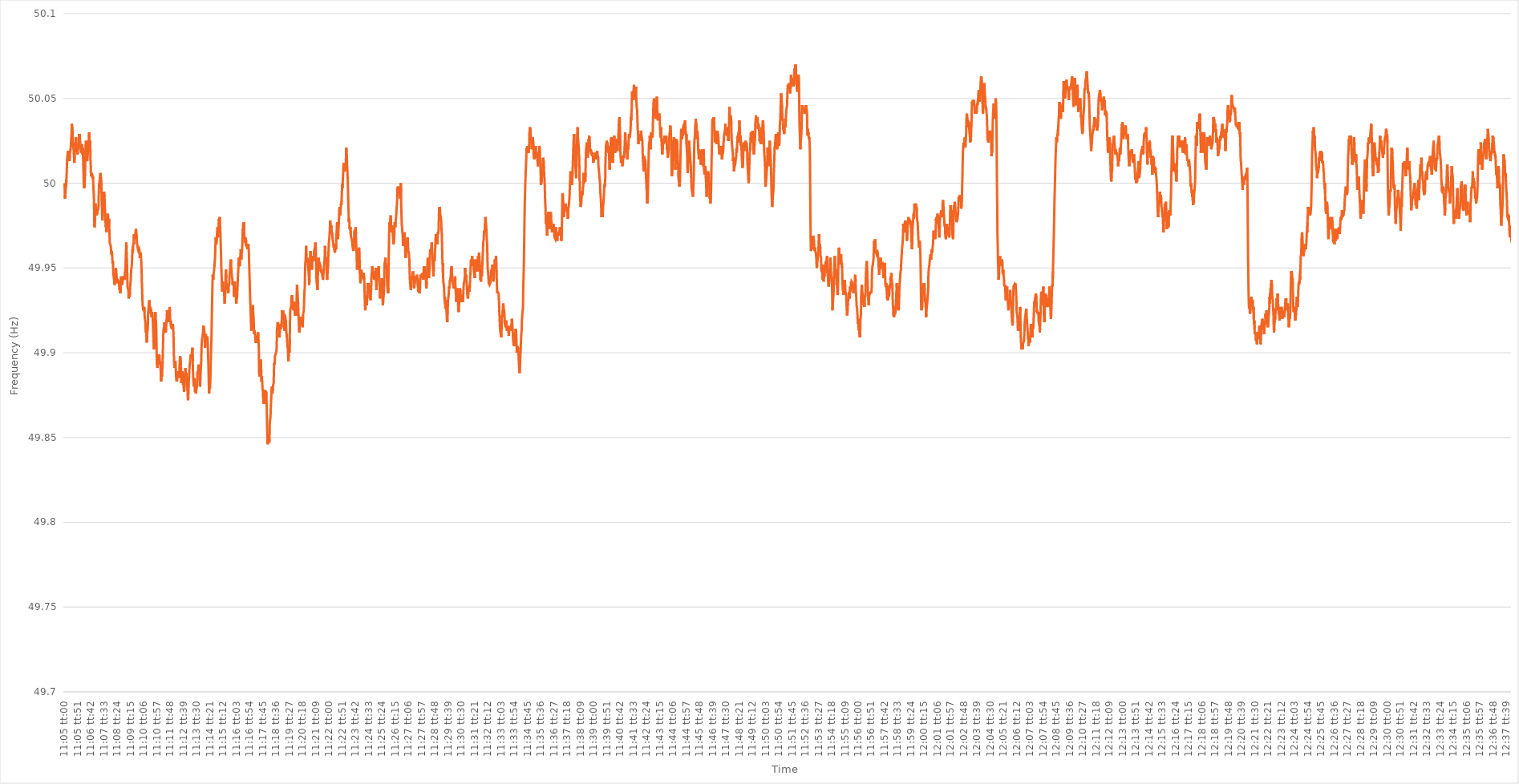
| Category | Series 0 |
|---|---|
| 0.4618055555555556 | 50 |
| 0.4618171296296296 | 49.998 |
| 0.4618287037037037 | 49.999 |
| 0.46184027777777775 | 49.991 |
| 0.4618518518518519 | 49.993 |
| 0.46186342592592594 | 49.995 |
| 0.46187500000000004 | 49.999 |
| 0.4618865740740741 | 49.998 |
| 0.4618981481481481 | 50.002 |
| 0.4619097222222222 | 50.005 |
| 0.46192129629629625 | 50.009 |
| 0.4619328703703704 | 50.014 |
| 0.46194444444444444 | 50.016 |
| 0.46195601851851853 | 50.017 |
| 0.46196759259259257 | 50.019 |
| 0.46197916666666666 | 50.016 |
| 0.4619907407407407 | 50.018 |
| 0.46200231481481485 | 50.016 |
| 0.4620138888888889 | 50.016 |
| 0.462025462962963 | 50.016 |
| 0.462037037037037 | 50.013 |
| 0.4620486111111111 | 50.016 |
| 0.46206018518518516 | 50.016 |
| 0.4620717592592593 | 50.016 |
| 0.46208333333333335 | 50.02 |
| 0.46209490740740744 | 50.021 |
| 0.4621064814814815 | 50.024 |
| 0.4621180555555556 | 50.027 |
| 0.4621296296296296 | 50.029 |
| 0.46214120370370365 | 50.035 |
| 0.4621527777777778 | 50.035 |
| 0.46216435185185184 | 50.032 |
| 0.46217592592592593 | 50.03 |
| 0.4621875 | 50.025 |
| 0.46219907407407407 | 50.025 |
| 0.4622106481481481 | 50.021 |
| 0.46222222222222226 | 50.02 |
| 0.4622337962962963 | 50.017 |
| 0.4622453703703704 | 50.017 |
| 0.46225694444444443 | 50.012 |
| 0.4622685185185185 | 50.017 |
| 0.46228009259259256 | 50.021 |
| 0.4622916666666667 | 50.024 |
| 0.46230324074074075 | 50.024 |
| 0.46231481481481485 | 50.023 |
| 0.4623263888888889 | 50.027 |
| 0.462337962962963 | 50.019 |
| 0.462349537037037 | 50.019 |
| 0.46236111111111106 | 50.021 |
| 0.4623726851851852 | 50.021 |
| 0.46238425925925924 | 50.021 |
| 0.46239583333333334 | 50.017 |
| 0.4624074074074074 | 50.021 |
| 0.4624189814814815 | 50.022 |
| 0.4624305555555555 | 50.02 |
| 0.46244212962962966 | 50.024 |
| 0.4624537037037037 | 50.025 |
| 0.4624652777777778 | 50.029 |
| 0.46247685185185183 | 50.025 |
| 0.46248842592592593 | 50.029 |
| 0.46249999999999997 | 50.027 |
| 0.4625115740740741 | 50.024 |
| 0.46252314814814816 | 50.023 |
| 0.46253472222222225 | 50.022 |
| 0.4625462962962963 | 50.019 |
| 0.4625578703703704 | 50.018 |
| 0.4625694444444444 | 50.021 |
| 0.46258101851851857 | 50.022 |
| 0.4625925925925926 | 50.023 |
| 0.46260416666666665 | 50.019 |
| 0.46261574074074074 | 50.017 |
| 0.4626273148148148 | 50.021 |
| 0.4626388888888889 | 50.017 |
| 0.4626504629629629 | 50.012 |
| 0.46266203703703707 | 50.006 |
| 0.4626736111111111 | 50 |
| 0.4626851851851852 | 49.997 |
| 0.46269675925925924 | 49.997 |
| 0.46270833333333333 | 49.998 |
| 0.46271990740740737 | 50.002 |
| 0.4627314814814815 | 50.006 |
| 0.46274305555555556 | 50.012 |
| 0.46275462962962965 | 50.021 |
| 0.4627662037037037 | 50.024 |
| 0.4627777777777778 | 50.025 |
| 0.4627893518518518 | 50.022 |
| 0.462800925925926 | 50.021 |
| 0.4628125 | 50.018 |
| 0.4628240740740741 | 50.013 |
| 0.46283564814814815 | 50.014 |
| 0.4628472222222222 | 50.014 |
| 0.4628587962962963 | 50.018 |
| 0.4628703703703703 | 50.018 |
| 0.46288194444444447 | 50.019 |
| 0.4628935185185185 | 50.024 |
| 0.4629050925925926 | 50.028 |
| 0.46291666666666664 | 50.03 |
| 0.46292824074074074 | 50.025 |
| 0.4629398148148148 | 50.024 |
| 0.4629513888888889 | 50.025 |
| 0.46296296296296297 | 50.023 |
| 0.46297453703703706 | 50.014 |
| 0.4629861111111111 | 50.01 |
| 0.4629976851851852 | 50.004 |
| 0.46300925925925923 | 50.004 |
| 0.4630208333333334 | 50.004 |
| 0.4630324074074074 | 50.006 |
| 0.4630439814814815 | 50.006 |
| 0.46305555555555555 | 50.006 |
| 0.46306712962962965 | 50.003 |
| 0.4630787037037037 | 50.004 |
| 0.4630902777777777 | 50.002 |
| 0.4631018518518519 | 49.999 |
| 0.4631134259259259 | 49.995 |
| 0.463125 | 49.993 |
| 0.46313657407407405 | 49.985 |
| 0.46314814814814814 | 49.976 |
| 0.4631597222222222 | 49.974 |
| 0.46317129629629633 | 49.983 |
| 0.46318287037037037 | 49.986 |
| 0.46319444444444446 | 49.988 |
| 0.4632060185185185 | 49.987 |
| 0.4632175925925926 | 49.985 |
| 0.46322916666666664 | 49.981 |
| 0.4632407407407408 | 49.982 |
| 0.4632523148148148 | 49.981 |
| 0.4632638888888889 | 49.983 |
| 0.46327546296296296 | 49.982 |
| 0.46328703703703705 | 49.985 |
| 0.4632986111111111 | 49.984 |
| 0.46331018518518513 | 49.985 |
| 0.4633217592592593 | 49.985 |
| 0.4633333333333333 | 49.986 |
| 0.4633449074074074 | 49.994 |
| 0.46335648148148145 | 49.999 |
| 0.46336805555555555 | 50 |
| 0.4633796296296296 | 49.999 |
| 0.46339120370370374 | 50.003 |
| 0.4634027777777778 | 50.004 |
| 0.46341435185185187 | 50.006 |
| 0.4634259259259259 | 50.005 |
| 0.4634375 | 50.004 |
| 0.46344907407407404 | 50.004 |
| 0.4634606481481482 | 50 |
| 0.46347222222222223 | 49.991 |
| 0.4634837962962963 | 49.987 |
| 0.46349537037037036 | 49.981 |
| 0.46350694444444446 | 49.978 |
| 0.4635185185185185 | 49.979 |
| 0.46353009259259265 | 49.983 |
| 0.4635416666666667 | 49.987 |
| 0.4635532407407407 | 49.992 |
| 0.4635648148148148 | 49.994 |
| 0.46357638888888886 | 49.995 |
| 0.46358796296296295 | 49.995 |
| 0.463599537037037 | 49.992 |
| 0.46361111111111114 | 49.987 |
| 0.4636226851851852 | 49.984 |
| 0.4636342592592593 | 49.981 |
| 0.4636458333333333 | 49.977 |
| 0.4636574074074074 | 49.974 |
| 0.46366898148148145 | 49.975 |
| 0.4636805555555556 | 49.974 |
| 0.46369212962962963 | 49.971 |
| 0.46370370370370373 | 49.975 |
| 0.46371527777777777 | 49.976 |
| 0.46372685185185186 | 49.978 |
| 0.4637384259259259 | 49.982 |
| 0.46375000000000005 | 49.982 |
| 0.4637615740740741 | 49.98 |
| 0.4637731481481482 | 49.976 |
| 0.4637847222222222 | 49.974 |
| 0.46379629629629626 | 49.979 |
| 0.46380787037037036 | 49.976 |
| 0.4638194444444444 | 49.972 |
| 0.46383101851851855 | 49.965 |
| 0.4638425925925926 | 49.965 |
| 0.4638541666666667 | 49.964 |
| 0.4638657407407407 | 49.964 |
| 0.4638773148148148 | 49.963 |
| 0.46388888888888885 | 49.961 |
| 0.463900462962963 | 49.959 |
| 0.46391203703703704 | 49.958 |
| 0.46392361111111113 | 49.96 |
| 0.4639351851851852 | 49.958 |
| 0.46394675925925927 | 49.956 |
| 0.4639583333333333 | 49.953 |
| 0.46396990740740746 | 49.954 |
| 0.4639814814814815 | 49.952 |
| 0.4639930555555556 | 49.947 |
| 0.46400462962962963 | 49.947 |
| 0.46401620370370367 | 49.944 |
| 0.46402777777777776 | 49.944 |
| 0.4640393518518518 | 49.942 |
| 0.46405092592592595 | 49.94 |
| 0.4640625 | 49.942 |
| 0.4640740740740741 | 49.943 |
| 0.4640856481481481 | 49.946 |
| 0.4640972222222222 | 49.947 |
| 0.46410879629629626 | 49.95 |
| 0.4641203703703704 | 49.95 |
| 0.46413194444444444 | 49.944 |
| 0.46414351851851854 | 49.944 |
| 0.4641550925925926 | 49.942 |
| 0.46416666666666667 | 49.942 |
| 0.4641782407407407 | 49.941 |
| 0.46418981481481486 | 49.943 |
| 0.4642013888888889 | 49.943 |
| 0.464212962962963 | 49.943 |
| 0.46422453703703703 | 49.943 |
| 0.4642361111111111 | 49.942 |
| 0.46424768518518517 | 49.941 |
| 0.4642592592592592 | 49.938 |
| 0.46427083333333335 | 49.937 |
| 0.4642824074074074 | 49.938 |
| 0.4642939814814815 | 49.939 |
| 0.4643055555555555 | 49.935 |
| 0.4643171296296296 | 49.939 |
| 0.46432870370370366 | 49.942 |
| 0.4643402777777778 | 49.945 |
| 0.46435185185185185 | 49.944 |
| 0.46436342592592594 | 49.941 |
| 0.464375 | 49.943 |
| 0.4643865740740741 | 49.94 |
| 0.4643981481481481 | 49.941 |
| 0.46440972222222227 | 49.942 |
| 0.4644212962962963 | 49.944 |
| 0.4644328703703704 | 49.945 |
| 0.46444444444444444 | 49.944 |
| 0.46445601851851853 | 49.944 |
| 0.46446759259259257 | 49.945 |
| 0.4644791666666667 | 49.944 |
| 0.46449074074074076 | 49.944 |
| 0.4645023148148148 | 49.943 |
| 0.4645138888888889 | 49.943 |
| 0.46452546296296293 | 49.948 |
| 0.464537037037037 | 49.951 |
| 0.46454861111111106 | 49.956 |
| 0.4645601851851852 | 49.961 |
| 0.46457175925925925 | 49.965 |
| 0.46458333333333335 | 49.961 |
| 0.4645949074074074 | 49.956 |
| 0.4646064814814815 | 49.951 |
| 0.4646180555555555 | 49.944 |
| 0.46462962962962967 | 49.939 |
| 0.4646412037037037 | 49.938 |
| 0.4646527777777778 | 49.938 |
| 0.46466435185185184 | 49.937 |
| 0.46467592592592594 | 49.932 |
| 0.4646875 | 49.932 |
| 0.4646990740740741 | 49.934 |
| 0.46471064814814816 | 49.934 |
| 0.4647222222222222 | 49.933 |
| 0.4647337962962963 | 49.936 |
| 0.46474537037037034 | 49.939 |
| 0.46475694444444443 | 49.941 |
| 0.46476851851851847 | 49.943 |
| 0.4647800925925926 | 49.946 |
| 0.46479166666666666 | 49.949 |
| 0.46480324074074075 | 49.95 |
| 0.4648148148148148 | 49.951 |
| 0.4648263888888889 | 49.954 |
| 0.4648379629629629 | 49.958 |
| 0.4648495370370371 | 49.961 |
| 0.4648611111111111 | 49.959 |
| 0.4648726851851852 | 49.963 |
| 0.46488425925925925 | 49.964 |
| 0.46489583333333334 | 49.965 |
| 0.4649074074074074 | 49.964 |
| 0.46491898148148153 | 49.97 |
| 0.46493055555555557 | 49.97 |
| 0.46494212962962966 | 49.967 |
| 0.4649537037037037 | 49.967 |
| 0.4649652777777778 | 49.968 |
| 0.46497685185185184 | 49.97 |
| 0.4649884259259259 | 49.97 |
| 0.465 | 49.973 |
| 0.46501157407407406 | 49.972 |
| 0.46502314814814816 | 49.972 |
| 0.4650347222222222 | 49.969 |
| 0.4650462962962963 | 49.965 |
| 0.46505787037037033 | 49.965 |
| 0.4650694444444445 | 49.963 |
| 0.4650810185185185 | 49.962 |
| 0.4650925925925926 | 49.961 |
| 0.46510416666666665 | 49.961 |
| 0.46511574074074075 | 49.96 |
| 0.4651273148148148 | 49.96 |
| 0.46513888888888894 | 49.96 |
| 0.465150462962963 | 49.961 |
| 0.46516203703703707 | 49.96 |
| 0.4651736111111111 | 49.956 |
| 0.4651851851851852 | 49.958 |
| 0.46519675925925924 | 49.959 |
| 0.4652083333333333 | 49.959 |
| 0.46521990740740743 | 49.958 |
| 0.46523148148148147 | 49.958 |
| 0.46524305555555556 | 49.953 |
| 0.4652546296296296 | 49.948 |
| 0.4652662037037037 | 49.941 |
| 0.46527777777777773 | 49.937 |
| 0.4652893518518519 | 49.932 |
| 0.4653009259259259 | 49.928 |
| 0.4653125 | 49.927 |
| 0.46532407407407406 | 49.925 |
| 0.46533564814814815 | 49.926 |
| 0.4653472222222222 | 49.925 |
| 0.46535879629629634 | 49.926 |
| 0.4653703703703704 | 49.927 |
| 0.4653819444444445 | 49.924 |
| 0.4653935185185185 | 49.921 |
| 0.4654050925925926 | 49.92 |
| 0.46541666666666665 | 49.919 |
| 0.4654282407407408 | 49.917 |
| 0.46543981481481483 | 49.912 |
| 0.4654513888888889 | 49.912 |
| 0.46546296296296297 | 49.913 |
| 0.465474537037037 | 49.909 |
| 0.4654861111111111 | 49.906 |
| 0.46549768518518514 | 49.909 |
| 0.4655092592592593 | 49.912 |
| 0.46552083333333333 | 49.912 |
| 0.4655324074074074 | 49.915 |
| 0.46554398148148146 | 49.923 |
| 0.46555555555555556 | 49.925 |
| 0.4655671296296296 | 49.926 |
| 0.46557870370370374 | 49.929 |
| 0.4655902777777778 | 49.929 |
| 0.4656018518518519 | 49.931 |
| 0.4656134259259259 | 49.928 |
| 0.465625 | 49.927 |
| 0.46563657407407405 | 49.926 |
| 0.4656481481481482 | 49.927 |
| 0.46565972222222224 | 49.923 |
| 0.46567129629629633 | 49.926 |
| 0.46568287037037037 | 49.924 |
| 0.4656944444444444 | 49.921 |
| 0.4657060185185185 | 49.922 |
| 0.46571759259259254 | 49.924 |
| 0.4657291666666667 | 49.923 |
| 0.46574074074074073 | 49.922 |
| 0.4657523148148148 | 49.92 |
| 0.46576388888888887 | 49.916 |
| 0.46577546296296296 | 49.912 |
| 0.465787037037037 | 49.908 |
| 0.46579861111111115 | 49.904 |
| 0.4658101851851852 | 49.902 |
| 0.4658217592592593 | 49.908 |
| 0.4658333333333333 | 49.909 |
| 0.4658449074074074 | 49.913 |
| 0.46585648148148145 | 49.918 |
| 0.4658680555555556 | 49.924 |
| 0.46587962962962964 | 49.921 |
| 0.46589120370370374 | 49.919 |
| 0.4659027777777778 | 49.917 |
| 0.4659143518518518 | 49.91 |
| 0.4659259259259259 | 49.9 |
| 0.46593749999999995 | 49.893 |
| 0.4659490740740741 | 49.892 |
| 0.46596064814814814 | 49.891 |
| 0.46597222222222223 | 49.892 |
| 0.46598379629629627 | 49.894 |
| 0.46599537037037037 | 49.898 |
| 0.4660069444444444 | 49.899 |
| 0.46601851851851855 | 49.899 |
| 0.4660300925925926 | 49.898 |
| 0.4660416666666667 | 49.899 |
| 0.4660532407407407 | 49.897 |
| 0.4660648148148148 | 49.893 |
| 0.46607638888888886 | 49.895 |
| 0.466087962962963 | 49.895 |
| 0.46609953703703705 | 49.893 |
| 0.46611111111111114 | 49.887 |
| 0.4661226851851852 | 49.883 |
| 0.4661342592592593 | 49.885 |
| 0.4661458333333333 | 49.888 |
| 0.46615740740740735 | 49.886 |
| 0.4661689814814815 | 49.887 |
| 0.46618055555555554 | 49.891 |
| 0.46619212962962964 | 49.895 |
| 0.4662037037037037 | 49.901 |
| 0.46621527777777777 | 49.907 |
| 0.4662268518518518 | 49.912 |
| 0.46623842592592596 | 49.914 |
| 0.46625 | 49.914 |
| 0.4662615740740741 | 49.916 |
| 0.46627314814814813 | 49.918 |
| 0.4662847222222222 | 49.916 |
| 0.46629629629629626 | 49.916 |
| 0.4663078703703704 | 49.914 |
| 0.46631944444444445 | 49.915 |
| 0.46633101851851855 | 49.912 |
| 0.4663425925925926 | 49.914 |
| 0.4663541666666667 | 49.916 |
| 0.4663657407407407 | 49.919 |
| 0.46637731481481487 | 49.92 |
| 0.4663888888888889 | 49.925 |
| 0.46640046296296295 | 49.925 |
| 0.46641203703703704 | 49.925 |
| 0.4664236111111111 | 49.921 |
| 0.4664351851851852 | 49.919 |
| 0.4664467592592592 | 49.919 |
| 0.46645833333333336 | 49.918 |
| 0.4664699074074074 | 49.918 |
| 0.4664814814814815 | 49.92 |
| 0.46649305555555554 | 49.926 |
| 0.46650462962962963 | 49.927 |
| 0.46651620370370367 | 49.924 |
| 0.4665277777777778 | 49.92 |
| 0.46653935185185186 | 49.918 |
| 0.46655092592592595 | 49.919 |
| 0.4665625 | 49.919 |
| 0.4665740740740741 | 49.915 |
| 0.4665856481481481 | 49.915 |
| 0.4665972222222223 | 49.915 |
| 0.4666087962962963 | 49.914 |
| 0.46662037037037035 | 49.916 |
| 0.46663194444444445 | 49.916 |
| 0.4666435185185185 | 49.917 |
| 0.4666550925925926 | 49.916 |
| 0.4666666666666666 | 49.914 |
| 0.46667824074074077 | 49.91 |
| 0.4666898148148148 | 49.902 |
| 0.4667013888888889 | 49.896 |
| 0.46671296296296294 | 49.893 |
| 0.46672453703703703 | 49.891 |
| 0.4667361111111111 | 49.891 |
| 0.4667476851851852 | 49.893 |
| 0.46675925925925926 | 49.895 |
| 0.46677083333333336 | 49.894 |
| 0.4667824074074074 | 49.889 |
| 0.4667939814814815 | 49.886 |
| 0.46680555555555553 | 49.884 |
| 0.4668171296296297 | 49.883 |
| 0.4668287037037037 | 49.883 |
| 0.4668402777777778 | 49.884 |
| 0.46685185185185185 | 49.886 |
| 0.4668634259259259 | 49.887 |
| 0.466875 | 49.889 |
| 0.466886574074074 | 49.888 |
| 0.4668981481481482 | 49.887 |
| 0.4669097222222222 | 49.887 |
| 0.4669212962962963 | 49.885 |
| 0.46693287037037035 | 49.886 |
| 0.46694444444444444 | 49.891 |
| 0.4669560185185185 | 49.895 |
| 0.46696759259259263 | 49.897 |
| 0.46697916666666667 | 49.898 |
| 0.46699074074074076 | 49.898 |
| 0.4670023148148148 | 49.893 |
| 0.4670138888888889 | 49.89 |
| 0.46702546296296293 | 49.882 |
| 0.4670370370370371 | 49.883 |
| 0.4670486111111111 | 49.886 |
| 0.4670601851851852 | 49.888 |
| 0.46707175925925926 | 49.889 |
| 0.46708333333333335 | 49.885 |
| 0.4670949074074074 | 49.883 |
| 0.46710648148148143 | 49.881 |
| 0.4671180555555556 | 49.883 |
| 0.4671296296296296 | 49.881 |
| 0.4671412037037037 | 49.878 |
| 0.46715277777777775 | 49.877 |
| 0.46716435185185184 | 49.881 |
| 0.4671759259259259 | 49.885 |
| 0.46718750000000003 | 49.887 |
| 0.46719907407407407 | 49.889 |
| 0.46721064814814817 | 49.891 |
| 0.4672222222222222 | 49.888 |
| 0.4672337962962963 | 49.887 |
| 0.46724537037037034 | 49.886 |
| 0.4672569444444445 | 49.888 |
| 0.4672685185185185 | 49.883 |
| 0.4672800925925926 | 49.88 |
| 0.46729166666666666 | 49.879 |
| 0.46730324074074076 | 49.878 |
| 0.4673148148148148 | 49.874 |
| 0.46732638888888883 | 49.872 |
| 0.467337962962963 | 49.874 |
| 0.467349537037037 | 49.879 |
| 0.4673611111111111 | 49.884 |
| 0.46737268518518515 | 49.886 |
| 0.46738425925925925 | 49.89 |
| 0.4673958333333333 | 49.892 |
| 0.46740740740740744 | 49.892 |
| 0.4674189814814815 | 49.895 |
| 0.46743055555555557 | 49.897 |
| 0.4674421296296296 | 49.898 |
| 0.4674537037037037 | 49.899 |
| 0.46746527777777774 | 49.897 |
| 0.4674768518518519 | 49.897 |
| 0.46748842592592593 | 49.899 |
| 0.4675 | 49.899 |
| 0.46751157407407407 | 49.899 |
| 0.46752314814814816 | 49.903 |
| 0.4675347222222222 | 49.895 |
| 0.46754629629629635 | 49.889 |
| 0.4675578703703704 | 49.885 |
| 0.4675694444444445 | 49.883 |
| 0.4675810185185185 | 49.881 |
| 0.46759259259259256 | 49.88 |
| 0.46760416666666665 | 49.883 |
| 0.4676157407407407 | 49.885 |
| 0.46762731481481484 | 49.882 |
| 0.4676388888888889 | 49.877 |
| 0.467650462962963 | 49.878 |
| 0.467662037037037 | 49.877 |
| 0.4676736111111111 | 49.876 |
| 0.46768518518518515 | 49.877 |
| 0.4676967592592593 | 49.877 |
| 0.46770833333333334 | 49.879 |
| 0.46771990740740743 | 49.88 |
| 0.46773148148148147 | 49.882 |
| 0.46774305555555556 | 49.887 |
| 0.4677546296296296 | 49.889 |
| 0.46776620370370375 | 49.888 |
| 0.4677777777777778 | 49.889 |
| 0.4677893518518519 | 49.892 |
| 0.4678009259259259 | 49.893 |
| 0.46781249999999996 | 49.892 |
| 0.46782407407407406 | 49.889 |
| 0.4678356481481481 | 49.888 |
| 0.46784722222222225 | 49.884 |
| 0.4678587962962963 | 49.88 |
| 0.4678703703703704 | 49.881 |
| 0.4678819444444444 | 49.886 |
| 0.4678935185185185 | 49.89 |
| 0.46790509259259255 | 49.892 |
| 0.4679166666666667 | 49.896 |
| 0.46792824074074074 | 49.903 |
| 0.46793981481481484 | 49.906 |
| 0.4679513888888889 | 49.908 |
| 0.46796296296296297 | 49.909 |
| 0.467974537037037 | 49.91 |
| 0.46798611111111116 | 49.911 |
| 0.4679976851851852 | 49.913 |
| 0.4680092592592593 | 49.916 |
| 0.46802083333333333 | 49.916 |
| 0.4680324074074074 | 49.915 |
| 0.46804398148148146 | 49.914 |
| 0.4680555555555555 | 49.913 |
| 0.46806712962962965 | 49.909 |
| 0.4680787037037037 | 49.905 |
| 0.4680902777777778 | 49.903 |
| 0.4681018518518518 | 49.909 |
| 0.4681134259259259 | 49.91 |
| 0.46812499999999996 | 49.911 |
| 0.4681365740740741 | 49.907 |
| 0.46814814814814815 | 49.909 |
| 0.46815972222222224 | 49.909 |
| 0.4681712962962963 | 49.909 |
| 0.4681828703703704 | 49.909 |
| 0.4681944444444444 | 49.909 |
| 0.46820601851851856 | 49.905 |
| 0.4682175925925926 | 49.9 |
| 0.4682291666666667 | 49.895 |
| 0.46824074074074074 | 49.89 |
| 0.46825231481481483 | 49.882 |
| 0.46826388888888887 | 49.876 |
| 0.468275462962963 | 49.879 |
| 0.46828703703703706 | 49.88 |
| 0.4682986111111111 | 49.879 |
| 0.4683101851851852 | 49.88 |
| 0.46832175925925923 | 49.884 |
| 0.4683333333333333 | 49.891 |
| 0.46834490740740736 | 49.897 |
| 0.4683564814814815 | 49.903 |
| 0.46836805555555555 | 49.907 |
| 0.46837962962962965 | 49.915 |
| 0.4683912037037037 | 49.924 |
| 0.4684027777777778 | 49.932 |
| 0.4684143518518518 | 49.939 |
| 0.46842592592592597 | 49.946 |
| 0.4684375 | 49.945 |
| 0.4684490740740741 | 49.943 |
| 0.46846064814814814 | 49.946 |
| 0.46847222222222223 | 49.947 |
| 0.4684837962962963 | 49.948 |
| 0.4684953703703704 | 49.95 |
| 0.46850694444444446 | 49.951 |
| 0.4685185185185185 | 49.954 |
| 0.4685300925925926 | 49.956 |
| 0.46854166666666663 | 49.96 |
| 0.46855324074074073 | 49.965 |
| 0.46856481481481477 | 49.968 |
| 0.4685763888888889 | 49.966 |
| 0.46858796296296296 | 49.964 |
| 0.46859953703703705 | 49.964 |
| 0.4686111111111111 | 49.968 |
| 0.4686226851851852 | 49.971 |
| 0.4686342592592592 | 49.973 |
| 0.4686458333333334 | 49.974 |
| 0.4686574074074074 | 49.969 |
| 0.4686689814814815 | 49.968 |
| 0.46868055555555554 | 49.97 |
| 0.46869212962962964 | 49.975 |
| 0.4687037037037037 | 49.979 |
| 0.46871527777777783 | 49.978 |
| 0.46872685185185187 | 49.979 |
| 0.46873842592592596 | 49.98 |
| 0.46875 | 49.976 |
| 0.46876157407407404 | 49.974 |
| 0.46877314814814813 | 49.97 |
| 0.46878472222222217 | 49.964 |
| 0.4687962962962963 | 49.959 |
| 0.46880787037037036 | 49.952 |
| 0.46881944444444446 | 49.947 |
| 0.4688310185185185 | 49.942 |
| 0.4688425925925926 | 49.937 |
| 0.4688541666666666 | 49.936 |
| 0.4688657407407408 | 49.938 |
| 0.4688773148148148 | 49.942 |
| 0.4688888888888889 | 49.94 |
| 0.46890046296296295 | 49.937 |
| 0.46891203703703704 | 49.937 |
| 0.4689236111111111 | 49.938 |
| 0.46893518518518523 | 49.936 |
| 0.46894675925925927 | 49.932 |
| 0.46895833333333337 | 49.929 |
| 0.4689699074074074 | 49.931 |
| 0.4689814814814815 | 49.933 |
| 0.46899305555555554 | 49.937 |
| 0.4690046296296296 | 49.946 |
| 0.4690162037037037 | 49.949 |
| 0.46902777777777777 | 49.944 |
| 0.46903935185185186 | 49.941 |
| 0.4690509259259259 | 49.941 |
| 0.4690625 | 49.939 |
| 0.46907407407407403 | 49.937 |
| 0.4690856481481482 | 49.94 |
| 0.4690972222222222 | 49.94 |
| 0.4691087962962963 | 49.938 |
| 0.46912037037037035 | 49.935 |
| 0.46913194444444445 | 49.937 |
| 0.4691435185185185 | 49.94 |
| 0.46915509259259264 | 49.94 |
| 0.4691666666666667 | 49.941 |
| 0.46917824074074077 | 49.946 |
| 0.4691898148148148 | 49.947 |
| 0.4692013888888889 | 49.947 |
| 0.46921296296296294 | 49.952 |
| 0.469224537037037 | 49.954 |
| 0.46923611111111113 | 49.955 |
| 0.46924768518518517 | 49.953 |
| 0.46925925925925926 | 49.949 |
| 0.4692708333333333 | 49.947 |
| 0.4692824074074074 | 49.945 |
| 0.46929398148148144 | 49.945 |
| 0.4693055555555556 | 49.943 |
| 0.4693171296296296 | 49.94 |
| 0.4693287037037037 | 49.942 |
| 0.46934027777777776 | 49.942 |
| 0.46935185185185185 | 49.941 |
| 0.4693634259259259 | 49.939 |
| 0.46937500000000004 | 49.933 |
| 0.4693865740740741 | 49.935 |
| 0.4693981481481482 | 49.935 |
| 0.4694097222222222 | 49.942 |
| 0.4694212962962963 | 49.941 |
| 0.46943287037037035 | 49.937 |
| 0.4694444444444445 | 49.938 |
| 0.46945601851851854 | 49.936 |
| 0.46946759259259263 | 49.931 |
| 0.46947916666666667 | 49.929 |
| 0.4694907407407407 | 49.93 |
| 0.4695023148148148 | 49.932 |
| 0.46951388888888884 | 49.933 |
| 0.469525462962963 | 49.937 |
| 0.46953703703703703 | 49.94 |
| 0.4695486111111111 | 49.944 |
| 0.46956018518518516 | 49.947 |
| 0.46957175925925926 | 49.95 |
| 0.4695833333333333 | 49.956 |
| 0.46959490740740745 | 49.955 |
| 0.4696064814814815 | 49.952 |
| 0.4696180555555556 | 49.952 |
| 0.4696296296296296 | 49.951 |
| 0.4696412037037037 | 49.953 |
| 0.46965277777777775 | 49.956 |
| 0.4696643518518519 | 49.958 |
| 0.46967592592592594 | 49.961 |
| 0.46968750000000004 | 49.96 |
| 0.4696990740740741 | 49.955 |
| 0.4697106481481481 | 49.956 |
| 0.4697222222222222 | 49.959 |
| 0.46973379629629625 | 49.96 |
| 0.4697453703703704 | 49.963 |
| 0.46975694444444444 | 49.967 |
| 0.46976851851851853 | 49.973 |
| 0.46978009259259257 | 49.972 |
| 0.46979166666666666 | 49.976 |
| 0.4698032407407407 | 49.975 |
| 0.46981481481481485 | 49.977 |
| 0.4698263888888889 | 49.972 |
| 0.469837962962963 | 49.969 |
| 0.469849537037037 | 49.968 |
| 0.4698611111111111 | 49.967 |
| 0.46987268518518516 | 49.965 |
| 0.4698842592592593 | 49.968 |
| 0.46989583333333335 | 49.965 |
| 0.46990740740740744 | 49.967 |
| 0.4699189814814815 | 49.963 |
| 0.4699305555555555 | 49.964 |
| 0.4699421296296296 | 49.964 |
| 0.46995370370370365 | 49.964 |
| 0.4699652777777778 | 49.962 |
| 0.46997685185185184 | 49.961 |
| 0.46998842592592593 | 49.964 |
| 0.47 | 49.963 |
| 0.47001157407407407 | 49.964 |
| 0.4700231481481481 | 49.963 |
| 0.47003472222222226 | 49.961 |
| 0.4700462962962963 | 49.956 |
| 0.4700578703703704 | 49.95 |
| 0.47006944444444443 | 49.945 |
| 0.4700810185185185 | 49.94 |
| 0.47009259259259256 | 49.934 |
| 0.4701041666666667 | 49.93 |
| 0.47011574074074075 | 49.925 |
| 0.47012731481481485 | 49.921 |
| 0.4701388888888889 | 49.916 |
| 0.470150462962963 | 49.913 |
| 0.470162037037037 | 49.915 |
| 0.47017361111111117 | 49.919 |
| 0.4701851851851852 | 49.923 |
| 0.47019675925925924 | 49.927 |
| 0.47020833333333334 | 49.927 |
| 0.4702199074074074 | 49.928 |
| 0.4702314814814815 | 49.924 |
| 0.4702430555555555 | 49.922 |
| 0.47025462962962966 | 49.919 |
| 0.4702662037037037 | 49.914 |
| 0.4702777777777778 | 49.911 |
| 0.47028935185185183 | 49.913 |
| 0.47030092592592593 | 49.912 |
| 0.47031249999999997 | 49.911 |
| 0.4703240740740741 | 49.91 |
| 0.47033564814814816 | 49.906 |
| 0.47034722222222225 | 49.91 |
| 0.4703587962962963 | 49.906 |
| 0.4703703703703704 | 49.908 |
| 0.4703819444444444 | 49.906 |
| 0.47039351851851857 | 49.909 |
| 0.4704050925925926 | 49.91 |
| 0.47041666666666665 | 49.91 |
| 0.47042824074074074 | 49.909 |
| 0.4704398148148148 | 49.909 |
| 0.4704513888888889 | 49.912 |
| 0.4704629629629629 | 49.909 |
| 0.47047453703703707 | 49.906 |
| 0.4704861111111111 | 49.902 |
| 0.4704976851851852 | 49.889 |
| 0.47050925925925924 | 49.886 |
| 0.47052083333333333 | 49.887 |
| 0.47053240740740737 | 49.89 |
| 0.4705439814814815 | 49.89 |
| 0.47055555555555556 | 49.894 |
| 0.47056712962962965 | 49.896 |
| 0.4705787037037037 | 49.896 |
| 0.4705902777777778 | 49.889 |
| 0.4706018518518518 | 49.883 |
| 0.470613425925926 | 49.886 |
| 0.470625 | 49.885 |
| 0.47063657407407405 | 49.883 |
| 0.47064814814814815 | 49.879 |
| 0.4706597222222222 | 49.878 |
| 0.4706712962962963 | 49.877 |
| 0.4706828703703703 | 49.871 |
| 0.47069444444444447 | 49.87 |
| 0.4707060185185185 | 49.872 |
| 0.4707175925925926 | 49.871 |
| 0.47072916666666664 | 49.87 |
| 0.47074074074074074 | 49.87 |
| 0.4707523148148148 | 49.874 |
| 0.4707638888888889 | 49.878 |
| 0.47077546296296297 | 49.877 |
| 0.47078703703703706 | 49.876 |
| 0.4707986111111111 | 49.875 |
| 0.4708101851851852 | 49.877 |
| 0.47082175925925923 | 49.873 |
| 0.4708333333333334 | 49.87 |
| 0.4708449074074074 | 49.863 |
| 0.4708564814814815 | 49.855 |
| 0.47086805555555555 | 49.849 |
| 0.47087962962962965 | 49.846 |
| 0.4708912037037037 | 49.848 |
| 0.4709027777777777 | 49.852 |
| 0.4709143518518519 | 49.851 |
| 0.4709259259259259 | 49.852 |
| 0.4709375 | 49.849 |
| 0.47094907407407405 | 49.847 |
| 0.47096064814814814 | 49.849 |
| 0.4709722222222222 | 49.858 |
| 0.47098379629629633 | 49.86 |
| 0.47099537037037037 | 49.861 |
| 0.47100694444444446 | 49.863 |
| 0.4710185185185185 | 49.868 |
| 0.4710300925925926 | 49.871 |
| 0.47104166666666664 | 49.874 |
| 0.4710532407407408 | 49.878 |
| 0.4710648148148148 | 49.88 |
| 0.4710763888888889 | 49.879 |
| 0.47108796296296296 | 49.876 |
| 0.47109953703703705 | 49.876 |
| 0.4711111111111111 | 49.879 |
| 0.47112268518518513 | 49.881 |
| 0.4711342592592593 | 49.881 |
| 0.4711458333333333 | 49.882 |
| 0.4711574074074074 | 49.889 |
| 0.47116898148148145 | 49.894 |
| 0.47118055555555555 | 49.893 |
| 0.4711921296296296 | 49.894 |
| 0.47120370370370374 | 49.898 |
| 0.4712152777777778 | 49.898 |
| 0.47122685185185187 | 49.898 |
| 0.4712384259259259 | 49.898 |
| 0.47125 | 49.9 |
| 0.47126157407407404 | 49.9 |
| 0.4712731481481482 | 49.901 |
| 0.47128472222222223 | 49.906 |
| 0.4712962962962963 | 49.914 |
| 0.47130787037037036 | 49.915 |
| 0.47131944444444446 | 49.918 |
| 0.4713310185185185 | 49.918 |
| 0.47134259259259265 | 49.918 |
| 0.4713541666666667 | 49.917 |
| 0.4713657407407407 | 49.917 |
| 0.4713773148148148 | 49.916 |
| 0.47138888888888886 | 49.915 |
| 0.47140046296296295 | 49.909 |
| 0.471412037037037 | 49.909 |
| 0.47142361111111114 | 49.915 |
| 0.4714351851851852 | 49.914 |
| 0.4714467592592593 | 49.916 |
| 0.4714583333333333 | 49.914 |
| 0.4714699074074074 | 49.915 |
| 0.47148148148148145 | 49.917 |
| 0.4714930555555556 | 49.915 |
| 0.47150462962962963 | 49.918 |
| 0.47151620370370373 | 49.921 |
| 0.47152777777777777 | 49.925 |
| 0.47153935185185186 | 49.92 |
| 0.4715509259259259 | 49.921 |
| 0.47156250000000005 | 49.925 |
| 0.4715740740740741 | 49.923 |
| 0.4715856481481482 | 49.921 |
| 0.4715972222222222 | 49.922 |
| 0.47160879629629626 | 49.923 |
| 0.47162037037037036 | 49.916 |
| 0.4716319444444444 | 49.913 |
| 0.47164351851851855 | 49.916 |
| 0.4716550925925926 | 49.922 |
| 0.4716666666666667 | 49.92 |
| 0.4716782407407407 | 49.92 |
| 0.4716898148148148 | 49.919 |
| 0.47170138888888885 | 49.919 |
| 0.471712962962963 | 49.912 |
| 0.47172453703703704 | 49.911 |
| 0.47173611111111113 | 49.909 |
| 0.4717476851851852 | 49.907 |
| 0.47175925925925927 | 49.904 |
| 0.4717708333333333 | 49.903 |
| 0.47178240740740746 | 49.902 |
| 0.4717939814814815 | 49.897 |
| 0.4718055555555556 | 49.895 |
| 0.47181712962962963 | 49.899 |
| 0.47182870370370367 | 49.902 |
| 0.47184027777777776 | 49.901 |
| 0.4718518518518518 | 49.9 |
| 0.47186342592592595 | 49.908 |
| 0.471875 | 49.918 |
| 0.4718865740740741 | 49.925 |
| 0.4718981481481481 | 49.926 |
| 0.4719097222222222 | 49.926 |
| 0.47192129629629626 | 49.927 |
| 0.4719328703703704 | 49.928 |
| 0.47194444444444444 | 49.933 |
| 0.47195601851851854 | 49.932 |
| 0.4719675925925926 | 49.934 |
| 0.47197916666666667 | 49.932 |
| 0.4719907407407407 | 49.93 |
| 0.47200231481481486 | 49.928 |
| 0.4720138888888889 | 49.927 |
| 0.472025462962963 | 49.925 |
| 0.47203703703703703 | 49.928 |
| 0.4720486111111111 | 49.928 |
| 0.47206018518518517 | 49.928 |
| 0.4720717592592593 | 49.93 |
| 0.47208333333333335 | 49.927 |
| 0.4720949074074074 | 49.922 |
| 0.4721064814814815 | 49.923 |
| 0.4721180555555555 | 49.924 |
| 0.4721296296296296 | 49.922 |
| 0.47214120370370366 | 49.924 |
| 0.4721527777777778 | 49.922 |
| 0.47216435185185185 | 49.926 |
| 0.47217592592592594 | 49.935 |
| 0.4721875 | 49.94 |
| 0.4721990740740741 | 49.938 |
| 0.4722106481481481 | 49.936 |
| 0.47222222222222227 | 49.933 |
| 0.4722337962962963 | 49.93 |
| 0.4722453703703704 | 49.925 |
| 0.47225694444444444 | 49.921 |
| 0.47226851851851853 | 49.921 |
| 0.47228009259259257 | 49.913 |
| 0.4722916666666667 | 49.912 |
| 0.47230324074074076 | 49.914 |
| 0.4723148148148148 | 49.916 |
| 0.4723263888888889 | 49.917 |
| 0.47233796296296293 | 49.921 |
| 0.472349537037037 | 49.917 |
| 0.47236111111111106 | 49.916 |
| 0.4723726851851852 | 49.918 |
| 0.47238425925925925 | 49.918 |
| 0.47239583333333335 | 49.919 |
| 0.4724074074074074 | 49.917 |
| 0.4724189814814815 | 49.917 |
| 0.4724305555555555 | 49.916 |
| 0.47244212962962967 | 49.915 |
| 0.4724537037037037 | 49.922 |
| 0.4724652777777778 | 49.923 |
| 0.47247685185185184 | 49.923 |
| 0.47248842592592594 | 49.925 |
| 0.4725 | 49.928 |
| 0.4725115740740741 | 49.933 |
| 0.47252314814814816 | 49.937 |
| 0.4725347222222222 | 49.938 |
| 0.4725462962962963 | 49.947 |
| 0.47255787037037034 | 49.953 |
| 0.47256944444444443 | 49.954 |
| 0.47258101851851847 | 49.958 |
| 0.4725925925925926 | 49.963 |
| 0.47260416666666666 | 49.957 |
| 0.47261574074074075 | 49.957 |
| 0.4726273148148148 | 49.953 |
| 0.4726388888888889 | 49.955 |
| 0.4726504629629629 | 49.956 |
| 0.4726620370370371 | 49.955 |
| 0.4726736111111111 | 49.953 |
| 0.4726851851851852 | 49.951 |
| 0.47269675925925925 | 49.949 |
| 0.47270833333333334 | 49.947 |
| 0.4727199074074074 | 49.945 |
| 0.47273148148148153 | 49.94 |
| 0.47274305555555557 | 49.944 |
| 0.47275462962962966 | 49.944 |
| 0.4727662037037037 | 49.954 |
| 0.4727777777777778 | 49.956 |
| 0.47278935185185184 | 49.96 |
| 0.4728009259259259 | 49.955 |
| 0.4728125 | 49.956 |
| 0.47282407407407406 | 49.957 |
| 0.47283564814814816 | 49.955 |
| 0.4728472222222222 | 49.949 |
| 0.4728587962962963 | 49.952 |
| 0.47287037037037033 | 49.952 |
| 0.4728819444444445 | 49.952 |
| 0.4728935185185185 | 49.956 |
| 0.4729050925925926 | 49.957 |
| 0.47291666666666665 | 49.956 |
| 0.47292824074074075 | 49.954 |
| 0.4729398148148148 | 49.955 |
| 0.47295138888888894 | 49.96 |
| 0.472962962962963 | 49.96 |
| 0.47297453703703707 | 49.96 |
| 0.4729861111111111 | 49.962 |
| 0.4729976851851852 | 49.962 |
| 0.47300925925925924 | 49.965 |
| 0.4730208333333333 | 49.963 |
| 0.47303240740740743 | 49.958 |
| 0.47304398148148147 | 49.952 |
| 0.47305555555555556 | 49.944 |
| 0.4730671296296296 | 49.941 |
| 0.4730787037037037 | 49.94 |
| 0.47309027777777773 | 49.939 |
| 0.4731018518518519 | 49.937 |
| 0.4731134259259259 | 49.943 |
| 0.473125 | 49.948 |
| 0.47313657407407406 | 49.953 |
| 0.47314814814814815 | 49.956 |
| 0.4731597222222222 | 49.951 |
| 0.47317129629629634 | 49.951 |
| 0.4731828703703704 | 49.951 |
| 0.4731944444444445 | 49.951 |
| 0.4732060185185185 | 49.952 |
| 0.4732175925925926 | 49.951 |
| 0.47322916666666665 | 49.952 |
| 0.4732407407407407 | 49.952 |
| 0.47325231481481483 | 49.948 |
| 0.4732638888888889 | 49.949 |
| 0.47327546296296297 | 49.948 |
| 0.473287037037037 | 49.947 |
| 0.4732986111111111 | 49.949 |
| 0.47331018518518514 | 49.946 |
| 0.4733217592592593 | 49.946 |
| 0.47333333333333333 | 49.946 |
| 0.4733449074074074 | 49.943 |
| 0.47335648148148146 | 49.944 |
| 0.47336805555555556 | 49.946 |
| 0.4733796296296296 | 49.946 |
| 0.47339120370370374 | 49.95 |
| 0.4734027777777778 | 49.953 |
| 0.4734143518518519 | 49.954 |
| 0.4734259259259259 | 49.957 |
| 0.4734375 | 49.963 |
| 0.47344907407407405 | 49.961 |
| 0.4734606481481482 | 49.956 |
| 0.47347222222222224 | 49.953 |
| 0.47348379629629633 | 49.956 |
| 0.47349537037037037 | 49.954 |
| 0.4735069444444444 | 49.952 |
| 0.4735185185185185 | 49.945 |
| 0.47353009259259254 | 49.943 |
| 0.4735416666666667 | 49.944 |
| 0.47355324074074073 | 49.948 |
| 0.4735648148148148 | 49.949 |
| 0.47357638888888887 | 49.953 |
| 0.47358796296296296 | 49.958 |
| 0.473599537037037 | 49.961 |
| 0.47361111111111115 | 49.965 |
| 0.4736226851851852 | 49.965 |
| 0.4736342592592593 | 49.968 |
| 0.4736458333333333 | 49.971 |
| 0.4736574074074074 | 49.971 |
| 0.47366898148148145 | 49.978 |
| 0.4736805555555556 | 49.975 |
| 0.47369212962962964 | 49.971 |
| 0.47370370370370374 | 49.972 |
| 0.4737152777777778 | 49.975 |
| 0.4737268518518518 | 49.973 |
| 0.4737384259259259 | 49.97 |
| 0.47374999999999995 | 49.971 |
| 0.4737615740740741 | 49.971 |
| 0.47377314814814814 | 49.968 |
| 0.47378472222222223 | 49.966 |
| 0.47379629629629627 | 49.965 |
| 0.47380787037037037 | 49.965 |
| 0.4738194444444444 | 49.965 |
| 0.47383101851851855 | 49.962 |
| 0.4738425925925926 | 49.964 |
| 0.4738541666666667 | 49.964 |
| 0.4738657407407407 | 49.96 |
| 0.4738773148148148 | 49.959 |
| 0.47388888888888886 | 49.959 |
| 0.473900462962963 | 49.962 |
| 0.47391203703703705 | 49.964 |
| 0.47392361111111114 | 49.961 |
| 0.4739351851851852 | 49.963 |
| 0.4739467592592593 | 49.97 |
| 0.4739583333333333 | 49.971 |
| 0.47396990740740735 | 49.976 |
| 0.4739814814814815 | 49.977 |
| 0.47399305555555554 | 49.973 |
| 0.47400462962962964 | 49.968 |
| 0.4740162037037037 | 49.967 |
| 0.47402777777777777 | 49.97 |
| 0.4740393518518518 | 49.973 |
| 0.47405092592592596 | 49.976 |
| 0.4740625 | 49.98 |
| 0.4740740740740741 | 49.985 |
| 0.47408564814814813 | 49.986 |
| 0.4740972222222222 | 49.984 |
| 0.47410879629629626 | 49.981 |
| 0.4741203703703704 | 49.982 |
| 0.47413194444444445 | 49.985 |
| 0.47414351851851855 | 49.985 |
| 0.4741550925925926 | 49.988 |
| 0.4741666666666667 | 49.987 |
| 0.4741782407407407 | 49.99 |
| 0.47418981481481487 | 49.994 |
| 0.4742013888888889 | 49.999 |
| 0.47421296296296295 | 49.997 |
| 0.47422453703703704 | 50 |
| 0.4742361111111111 | 50.003 |
| 0.4742476851851852 | 50.006 |
| 0.4742592592592592 | 50.011 |
| 0.47427083333333336 | 50.011 |
| 0.4742824074074074 | 50.012 |
| 0.4742939814814815 | 50.011 |
| 0.47430555555555554 | 50.012 |
| 0.47431712962962963 | 50.011 |
| 0.47432870370370367 | 50.007 |
| 0.4743402777777778 | 50.009 |
| 0.47435185185185186 | 50.008 |
| 0.47436342592592595 | 50.011 |
| 0.474375 | 50.016 |
| 0.4743865740740741 | 50.021 |
| 0.4743981481481481 | 50.018 |
| 0.4744097222222223 | 50.017 |
| 0.4744212962962963 | 50.011 |
| 0.47443287037037035 | 50.008 |
| 0.47444444444444445 | 50.004 |
| 0.4744560185185185 | 50 |
| 0.4744675925925926 | 49.993 |
| 0.4744791666666666 | 49.987 |
| 0.47449074074074077 | 49.982 |
| 0.4745023148148148 | 49.977 |
| 0.4745138888888889 | 49.979 |
| 0.47452546296296294 | 49.977 |
| 0.47453703703703703 | 49.973 |
| 0.4745486111111111 | 49.974 |
| 0.4745601851851852 | 49.973 |
| 0.47457175925925926 | 49.974 |
| 0.47458333333333336 | 49.97 |
| 0.4745949074074074 | 49.97 |
| 0.4746064814814815 | 49.968 |
| 0.47461805555555553 | 49.968 |
| 0.4746296296296297 | 49.968 |
| 0.4746412037037037 | 49.966 |
| 0.4746527777777778 | 49.965 |
| 0.47466435185185185 | 49.963 |
| 0.47467592592592595 | 49.963 |
| 0.4746875 | 49.961 |
| 0.474699074074074 | 49.961 |
| 0.4747106481481482 | 49.96 |
| 0.4747222222222222 | 49.96 |
| 0.4747337962962963 | 49.966 |
| 0.47474537037037035 | 49.971 |
| 0.47475694444444444 | 49.972 |
| 0.4747685185185185 | 49.971 |
| 0.47478009259259263 | 49.971 |
| 0.47479166666666667 | 49.973 |
| 0.47480324074074076 | 49.974 |
| 0.4748148148148148 | 49.97 |
| 0.4748263888888889 | 49.965 |
| 0.47483796296296293 | 49.961 |
| 0.4748495370370371 | 49.958 |
| 0.4748611111111111 | 49.95 |
| 0.4748726851851852 | 49.949 |
| 0.47488425925925926 | 49.952 |
| 0.47489583333333335 | 49.953 |
| 0.4749074074074074 | 49.956 |
| 0.47491898148148143 | 49.957 |
| 0.4749305555555556 | 49.961 |
| 0.4749421296296296 | 49.96 |
| 0.4749537037037037 | 49.962 |
| 0.47496527777777775 | 49.961 |
| 0.47497685185185184 | 49.958 |
| 0.4749884259259259 | 49.947 |
| 0.47500000000000003 | 49.946 |
| 0.47501157407407407 | 49.941 |
| 0.47502314814814817 | 49.942 |
| 0.4750347222222222 | 49.942 |
| 0.4750462962962963 | 49.944 |
| 0.47505787037037034 | 49.949 |
| 0.4750694444444445 | 49.949 |
| 0.4750810185185185 | 49.946 |
| 0.4750925925925926 | 49.946 |
| 0.47510416666666666 | 49.946 |
| 0.47511574074074076 | 49.945 |
| 0.4751273148148148 | 49.945 |
| 0.47513888888888883 | 49.945 |
| 0.475150462962963 | 49.945 |
| 0.475162037037037 | 49.947 |
| 0.4751736111111111 | 49.947 |
| 0.47518518518518515 | 49.943 |
| 0.47519675925925925 | 49.939 |
| 0.4752083333333333 | 49.934 |
| 0.47521990740740744 | 49.928 |
| 0.4752314814814815 | 49.925 |
| 0.47524305555555557 | 49.926 |
| 0.4752546296296296 | 49.93 |
| 0.4752662037037037 | 49.934 |
| 0.47527777777777774 | 49.934 |
| 0.4752893518518519 | 49.934 |
| 0.47530092592592593 | 49.928 |
| 0.4753125 | 49.93 |
| 0.47532407407407407 | 49.933 |
| 0.47533564814814816 | 49.941 |
| 0.4753472222222222 | 49.94 |
| 0.47535879629629635 | 49.941 |
| 0.4753703703703704 | 49.94 |
| 0.4753819444444445 | 49.941 |
| 0.4753935185185185 | 49.94 |
| 0.47540509259259256 | 49.938 |
| 0.47541666666666665 | 49.935 |
| 0.4754282407407407 | 49.933 |
| 0.47543981481481484 | 49.933 |
| 0.4754513888888889 | 49.932 |
| 0.475462962962963 | 49.931 |
| 0.475474537037037 | 49.933 |
| 0.4754861111111111 | 49.935 |
| 0.47549768518518515 | 49.939 |
| 0.4755092592592593 | 49.945 |
| 0.47552083333333334 | 49.947 |
| 0.47553240740740743 | 49.948 |
| 0.47554398148148147 | 49.951 |
| 0.47555555555555556 | 49.95 |
| 0.4755671296296296 | 49.946 |
| 0.47557870370370375 | 49.947 |
| 0.4755902777777778 | 49.946 |
| 0.4756018518518519 | 49.947 |
| 0.4756134259259259 | 49.944 |
| 0.47562499999999996 | 49.943 |
| 0.47563657407407406 | 49.944 |
| 0.4756481481481481 | 49.945 |
| 0.47565972222222225 | 49.948 |
| 0.4756712962962963 | 49.945 |
| 0.4756828703703704 | 49.946 |
| 0.4756944444444444 | 49.95 |
| 0.4757060185185185 | 49.947 |
| 0.47571759259259255 | 49.94 |
| 0.4757291666666667 | 49.937 |
| 0.47574074074074074 | 49.94 |
| 0.47575231481481484 | 49.943 |
| 0.4757638888888889 | 49.945 |
| 0.47577546296296297 | 49.947 |
| 0.475787037037037 | 49.949 |
| 0.47579861111111116 | 49.949 |
| 0.4758101851851852 | 49.946 |
| 0.4758217592592593 | 49.95 |
| 0.47583333333333333 | 49.951 |
| 0.47584490740740737 | 49.947 |
| 0.47585648148148146 | 49.943 |
| 0.4758680555555555 | 49.941 |
| 0.47587962962962965 | 49.938 |
| 0.4758912037037037 | 49.932 |
| 0.4759027777777778 | 49.934 |
| 0.4759143518518518 | 49.939 |
| 0.4759259259259259 | 49.941 |
| 0.47593749999999996 | 49.939 |
| 0.4759490740740741 | 49.938 |
| 0.47596064814814815 | 49.942 |
| 0.47597222222222224 | 49.944 |
| 0.4759837962962963 | 49.941 |
| 0.4759953703703704 | 49.934 |
| 0.4760069444444444 | 49.931 |
| 0.47601851851851856 | 49.928 |
| 0.4760300925925926 | 49.93 |
| 0.4760416666666667 | 49.932 |
| 0.47605324074074074 | 49.934 |
| 0.47606481481481483 | 49.936 |
| 0.47607638888888887 | 49.941 |
| 0.476087962962963 | 49.949 |
| 0.47609953703703706 | 49.953 |
| 0.4761111111111111 | 49.953 |
| 0.4761226851851852 | 49.954 |
| 0.47613425925925923 | 49.956 |
| 0.4761458333333333 | 49.954 |
| 0.47615740740740736 | 49.952 |
| 0.4761689814814815 | 49.952 |
| 0.47618055555555555 | 49.952 |
| 0.47619212962962965 | 49.949 |
| 0.4762037037037037 | 49.943 |
| 0.4762152777777778 | 49.94 |
| 0.4762268518518518 | 49.937 |
| 0.47623842592592597 | 49.937 |
| 0.47625 | 49.935 |
| 0.4762615740740741 | 49.938 |
| 0.47627314814814814 | 49.95 |
| 0.47628472222222223 | 49.96 |
| 0.4762962962962963 | 49.969 |
| 0.4763078703703704 | 49.976 |
| 0.47631944444444446 | 49.977 |
| 0.4763310185185185 | 49.977 |
| 0.4763425925925926 | 49.974 |
| 0.47635416666666663 | 49.978 |
| 0.47636574074074073 | 49.981 |
| 0.47637731481481477 | 49.977 |
| 0.4763888888888889 | 49.973 |
| 0.47640046296296296 | 49.971 |
| 0.47641203703703705 | 49.973 |
| 0.4764236111111111 | 49.973 |
| 0.4764351851851852 | 49.972 |
| 0.4764467592592592 | 49.972 |
| 0.4764583333333334 | 49.975 |
| 0.4764699074074074 | 49.969 |
| 0.4764814814814815 | 49.966 |
| 0.47649305555555554 | 49.964 |
| 0.47650462962962964 | 49.964 |
| 0.4765162037037037 | 49.964 |
| 0.47652777777777783 | 49.969 |
| 0.47653935185185187 | 49.976 |
| 0.47655092592592596 | 49.977 |
| 0.4765625 | 49.975 |
| 0.47657407407407404 | 49.974 |
| 0.47658564814814813 | 49.977 |
| 0.47659722222222217 | 49.977 |
| 0.4766087962962963 | 49.98 |
| 0.47662037037037036 | 49.982 |
| 0.47663194444444446 | 49.986 |
| 0.4766435185185185 | 49.987 |
| 0.4766550925925926 | 49.99 |
| 0.4766666666666666 | 49.997 |
| 0.4766782407407408 | 49.995 |
| 0.4766898148148148 | 49.998 |
| 0.4767013888888889 | 49.998 |
| 0.47671296296296295 | 49.994 |
| 0.47672453703703704 | 49.995 |
| 0.4767361111111111 | 49.995 |
| 0.47674768518518523 | 49.993 |
| 0.47675925925925927 | 49.995 |
| 0.47677083333333337 | 49.995 |
| 0.4767824074074074 | 49.997 |
| 0.4767939814814815 | 49.991 |
| 0.47680555555555554 | 49.997 |
| 0.4768171296296296 | 50 |
| 0.4768287037037037 | 49.995 |
| 0.47684027777777777 | 49.985 |
| 0.47685185185185186 | 49.98 |
| 0.4768634259259259 | 49.975 |
| 0.476875 | 49.974 |
| 0.47688657407407403 | 49.972 |
| 0.4768981481481482 | 49.97 |
| 0.4769097222222222 | 49.967 |
| 0.4769212962962963 | 49.963 |
| 0.47693287037037035 | 49.964 |
| 0.47694444444444445 | 49.965 |
| 0.4769560185185185 | 49.965 |
| 0.47696759259259264 | 49.968 |
| 0.4769791666666667 | 49.971 |
| 0.47699074074074077 | 49.969 |
| 0.4770023148148148 | 49.966 |
| 0.4770138888888889 | 49.961 |
| 0.47702546296296294 | 49.957 |
| 0.477037037037037 | 49.956 |
| 0.47704861111111113 | 49.958 |
| 0.47706018518518517 | 49.958 |
| 0.47707175925925926 | 49.963 |
| 0.4770833333333333 | 49.965 |
| 0.4770949074074074 | 49.965 |
| 0.47710648148148144 | 49.966 |
| 0.4771180555555556 | 49.968 |
| 0.4771296296296296 | 49.966 |
| 0.4771412037037037 | 49.963 |
| 0.47715277777777776 | 49.96 |
| 0.47716435185185185 | 49.96 |
| 0.4771759259259259 | 49.959 |
| 0.47718750000000004 | 49.957 |
| 0.4771990740740741 | 49.955 |
| 0.4772106481481482 | 49.949 |
| 0.4772222222222222 | 49.944 |
| 0.4772337962962963 | 49.941 |
| 0.47724537037037035 | 49.94 |
| 0.4772569444444445 | 49.938 |
| 0.47726851851851854 | 49.937 |
| 0.47728009259259263 | 49.937 |
| 0.47729166666666667 | 49.94 |
| 0.4773032407407407 | 49.945 |
| 0.4773148148148148 | 49.945 |
| 0.47732638888888884 | 49.943 |
| 0.477337962962963 | 49.945 |
| 0.47734953703703703 | 49.947 |
| 0.4773611111111111 | 49.948 |
| 0.47737268518518516 | 49.946 |
| 0.47738425925925926 | 49.946 |
| 0.4773958333333333 | 49.944 |
| 0.47740740740740745 | 49.939 |
| 0.4774189814814815 | 49.938 |
| 0.4774305555555556 | 49.943 |
| 0.4774421296296296 | 49.941 |
| 0.4774537037037037 | 49.943 |
| 0.47746527777777775 | 49.945 |
| 0.4774768518518519 | 49.944 |
| 0.47748842592592594 | 49.945 |
| 0.47750000000000004 | 49.944 |
| 0.4775115740740741 | 49.945 |
| 0.4775231481481481 | 49.944 |
| 0.4775347222222222 | 49.946 |
| 0.47754629629629625 | 49.943 |
| 0.4775578703703704 | 49.943 |
| 0.47756944444444444 | 49.944 |
| 0.47758101851851853 | 49.94 |
| 0.47759259259259257 | 49.936 |
| 0.47760416666666666 | 49.937 |
| 0.4776157407407407 | 49.941 |
| 0.47762731481481485 | 49.939 |
| 0.4776388888888889 | 49.936 |
| 0.477650462962963 | 49.935 |
| 0.477662037037037 | 49.936 |
| 0.4776736111111111 | 49.938 |
| 0.47768518518518516 | 49.942 |
| 0.4776967592592593 | 49.946 |
| 0.47770833333333335 | 49.945 |
| 0.47771990740740744 | 49.946 |
| 0.4777314814814815 | 49.944 |
| 0.4777430555555555 | 49.944 |
| 0.4777546296296296 | 49.946 |
| 0.47776620370370365 | 49.946 |
| 0.4777777777777778 | 49.945 |
| 0.47778935185185184 | 49.947 |
| 0.47780092592592593 | 49.944 |
| 0.4778125 | 49.944 |
| 0.47782407407407407 | 49.943 |
| 0.4778356481481481 | 49.947 |
| 0.47784722222222226 | 49.951 |
| 0.4778587962962963 | 49.95 |
| 0.4778703703703704 | 49.951 |
| 0.47788194444444443 | 49.951 |
| 0.4778935185185185 | 49.949 |
| 0.47790509259259256 | 49.947 |
| 0.4779166666666667 | 49.945 |
| 0.47792824074074075 | 49.945 |
| 0.47793981481481485 | 49.943 |
| 0.4779513888888889 | 49.939 |
| 0.477962962962963 | 49.938 |
| 0.477974537037037 | 49.942 |
| 0.47798611111111117 | 49.947 |
| 0.4779976851851852 | 49.949 |
| 0.47800925925925924 | 49.953 |
| 0.47802083333333334 | 49.956 |
| 0.4780324074074074 | 49.955 |
| 0.4780439814814815 | 49.95 |
| 0.4780555555555555 | 49.945 |
| 0.47806712962962966 | 49.944 |
| 0.4780787037037037 | 49.945 |
| 0.4780902777777778 | 49.947 |
| 0.47810185185185183 | 49.951 |
| 0.47811342592592593 | 49.957 |
| 0.47812499999999997 | 49.96 |
| 0.4781365740740741 | 49.961 |
| 0.47814814814814816 | 49.96 |
| 0.47815972222222225 | 49.958 |
| 0.4781712962962963 | 49.96 |
| 0.4781828703703704 | 49.96 |
| 0.4781944444444444 | 49.965 |
| 0.47820601851851857 | 49.964 |
| 0.4782175925925926 | 49.96 |
| 0.47822916666666665 | 49.954 |
| 0.47824074074074074 | 49.952 |
| 0.4782523148148148 | 49.95 |
| 0.4782638888888889 | 49.947 |
| 0.4782754629629629 | 49.945 |
| 0.47828703703703707 | 49.951 |
| 0.4782986111111111 | 49.954 |
| 0.4783101851851852 | 49.956 |
| 0.47832175925925924 | 49.954 |
| 0.47833333333333333 | 49.958 |
| 0.47834490740740737 | 49.958 |
| 0.4783564814814815 | 49.962 |
| 0.47836805555555556 | 49.967 |
| 0.47837962962962965 | 49.97 |
| 0.4783912037037037 | 49.968 |
| 0.4784027777777778 | 49.967 |
| 0.4784143518518518 | 49.965 |
| 0.478425925925926 | 49.966 |
| 0.4784375 | 49.966 |
| 0.47844907407407405 | 49.964 |
| 0.47846064814814815 | 49.968 |
| 0.4784722222222222 | 49.971 |
| 0.4784837962962963 | 49.97 |
| 0.4784953703703703 | 49.971 |
| 0.47850694444444447 | 49.973 |
| 0.4785185185185185 | 49.981 |
| 0.4785300925925926 | 49.985 |
| 0.47854166666666664 | 49.986 |
| 0.47855324074074074 | 49.986 |
| 0.4785648148148148 | 49.985 |
| 0.4785763888888889 | 49.982 |
| 0.47858796296296297 | 49.982 |
| 0.47859953703703706 | 49.982 |
| 0.4786111111111111 | 49.979 |
| 0.4786226851851852 | 49.977 |
| 0.47863425925925923 | 49.972 |
| 0.4786458333333334 | 49.971 |
| 0.4786574074074074 | 49.965 |
| 0.4786689814814815 | 49.958 |
| 0.47868055555555555 | 49.952 |
| 0.47869212962962965 | 49.953 |
| 0.4787037037037037 | 49.946 |
| 0.4787152777777777 | 49.942 |
| 0.4787268518518519 | 49.941 |
| 0.4787384259259259 | 49.941 |
| 0.47875 | 49.938 |
| 0.47876157407407405 | 49.933 |
| 0.47877314814814814 | 49.931 |
| 0.4787847222222222 | 49.933 |
| 0.47879629629629633 | 49.929 |
| 0.47880787037037037 | 49.926 |
| 0.47881944444444446 | 49.929 |
| 0.4788310185185185 | 49.931 |
| 0.4788425925925926 | 49.929 |
| 0.47885416666666664 | 49.925 |
| 0.4788657407407408 | 49.923 |
| 0.4788773148148148 | 49.919 |
| 0.4788888888888889 | 49.918 |
| 0.47890046296296296 | 49.919 |
| 0.47891203703703705 | 49.925 |
| 0.4789236111111111 | 49.931 |
| 0.47893518518518513 | 49.931 |
| 0.4789467592592593 | 49.933 |
| 0.4789583333333333 | 49.935 |
| 0.4789699074074074 | 49.939 |
| 0.47898148148148145 | 49.938 |
| 0.47899305555555555 | 49.939 |
| 0.4790046296296296 | 49.942 |
| 0.47901620370370374 | 49.943 |
| 0.4790277777777778 | 49.942 |
| 0.47903935185185187 | 49.944 |
| 0.4790509259259259 | 49.946 |
| 0.4790625 | 49.95 |
| 0.47907407407407404 | 49.95 |
| 0.4790856481481482 | 49.951 |
| 0.47909722222222223 | 49.948 |
| 0.4791087962962963 | 49.948 |
| 0.47912037037037036 | 49.944 |
| 0.47913194444444446 | 49.941 |
| 0.4791435185185185 | 49.941 |
| 0.47915509259259265 | 49.94 |
| 0.4791666666666667 | 49.939 |
| 0.4791782407407407 | 49.938 |
| 0.4791898148148148 | 49.939 |
| 0.47920138888888886 | 49.94 |
| 0.47921296296296295 | 49.941 |
| 0.479224537037037 | 49.944 |
| 0.47923611111111114 | 49.945 |
| 0.4792476851851852 | 49.944 |
| 0.4792592592592593 | 49.938 |
| 0.4792708333333333 | 49.935 |
| 0.4792824074074074 | 49.934 |
| 0.47929398148148145 | 49.93 |
| 0.4793055555555556 | 49.932 |
| 0.47931712962962963 | 49.934 |
| 0.47932870370370373 | 49.936 |
| 0.47934027777777777 | 49.938 |
| 0.47935185185185186 | 49.936 |
| 0.4793634259259259 | 49.933 |
| 0.47937500000000005 | 49.929 |
| 0.4793865740740741 | 49.926 |
| 0.4793981481481482 | 49.924 |
| 0.4794097222222222 | 49.926 |
| 0.47942129629629626 | 49.929 |
| 0.47943287037037036 | 49.93 |
| 0.4794444444444444 | 49.932 |
| 0.47945601851851855 | 49.938 |
| 0.4794675925925926 | 49.938 |
| 0.4794791666666667 | 49.936 |
| 0.4794907407407407 | 49.934 |
| 0.4795023148148148 | 49.93 |
| 0.47951388888888885 | 49.93 |
| 0.479525462962963 | 49.931 |
| 0.47953703703703704 | 49.932 |
| 0.47954861111111113 | 49.934 |
| 0.4795601851851852 | 49.934 |
| 0.47957175925925927 | 49.932 |
| 0.4795833333333333 | 49.93 |
| 0.47959490740740746 | 49.931 |
| 0.4796064814814815 | 49.935 |
| 0.4796180555555556 | 49.938 |
| 0.47962962962962963 | 49.941 |
| 0.47964120370370367 | 49.941 |
| 0.47965277777777776 | 49.942 |
| 0.4796643518518518 | 49.944 |
| 0.47967592592592595 | 49.945 |
| 0.4796875 | 49.95 |
| 0.4796990740740741 | 49.948 |
| 0.4797106481481481 | 49.943 |
| 0.4797222222222222 | 49.942 |
| 0.47973379629629626 | 49.946 |
| 0.4797453703703704 | 49.943 |
| 0.47975694444444444 | 49.941 |
| 0.47976851851851854 | 49.939 |
| 0.4797800925925926 | 49.935 |
| 0.47979166666666667 | 49.934 |
| 0.4798032407407407 | 49.932 |
| 0.47981481481481486 | 49.932 |
| 0.4798263888888889 | 49.933 |
| 0.479837962962963 | 49.938 |
| 0.47984953703703703 | 49.939 |
| 0.4798611111111111 | 49.938 |
| 0.47987268518518517 | 49.938 |
| 0.4798842592592593 | 49.936 |
| 0.47989583333333335 | 49.94 |
| 0.4799074074074074 | 49.941 |
| 0.4799189814814815 | 49.946 |
| 0.4799305555555555 | 49.948 |
| 0.4799421296296296 | 49.954 |
| 0.47995370370370366 | 49.954 |
| 0.4799652777777778 | 49.955 |
| 0.47997685185185185 | 49.953 |
| 0.47998842592592594 | 49.952 |
| 0.48 | 49.957 |
| 0.4800115740740741 | 49.953 |
| 0.4800231481481481 | 49.951 |
| 0.48003472222222227 | 49.954 |
| 0.4800462962962963 | 49.955 |
| 0.4800578703703704 | 49.954 |
| 0.48006944444444444 | 49.952 |
| 0.48008101851851853 | 49.948 |
| 0.48009259259259257 | 49.948 |
| 0.4801041666666667 | 49.945 |
| 0.48011574074074076 | 49.944 |
| 0.4801273148148148 | 49.95 |
| 0.4801388888888889 | 49.951 |
| 0.48015046296296293 | 49.954 |
| 0.480162037037037 | 49.955 |
| 0.48017361111111106 | 49.954 |
| 0.4801851851851852 | 49.951 |
| 0.48019675925925925 | 49.949 |
| 0.48020833333333335 | 49.948 |
| 0.4802199074074074 | 49.951 |
| 0.4802314814814815 | 49.948 |
| 0.4802430555555555 | 49.948 |
| 0.48025462962962967 | 49.951 |
| 0.4802662037037037 | 49.957 |
| 0.4802777777777778 | 49.955 |
| 0.48028935185185184 | 49.956 |
| 0.48030092592592594 | 49.955 |
| 0.4803125 | 49.959 |
| 0.4803240740740741 | 49.956 |
| 0.48033564814814816 | 49.956 |
| 0.4803472222222222 | 49.952 |
| 0.4803587962962963 | 49.947 |
| 0.48037037037037034 | 49.943 |
| 0.48038194444444443 | 49.944 |
| 0.48039351851851847 | 49.942 |
| 0.4804050925925926 | 49.947 |
| 0.48041666666666666 | 49.949 |
| 0.48042824074074075 | 49.945 |
| 0.4804398148148148 | 49.948 |
| 0.4804513888888889 | 49.95 |
| 0.4804629629629629 | 49.954 |
| 0.4804745370370371 | 49.958 |
| 0.4804861111111111 | 49.961 |
| 0.4804976851851852 | 49.965 |
| 0.48050925925925925 | 49.966 |
| 0.48052083333333334 | 49.967 |
| 0.4805324074074074 | 49.972 |
| 0.48054398148148153 | 49.971 |
| 0.48055555555555557 | 49.972 |
| 0.48056712962962966 | 49.971 |
| 0.4805787037037037 | 49.976 |
| 0.48059027777777774 | 49.98 |
| 0.48060185185185184 | 49.979 |
| 0.4806134259259259 | 49.977 |
| 0.480625 | 49.975 |
| 0.48063657407407406 | 49.973 |
| 0.48064814814814816 | 49.969 |
| 0.4806597222222222 | 49.966 |
| 0.4806712962962963 | 49.964 |
| 0.48068287037037033 | 49.956 |
| 0.4806944444444445 | 49.95 |
| 0.4807060185185185 | 49.95 |
| 0.4807175925925926 | 49.947 |
| 0.48072916666666665 | 49.944 |
| 0.48074074074074075 | 49.941 |
| 0.4807523148148148 | 49.941 |
| 0.48076388888888894 | 49.941 |
| 0.480775462962963 | 49.94 |
| 0.48078703703703707 | 49.94 |
| 0.4807986111111111 | 49.94 |
| 0.4808101851851852 | 49.941 |
| 0.48082175925925924 | 49.942 |
| 0.4808333333333333 | 49.943 |
| 0.48084490740740743 | 49.947 |
| 0.48085648148148147 | 49.949 |
| 0.48086805555555556 | 49.946 |
| 0.4808796296296296 | 49.946 |
| 0.4808912037037037 | 49.949 |
| 0.48090277777777773 | 49.952 |
| 0.4809143518518519 | 49.951 |
| 0.4809259259259259 | 49.946 |
| 0.4809375 | 49.946 |
| 0.48094907407407406 | 49.942 |
| 0.48096064814814815 | 49.943 |
| 0.4809722222222222 | 49.946 |
| 0.48098379629629634 | 49.948 |
| 0.4809953703703704 | 49.95 |
| 0.4810069444444445 | 49.954 |
| 0.4810185185185185 | 49.955 |
| 0.4810300925925926 | 49.954 |
| 0.48104166666666665 | 49.954 |
| 0.4810532407407408 | 49.955 |
| 0.48106481481481483 | 49.957 |
| 0.4810763888888889 | 49.956 |
| 0.48108796296296297 | 49.95 |
| 0.481099537037037 | 49.943 |
| 0.4811111111111111 | 49.938 |
| 0.48112268518518514 | 49.935 |
| 0.4811342592592593 | 49.936 |
| 0.48114583333333333 | 49.936 |
| 0.4811574074074074 | 49.936 |
| 0.48116898148148146 | 49.936 |
| 0.48118055555555556 | 49.935 |
| 0.4811921296296296 | 49.932 |
| 0.48120370370370374 | 49.929 |
| 0.4812152777777778 | 49.924 |
| 0.4812268518518519 | 49.921 |
| 0.4812384259259259 | 49.916 |
| 0.48125 | 49.916 |
| 0.48126157407407405 | 49.912 |
| 0.4812731481481482 | 49.912 |
| 0.48128472222222224 | 49.912 |
| 0.48129629629629633 | 49.909 |
| 0.48130787037037037 | 49.911 |
| 0.4813194444444444 | 49.916 |
| 0.4813310185185185 | 49.922 |
| 0.48134259259259254 | 49.921 |
| 0.4813541666666667 | 49.922 |
| 0.48136574074074073 | 49.925 |
| 0.4813773148148148 | 49.924 |
| 0.48138888888888887 | 49.929 |
| 0.48140046296296296 | 49.927 |
| 0.481412037037037 | 49.927 |
| 0.48142361111111115 | 49.925 |
| 0.4814351851851852 | 49.924 |
| 0.4814467592592593 | 49.921 |
| 0.4814583333333333 | 49.917 |
| 0.4814699074074074 | 49.917 |
| 0.48148148148148145 | 49.917 |
| 0.4814930555555556 | 49.915 |
| 0.48150462962962964 | 49.915 |
| 0.48151620370370374 | 49.919 |
| 0.4815277777777778 | 49.917 |
| 0.4815393518518518 | 49.915 |
| 0.4815509259259259 | 49.913 |
| 0.48156249999999995 | 49.913 |
| 0.4815740740740741 | 49.915 |
| 0.48158564814814814 | 49.916 |
| 0.48159722222222223 | 49.916 |
| 0.48160879629629627 | 49.916 |
| 0.48162037037037037 | 49.913 |
| 0.4816319444444444 | 49.91 |
| 0.48164351851851855 | 49.911 |
| 0.4816550925925926 | 49.914 |
| 0.4816666666666667 | 49.914 |
| 0.4816782407407407 | 49.914 |
| 0.4816898148148148 | 49.914 |
| 0.48170138888888886 | 49.915 |
| 0.481712962962963 | 49.914 |
| 0.48172453703703705 | 49.913 |
| 0.48173611111111114 | 49.915 |
| 0.4817476851851852 | 49.915 |
| 0.4817592592592593 | 49.917 |
| 0.4817708333333333 | 49.92 |
| 0.48178240740740735 | 49.919 |
| 0.4817939814814815 | 49.917 |
| 0.48180555555555554 | 49.914 |
| 0.48181712962962964 | 49.911 |
| 0.4818287037037037 | 49.908 |
| 0.48184027777777777 | 49.906 |
| 0.4818518518518518 | 49.904 |
| 0.48186342592592596 | 49.904 |
| 0.481875 | 49.904 |
| 0.4818865740740741 | 49.905 |
| 0.48189814814814813 | 49.904 |
| 0.4819097222222222 | 49.907 |
| 0.48192129629629626 | 49.908 |
| 0.4819328703703704 | 49.913 |
| 0.48194444444444445 | 49.914 |
| 0.48195601851851855 | 49.912 |
| 0.4819675925925926 | 49.911 |
| 0.4819791666666667 | 49.907 |
| 0.4819907407407407 | 49.9 |
| 0.48200231481481487 | 49.9 |
| 0.4820138888888889 | 49.902 |
| 0.48202546296296295 | 49.904 |
| 0.48203703703703704 | 49.902 |
| 0.4820486111111111 | 49.903 |
| 0.4820601851851852 | 49.9 |
| 0.4820717592592592 | 49.899 |
| 0.48208333333333336 | 49.895 |
| 0.4820949074074074 | 49.892 |
| 0.4821064814814815 | 49.889 |
| 0.48211805555555554 | 49.888 |
| 0.48212962962962963 | 49.889 |
| 0.48214120370370367 | 49.894 |
| 0.4821527777777778 | 49.898 |
| 0.48216435185185186 | 49.901 |
| 0.48217592592592595 | 49.906 |
| 0.4821875 | 49.909 |
| 0.4821990740740741 | 49.912 |
| 0.4822106481481481 | 49.913 |
| 0.4822222222222223 | 49.919 |
| 0.4822337962962963 | 49.921 |
| 0.48224537037037035 | 49.924 |
| 0.48225694444444445 | 49.924 |
| 0.4822685185185185 | 49.926 |
| 0.4822800925925926 | 49.937 |
| 0.4822916666666666 | 49.943 |
| 0.48230324074074077 | 49.949 |
| 0.4823148148148148 | 49.956 |
| 0.4823263888888889 | 49.969 |
| 0.48233796296296294 | 49.979 |
| 0.48234953703703703 | 49.989 |
| 0.4823611111111111 | 49.994 |
| 0.4823726851851852 | 50 |
| 0.48238425925925926 | 50.004 |
| 0.48239583333333336 | 50.008 |
| 0.4824074074074074 | 50.011 |
| 0.4824189814814815 | 50.016 |
| 0.48243055555555553 | 50.021 |
| 0.4824421296296297 | 50.019 |
| 0.4824537037037037 | 50.018 |
| 0.4824652777777778 | 50.022 |
| 0.48247685185185185 | 50.022 |
| 0.4824884259259259 | 50.018 |
| 0.4825 | 50.018 |
| 0.482511574074074 | 50.021 |
| 0.4825231481481482 | 50.018 |
| 0.4825347222222222 | 50.021 |
| 0.4825462962962963 | 50.022 |
| 0.48255787037037035 | 50.03 |
| 0.48256944444444444 | 50.031 |
| 0.4825810185185185 | 50.033 |
| 0.48259259259259263 | 50.033 |
| 0.48260416666666667 | 50.03 |
| 0.48261574074074076 | 50.028 |
| 0.4826273148148148 | 50.028 |
| 0.4826388888888889 | 50.025 |
| 0.48265046296296293 | 50.023 |
| 0.4826620370370371 | 50.02 |
| 0.4826736111111111 | 50.022 |
| 0.4826851851851852 | 50.026 |
| 0.48269675925925926 | 50.026 |
| 0.48270833333333335 | 50.027 |
| 0.4827199074074074 | 50.027 |
| 0.48273148148148143 | 50.022 |
| 0.4827430555555556 | 50.017 |
| 0.4827546296296296 | 50.015 |
| 0.4827662037037037 | 50.015 |
| 0.48277777777777775 | 50.014 |
| 0.48278935185185184 | 50.015 |
| 0.4828009259259259 | 50.015 |
| 0.48281250000000003 | 50.019 |
| 0.48282407407407407 | 50.019 |
| 0.48283564814814817 | 50.022 |
| 0.4828472222222222 | 50.016 |
| 0.4828587962962963 | 50.017 |
| 0.48287037037037034 | 50.016 |
| 0.4828819444444445 | 50.018 |
| 0.4828935185185185 | 50.016 |
| 0.4829050925925926 | 50.015 |
| 0.48291666666666666 | 50.016 |
| 0.48292824074074076 | 50.01 |
| 0.4829398148148148 | 50.01 |
| 0.48295138888888894 | 50.012 |
| 0.482962962962963 | 50.013 |
| 0.482974537037037 | 50.016 |
| 0.4829861111111111 | 50.016 |
| 0.48299768518518515 | 50.022 |
| 0.48300925925925925 | 50.022 |
| 0.4830208333333333 | 50.02 |
| 0.48303240740740744 | 50.013 |
| 0.4830439814814815 | 50.011 |
| 0.48305555555555557 | 50.007 |
| 0.4830671296296296 | 49.999 |
| 0.4830787037037037 | 49.999 |
| 0.48309027777777774 | 49.999 |
| 0.4831018518518519 | 50.001 |
| 0.48311342592592593 | 50.001 |
| 0.483125 | 50.006 |
| 0.48313657407407407 | 50.008 |
| 0.48314814814814816 | 50.01 |
| 0.4831597222222222 | 50.015 |
| 0.48317129629629635 | 50.014 |
| 0.4831828703703704 | 50.014 |
| 0.4831944444444444 | 50.013 |
| 0.4832060185185185 | 50.008 |
| 0.48321759259259256 | 50.004 |
| 0.48322916666666665 | 50.003 |
| 0.4832407407407407 | 49.998 |
| 0.48325231481481484 | 49.992 |
| 0.4832638888888889 | 49.988 |
| 0.483275462962963 | 49.985 |
| 0.483287037037037 | 49.978 |
| 0.4832986111111111 | 49.976 |
| 0.48331018518518515 | 49.978 |
| 0.4833217592592593 | 49.975 |
| 0.48333333333333334 | 49.973 |
| 0.48334490740740743 | 49.969 |
| 0.48335648148148147 | 49.974 |
| 0.48336805555555556 | 49.978 |
| 0.4833796296296296 | 49.979 |
| 0.48339120370370375 | 49.98 |
| 0.4834027777777778 | 49.983 |
| 0.4834143518518519 | 49.981 |
| 0.4834259259259259 | 49.977 |
| 0.48343749999999996 | 49.975 |
| 0.48344907407407406 | 49.977 |
| 0.4834606481481481 | 49.973 |
| 0.48347222222222225 | 49.975 |
| 0.4834837962962963 | 49.976 |
| 0.4834953703703704 | 49.981 |
| 0.4835069444444444 | 49.983 |
| 0.4835185185185185 | 49.98 |
| 0.48353009259259255 | 49.978 |
| 0.4835416666666667 | 49.977 |
| 0.48355324074074074 | 49.974 |
| 0.48356481481481484 | 49.971 |
| 0.4835763888888889 | 49.973 |
| 0.48358796296296297 | 49.975 |
| 0.483599537037037 | 49.975 |
| 0.48361111111111116 | 49.974 |
| 0.4836226851851852 | 49.976 |
| 0.4836342592592593 | 49.976 |
| 0.48364583333333333 | 49.973 |
| 0.4836574074074074 | 49.971 |
| 0.48366898148148146 | 49.971 |
| 0.4836805555555555 | 49.968 |
| 0.48369212962962965 | 49.968 |
| 0.4837037037037037 | 49.968 |
| 0.4837152777777778 | 49.967 |
| 0.4837268518518518 | 49.968 |
| 0.4837384259259259 | 49.974 |
| 0.48374999999999996 | 49.974 |
| 0.4837615740740741 | 49.974 |
| 0.48377314814814815 | 49.968 |
| 0.48378472222222224 | 49.967 |
| 0.4837962962962963 | 49.966 |
| 0.4838078703703704 | 49.968 |
| 0.4838194444444444 | 49.97 |
| 0.48383101851851856 | 49.971 |
| 0.4838425925925926 | 49.971 |
| 0.4838541666666667 | 49.971 |
| 0.48386574074074074 | 49.971 |
| 0.48387731481481483 | 49.969 |
| 0.48388888888888887 | 49.971 |
| 0.483900462962963 | 49.972 |
| 0.48391203703703706 | 49.974 |
| 0.4839236111111111 | 49.973 |
| 0.4839351851851852 | 49.973 |
| 0.48394675925925923 | 49.973 |
| 0.4839583333333333 | 49.974 |
| 0.48396990740740736 | 49.968 |
| 0.4839814814814815 | 49.966 |
| 0.48399305555555555 | 49.966 |
| 0.48400462962962965 | 49.974 |
| 0.4840162037037037 | 49.984 |
| 0.4840277777777778 | 49.994 |
| 0.4840393518518518 | 49.994 |
| 0.48405092592592597 | 49.993 |
| 0.4840625 | 49.989 |
| 0.4840740740740741 | 49.982 |
| 0.48408564814814814 | 49.98 |
| 0.48409722222222223 | 49.98 |
| 0.4841087962962963 | 49.982 |
| 0.4841203703703704 | 49.983 |
| 0.48413194444444446 | 49.984 |
| 0.4841435185185185 | 49.985 |
| 0.4841550925925926 | 49.986 |
| 0.48416666666666663 | 49.988 |
| 0.48417824074074073 | 49.987 |
| 0.48418981481481477 | 49.984 |
| 0.4842013888888889 | 49.985 |
| 0.48421296296296296 | 49.985 |
| 0.48422453703703705 | 49.986 |
| 0.4842361111111111 | 49.984 |
| 0.4842476851851852 | 49.984 |
| 0.4842592592592592 | 49.982 |
| 0.4842708333333334 | 49.979 |
| 0.4842824074074074 | 49.982 |
| 0.4842939814814815 | 49.985 |
| 0.48430555555555554 | 49.986 |
| 0.48431712962962964 | 49.987 |
| 0.4843287037037037 | 49.989 |
| 0.48434027777777783 | 49.991 |
| 0.48435185185185187 | 49.995 |
| 0.48436342592592596 | 49.999 |
| 0.484375 | 50.002 |
| 0.48438657407407404 | 50.007 |
| 0.48439814814814813 | 50.007 |
| 0.48440972222222217 | 50.005 |
| 0.4844212962962963 | 50.002 |
| 0.48443287037037036 | 50.004 |
| 0.48444444444444446 | 50.005 |
| 0.4844560185185185 | 49.999 |
| 0.4844675925925926 | 50.003 |
| 0.4844791666666666 | 50.004 |
| 0.4844907407407408 | 50.011 |
| 0.4845023148148148 | 50.015 |
| 0.4845138888888889 | 50.02 |
| 0.48452546296296295 | 50.024 |
| 0.48453703703703704 | 50.024 |
| 0.4845486111111111 | 50.029 |
| 0.48456018518518523 | 50.026 |
| 0.48457175925925927 | 50.022 |
| 0.48458333333333337 | 50.02 |
| 0.4845949074074074 | 50.013 |
| 0.4846064814814815 | 50.009 |
| 0.48461805555555554 | 50.008 |
| 0.4846296296296296 | 50.006 |
| 0.4846412037037037 | 50.003 |
| 0.48465277777777777 | 50.012 |
| 0.48466435185185186 | 50.015 |
| 0.4846759259259259 | 50.023 |
| 0.4846875 | 50.028 |
| 0.48469907407407403 | 50.032 |
| 0.4847106481481482 | 50.033 |
| 0.4847222222222222 | 50.026 |
| 0.4847337962962963 | 50.025 |
| 0.48474537037037035 | 50.023 |
| 0.48475694444444445 | 50.021 |
| 0.4847685185185185 | 50.016 |
| 0.48478009259259264 | 50.015 |
| 0.4847916666666667 | 50.002 |
| 0.48480324074074077 | 50.001 |
| 0.4848148148148148 | 49.993 |
| 0.4848263888888889 | 49.99 |
| 0.48483796296296294 | 49.986 |
| 0.484849537037037 | 49.986 |
| 0.48486111111111113 | 49.987 |
| 0.48487268518518517 | 49.989 |
| 0.48488425925925926 | 49.992 |
| 0.4848958333333333 | 49.995 |
| 0.4849074074074074 | 49.993 |
| 0.48491898148148144 | 49.993 |
| 0.4849305555555556 | 49.994 |
| 0.4849421296296296 | 49.997 |
| 0.4849537037037037 | 49.998 |
| 0.48496527777777776 | 50.002 |
| 0.48497685185185185 | 50.006 |
| 0.4849884259259259 | 50.003 |
| 0.48500000000000004 | 50 |
| 0.4850115740740741 | 50 |
| 0.4850231481481482 | 50.004 |
| 0.4850347222222222 | 50.003 |
| 0.4850462962962963 | 50.001 |
| 0.48505787037037035 | 50.006 |
| 0.4850694444444445 | 50.014 |
| 0.48508101851851854 | 50.019 |
| 0.4850925925925926 | 50.021 |
| 0.48510416666666667 | 50.022 |
| 0.4851157407407407 | 50.024 |
| 0.4851273148148148 | 50.021 |
| 0.48513888888888884 | 50.019 |
| 0.485150462962963 | 50.015 |
| 0.48516203703703703 | 50.016 |
| 0.4851736111111111 | 50.017 |
| 0.48518518518518516 | 50.021 |
| 0.48519675925925926 | 50.026 |
| 0.4852083333333333 | 50.025 |
| 0.48521990740740745 | 50.028 |
| 0.4852314814814815 | 50.028 |
| 0.4852430555555556 | 50.026 |
| 0.4852546296296296 | 50.022 |
| 0.4852662037037037 | 50.019 |
| 0.48527777777777775 | 50.019 |
| 0.4852893518518519 | 50.02 |
| 0.48530092592592594 | 50.02 |
| 0.48531250000000004 | 50.02 |
| 0.4853240740740741 | 50.017 |
| 0.4853356481481481 | 50.018 |
| 0.4853472222222222 | 50.018 |
| 0.48535879629629625 | 50.016 |
| 0.4853703703703704 | 50.018 |
| 0.48538194444444444 | 50.017 |
| 0.48539351851851853 | 50.015 |
| 0.48540509259259257 | 50.012 |
| 0.48541666666666666 | 50.012 |
| 0.4854282407407407 | 50.014 |
| 0.48543981481481485 | 50.014 |
| 0.4854513888888889 | 50.014 |
| 0.485462962962963 | 50.016 |
| 0.485474537037037 | 50.016 |
| 0.4854861111111111 | 50.014 |
| 0.48549768518518516 | 50.015 |
| 0.4855092592592593 | 50.018 |
| 0.48552083333333335 | 50.017 |
| 0.48553240740740744 | 50.014 |
| 0.4855439814814815 | 50.017 |
| 0.4855555555555556 | 50.017 |
| 0.4855671296296296 | 50.018 |
| 0.48557870370370365 | 50.019 |
| 0.4855902777777778 | 50.017 |
| 0.48560185185185184 | 50.015 |
| 0.48561342592592593 | 50.016 |
| 0.485625 | 50.014 |
| 0.48563657407407407 | 50.01 |
| 0.4856481481481481 | 50.01 |
| 0.48565972222222226 | 50.01 |
| 0.4856712962962963 | 50.005 |
| 0.4856828703703704 | 50.003 |
| 0.48569444444444443 | 50.002 |
| 0.4857060185185185 | 50 |
| 0.48571759259259256 | 49.995 |
| 0.4857291666666667 | 49.993 |
| 0.48574074074074075 | 49.991 |
| 0.48575231481481485 | 49.988 |
| 0.4857638888888889 | 49.984 |
| 0.485775462962963 | 49.98 |
| 0.485787037037037 | 49.983 |
| 0.48579861111111106 | 49.98 |
| 0.4858101851851852 | 49.982 |
| 0.48582175925925924 | 49.98 |
| 0.48583333333333334 | 49.985 |
| 0.4858449074074074 | 49.985 |
| 0.4858564814814815 | 49.988 |
| 0.4858680555555555 | 49.988 |
| 0.48587962962962966 | 49.993 |
| 0.4858912037037037 | 49.996 |
| 0.4859027777777778 | 49.999 |
| 0.48591435185185183 | 49.998 |
| 0.48592592592592593 | 50 |
| 0.48593749999999997 | 50.002 |
| 0.4859490740740741 | 50.013 |
| 0.48596064814814816 | 50.017 |
| 0.48597222222222225 | 50.022 |
| 0.4859837962962963 | 50.022 |
| 0.4859953703703704 | 50.024 |
| 0.4860069444444444 | 50.025 |
| 0.48601851851851857 | 50.023 |
| 0.4860300925925926 | 50.024 |
| 0.48604166666666665 | 50.024 |
| 0.48605324074074074 | 50.02 |
| 0.4860648148148148 | 50.019 |
| 0.4860763888888889 | 50.018 |
| 0.4860879629629629 | 50.022 |
| 0.48609953703703707 | 50.021 |
| 0.4861111111111111 | 50.017 |
| 0.4861226851851852 | 50.01 |
| 0.48613425925925924 | 50.008 |
| 0.48614583333333333 | 50.008 |
| 0.48615740740740737 | 50.013 |
| 0.4861689814814815 | 50.016 |
| 0.48618055555555556 | 50.021 |
| 0.48619212962962965 | 50.026 |
| 0.4862037037037037 | 50.025 |
| 0.4862152777777778 | 50.027 |
| 0.4862268518518518 | 50.022 |
| 0.486238425925926 | 50.02 |
| 0.48625 | 50.015 |
| 0.4862615740740741 | 50.014 |
| 0.48627314814814815 | 50.012 |
| 0.4862847222222222 | 50.014 |
| 0.4862962962962963 | 50.018 |
| 0.4863078703703703 | 50.022 |
| 0.48631944444444447 | 50.026 |
| 0.4863310185185185 | 50.026 |
| 0.4863425925925926 | 50.028 |
| 0.48635416666666664 | 50.018 |
| 0.48636574074074074 | 50.022 |
| 0.4863773148148148 | 50.018 |
| 0.4863888888888889 | 50.021 |
| 0.48640046296296297 | 50.021 |
| 0.48641203703703706 | 50.024 |
| 0.4864236111111111 | 50.025 |
| 0.4864351851851852 | 50.024 |
| 0.48644675925925923 | 50.026 |
| 0.4864583333333334 | 50.023 |
| 0.4864699074074074 | 50.021 |
| 0.4864814814814815 | 50.019 |
| 0.48649305555555555 | 50.02 |
| 0.48650462962962965 | 50.023 |
| 0.4865162037037037 | 50.024 |
| 0.4865277777777777 | 50.029 |
| 0.4865393518518519 | 50.032 |
| 0.4865509259259259 | 50.037 |
| 0.4865625 | 50.037 |
| 0.48657407407407405 | 50.039 |
| 0.48658564814814814 | 50.036 |
| 0.4865972222222222 | 50.03 |
| 0.48660879629629633 | 50.026 |
| 0.48662037037037037 | 50.016 |
| 0.48663194444444446 | 50.015 |
| 0.4866435185185185 | 50.012 |
| 0.4866550925925926 | 50.012 |
| 0.48666666666666664 | 50.013 |
| 0.4866782407407408 | 50.016 |
| 0.4866898148148148 | 50.014 |
| 0.4867013888888889 | 50.01 |
| 0.48671296296296296 | 50.011 |
| 0.48672453703703705 | 50.012 |
| 0.4867361111111111 | 50.014 |
| 0.48674768518518513 | 50.015 |
| 0.4867592592592593 | 50.016 |
| 0.4867708333333333 | 50.015 |
| 0.4867824074074074 | 50.017 |
| 0.48679398148148145 | 50.018 |
| 0.48680555555555555 | 50.022 |
| 0.4868171296296296 | 50.026 |
| 0.48682870370370374 | 50.03 |
| 0.4868402777777778 | 50.028 |
| 0.48685185185185187 | 50.025 |
| 0.4868634259259259 | 50.023 |
| 0.486875 | 50.021 |
| 0.48688657407407404 | 50.022 |
| 0.4868981481481482 | 50.019 |
| 0.48690972222222223 | 50.018 |
| 0.4869212962962963 | 50.014 |
| 0.48693287037037036 | 50.015 |
| 0.48694444444444446 | 50.019 |
| 0.4869560185185185 | 50.022 |
| 0.48696759259259265 | 50.02 |
| 0.4869791666666667 | 50.023 |
| 0.4869907407407407 | 50.028 |
| 0.4870023148148148 | 50.029 |
| 0.48701388888888886 | 50.027 |
| 0.48702546296296295 | 50.029 |
| 0.487037037037037 | 50.027 |
| 0.48704861111111114 | 50.029 |
| 0.4870601851851852 | 50.03 |
| 0.4870717592592593 | 50.032 |
| 0.4870833333333333 | 50.039 |
| 0.4870949074074074 | 50.037 |
| 0.48710648148148145 | 50.041 |
| 0.4871180555555556 | 50.043 |
| 0.48712962962962963 | 50.051 |
| 0.48714120370370373 | 50.054 |
| 0.48715277777777777 | 50.05 |
| 0.48716435185185186 | 50.049 |
| 0.4871759259259259 | 50.049 |
| 0.48718750000000005 | 50.052 |
| 0.4871990740740741 | 50.049 |
| 0.4872106481481482 | 50.056 |
| 0.4872222222222222 | 50.058 |
| 0.48723379629629626 | 50.058 |
| 0.48724537037037036 | 50.05 |
| 0.4872569444444444 | 50.054 |
| 0.48726851851851855 | 50.053 |
| 0.4872800925925926 | 50.055 |
| 0.4872916666666667 | 50.054 |
| 0.4873032407407407 | 50.057 |
| 0.4873148148148148 | 50.053 |
| 0.48732638888888885 | 50.05 |
| 0.487337962962963 | 50.046 |
| 0.48734953703703704 | 50.044 |
| 0.48736111111111113 | 50.043 |
| 0.4873726851851852 | 50.039 |
| 0.48738425925925927 | 50.032 |
| 0.4873958333333333 | 50.031 |
| 0.48740740740740746 | 50.028 |
| 0.4874189814814815 | 50.023 |
| 0.4874305555555556 | 50.027 |
| 0.48744212962962963 | 50.028 |
| 0.48745370370370367 | 50.027 |
| 0.48746527777777776 | 50.028 |
| 0.4874768518518518 | 50.028 |
| 0.48748842592592595 | 50.029 |
| 0.4875 | 50.026 |
| 0.4875115740740741 | 50.025 |
| 0.4875231481481481 | 50.029 |
| 0.4875347222222222 | 50.031 |
| 0.48754629629629626 | 50.029 |
| 0.4875578703703704 | 50.028 |
| 0.48756944444444444 | 50.027 |
| 0.48758101851851854 | 50.027 |
| 0.4875925925925926 | 50.025 |
| 0.48760416666666667 | 50.021 |
| 0.4876157407407407 | 50.015 |
| 0.48762731481481486 | 50.013 |
| 0.4876388888888889 | 50.01 |
| 0.487650462962963 | 50.007 |
| 0.48766203703703703 | 50.01 |
| 0.4876736111111111 | 50.016 |
| 0.48768518518518517 | 50.015 |
| 0.4876967592592592 | 50.015 |
| 0.48770833333333335 | 50.014 |
| 0.4877199074074074 | 50.014 |
| 0.4877314814814815 | 50.013 |
| 0.4877430555555555 | 50.009 |
| 0.4877546296296296 | 50.005 |
| 0.48776620370370366 | 50.005 |
| 0.4877777777777778 | 49.998 |
| 0.48778935185185185 | 49.996 |
| 0.48780092592592594 | 49.989 |
| 0.4878125 | 49.988 |
| 0.4878240740740741 | 49.988 |
| 0.4878356481481481 | 49.991 |
| 0.48784722222222227 | 49.998 |
| 0.4878587962962963 | 50.005 |
| 0.4878703703703704 | 50.012 |
| 0.48788194444444444 | 50.019 |
| 0.48789351851851853 | 50.023 |
| 0.48790509259259257 | 50.024 |
| 0.4879166666666667 | 50.025 |
| 0.48792824074074076 | 50.028 |
| 0.4879398148148148 | 50.025 |
| 0.4879513888888889 | 50.021 |
| 0.48796296296296293 | 50.02 |
| 0.487974537037037 | 50.024 |
| 0.48798611111111106 | 50.03 |
| 0.4879976851851852 | 50.029 |
| 0.48800925925925925 | 50.028 |
| 0.48802083333333335 | 50.029 |
| 0.4880324074074074 | 50.028 |
| 0.4880439814814815 | 50.027 |
| 0.4880555555555555 | 50.028 |
| 0.48806712962962967 | 50.036 |
| 0.4880787037037037 | 50.041 |
| 0.4880902777777778 | 50.047 |
| 0.48810185185185184 | 50.047 |
| 0.48811342592592594 | 50.05 |
| 0.488125 | 50.048 |
| 0.4881365740740741 | 50.048 |
| 0.48814814814814816 | 50.042 |
| 0.48815972222222226 | 50.043 |
| 0.4881712962962963 | 50.04 |
| 0.48818287037037034 | 50.038 |
| 0.48819444444444443 | 50.042 |
| 0.48820601851851847 | 50.043 |
| 0.4882175925925926 | 50.041 |
| 0.48822916666666666 | 50.046 |
| 0.48824074074074075 | 50.051 |
| 0.4882523148148148 | 50.044 |
| 0.4882638888888889 | 50.044 |
| 0.4882754629629629 | 50.041 |
| 0.4882870370370371 | 50.037 |
| 0.4882986111111111 | 50.041 |
| 0.4883101851851852 | 50.039 |
| 0.48832175925925925 | 50.039 |
| 0.48833333333333334 | 50.038 |
| 0.4883449074074074 | 50.041 |
| 0.48835648148148153 | 50.041 |
| 0.48836805555555557 | 50.039 |
| 0.48837962962962966 | 50.034 |
| 0.4883912037037037 | 50.031 |
| 0.48840277777777774 | 50.027 |
| 0.48841435185185184 | 50.027 |
| 0.4884259259259259 | 50.033 |
| 0.4884375 | 50.028 |
| 0.48844907407407406 | 50.025 |
| 0.48846064814814816 | 50.025 |
| 0.4884722222222222 | 50.019 |
| 0.4884837962962963 | 50.017 |
| 0.48849537037037033 | 50.018 |
| 0.4885069444444445 | 50.02 |
| 0.4885185185185185 | 50.024 |
| 0.4885300925925926 | 50.026 |
| 0.48854166666666665 | 50.023 |
| 0.48855324074074075 | 50.024 |
| 0.4885648148148148 | 50.026 |
| 0.48857638888888894 | 50.028 |
| 0.488587962962963 | 50.028 |
| 0.48859953703703707 | 50.024 |
| 0.4886111111111111 | 50.027 |
| 0.4886226851851852 | 50.028 |
| 0.48863425925925924 | 50.028 |
| 0.4886458333333333 | 50.026 |
| 0.48865740740740743 | 50.028 |
| 0.48866898148148147 | 50.027 |
| 0.48868055555555556 | 50.024 |
| 0.4886921296296296 | 50.02 |
| 0.4887037037037037 | 50.02 |
| 0.48871527777777773 | 50.019 |
| 0.4887268518518519 | 50.015 |
| 0.4887384259259259 | 50.015 |
| 0.48875 | 50.019 |
| 0.48876157407407406 | 50.018 |
| 0.48877314814814815 | 50.023 |
| 0.4887847222222222 | 50.026 |
| 0.48879629629629634 | 50.027 |
| 0.4888078703703704 | 50.027 |
| 0.4888194444444445 | 50.03 |
| 0.4888310185185185 | 50.031 |
| 0.4888425925925926 | 50.034 |
| 0.48885416666666665 | 50.032 |
| 0.4888657407407408 | 50.031 |
| 0.48887731481481483 | 50.026 |
| 0.4888888888888889 | 50.017 |
| 0.48890046296296297 | 50.007 |
| 0.488912037037037 | 50.004 |
| 0.4889236111111111 | 50.004 |
| 0.48893518518518514 | 50.01 |
| 0.4889467592592593 | 50.015 |
| 0.48895833333333333 | 50.022 |
| 0.4889699074074074 | 50.025 |
| 0.48898148148148146 | 50.025 |
| 0.48899305555555556 | 50.023 |
| 0.4890046296296296 | 50.027 |
| 0.48901620370370374 | 50.027 |
| 0.4890277777777778 | 50.026 |
| 0.4890393518518519 | 50.019 |
| 0.4890509259259259 | 50.013 |
| 0.4890625 | 50.008 |
| 0.48907407407407405 | 50.01 |
| 0.4890856481481482 | 50.013 |
| 0.48909722222222224 | 50.017 |
| 0.48910879629629633 | 50.026 |
| 0.48912037037037037 | 50.019 |
| 0.4891319444444444 | 50.023 |
| 0.4891435185185185 | 50.025 |
| 0.48915509259259254 | 50.021 |
| 0.4891666666666667 | 50.017 |
| 0.48917824074074073 | 50.013 |
| 0.4891898148148148 | 50.011 |
| 0.48920138888888887 | 50.004 |
| 0.48921296296296296 | 50.004 |
| 0.489224537037037 | 50.001 |
| 0.48923611111111115 | 50.001 |
| 0.4892476851851852 | 49.998 |
| 0.4892592592592593 | 49.998 |
| 0.4892708333333333 | 50.001 |
| 0.4892824074074074 | 50.007 |
| 0.48929398148148145 | 50.015 |
| 0.4893055555555556 | 50.023 |
| 0.48931712962962964 | 50.028 |
| 0.48932870370370374 | 50.032 |
| 0.4893402777777778 | 50.027 |
| 0.4893518518518518 | 50.027 |
| 0.4893634259259259 | 50.026 |
| 0.48937499999999995 | 50.027 |
| 0.4893865740740741 | 50.03 |
| 0.48939814814814814 | 50.028 |
| 0.48940972222222223 | 50.032 |
| 0.48942129629629627 | 50.032 |
| 0.48943287037037037 | 50.034 |
| 0.4894444444444444 | 50.029 |
| 0.48945601851851855 | 50.035 |
| 0.4894675925925926 | 50.034 |
| 0.4894791666666667 | 50.032 |
| 0.4894907407407407 | 50.032 |
| 0.4895023148148148 | 50.037 |
| 0.48951388888888886 | 50.034 |
| 0.489525462962963 | 50.031 |
| 0.48953703703703705 | 50.03 |
| 0.48954861111111114 | 50.027 |
| 0.4895601851851852 | 50.029 |
| 0.4895717592592593 | 50.022 |
| 0.4895833333333333 | 50.019 |
| 0.48959490740740735 | 50.017 |
| 0.4896064814814815 | 50.008 |
| 0.48961805555555554 | 50.006 |
| 0.48962962962962964 | 50.009 |
| 0.4896412037037037 | 50.011 |
| 0.48965277777777777 | 50.012 |
| 0.4896643518518518 | 50.021 |
| 0.48967592592592596 | 50.025 |
| 0.4896875 | 50.024 |
| 0.4896990740740741 | 50.022 |
| 0.48971064814814813 | 50.019 |
| 0.4897222222222222 | 50.017 |
| 0.48973379629629626 | 50.014 |
| 0.4897453703703704 | 50.012 |
| 0.48975694444444445 | 50.011 |
| 0.48976851851851855 | 50.005 |
| 0.4897800925925926 | 50.002 |
| 0.4897916666666667 | 49.997 |
| 0.4898032407407407 | 49.996 |
| 0.48981481481481487 | 49.996 |
| 0.4898263888888889 | 49.994 |
| 0.48983796296296295 | 49.994 |
| 0.48984953703703704 | 49.992 |
| 0.4898611111111111 | 49.995 |
| 0.4898726851851852 | 49.998 |
| 0.4898842592592592 | 50.002 |
| 0.48989583333333336 | 50.01 |
| 0.4899074074074074 | 50.021 |
| 0.4899189814814815 | 50.025 |
| 0.48993055555555554 | 50.027 |
| 0.48994212962962963 | 50.028 |
| 0.48995370370370367 | 50.033 |
| 0.4899652777777778 | 50.035 |
| 0.48997685185185186 | 50.038 |
| 0.48998842592592595 | 50.034 |
| 0.49 | 50.035 |
| 0.4900115740740741 | 50.029 |
| 0.4900231481481481 | 50.026 |
| 0.4900347222222223 | 50.026 |
| 0.4900462962962963 | 50.031 |
| 0.49005787037037035 | 50.029 |
| 0.49006944444444445 | 50.028 |
| 0.4900810185185185 | 50.023 |
| 0.4900925925925926 | 50.018 |
| 0.4901041666666666 | 50.017 |
| 0.49011574074074077 | 50.014 |
| 0.4901273148148148 | 50.02 |
| 0.4901388888888889 | 50.015 |
| 0.49015046296296294 | 50.019 |
| 0.49016203703703703 | 50.014 |
| 0.4901736111111111 | 50.018 |
| 0.4901851851851852 | 50.015 |
| 0.49019675925925926 | 50.011 |
| 0.49020833333333336 | 50.014 |
| 0.4902199074074074 | 50.011 |
| 0.4902314814814815 | 50.012 |
| 0.49024305555555553 | 50.019 |
| 0.4902546296296297 | 50.016 |
| 0.4902662037037037 | 50.019 |
| 0.4902777777777778 | 50.02 |
| 0.49028935185185185 | 50.011 |
| 0.4903009259259259 | 50.01 |
| 0.4903125 | 50.02 |
| 0.490324074074074 | 50.02 |
| 0.4903356481481482 | 50.018 |
| 0.4903472222222222 | 50.008 |
| 0.4903587962962963 | 50.008 |
| 0.49037037037037035 | 50.005 |
| 0.49038194444444444 | 50.005 |
| 0.4903935185185185 | 50.008 |
| 0.49040509259259263 | 50.01 |
| 0.49041666666666667 | 50.007 |
| 0.49042824074074076 | 50.003 |
| 0.4904398148148148 | 50 |
| 0.4904513888888889 | 49.995 |
| 0.49046296296296293 | 49.992 |
| 0.4904745370370371 | 49.994 |
| 0.4904861111111111 | 49.993 |
| 0.4904976851851852 | 50 |
| 0.49050925925925926 | 50.006 |
| 0.49052083333333335 | 50.007 |
| 0.4905324074074074 | 50.007 |
| 0.49054398148148143 | 50.007 |
| 0.4905555555555556 | 50.005 |
| 0.4905671296296296 | 50.002 |
| 0.4905787037037037 | 50.001 |
| 0.49059027777777775 | 49.998 |
| 0.49060185185185184 | 49.991 |
| 0.4906134259259259 | 49.993 |
| 0.49062500000000003 | 49.991 |
| 0.49063657407407407 | 49.988 |
| 0.49064814814814817 | 49.992 |
| 0.4906597222222222 | 49.995 |
| 0.4906712962962963 | 50.003 |
| 0.49068287037037034 | 50.014 |
| 0.4906944444444445 | 50.019 |
| 0.4907060185185185 | 50.028 |
| 0.4907175925925926 | 50.037 |
| 0.49072916666666666 | 50.038 |
| 0.49074074074074076 | 50.038 |
| 0.4907523148148148 | 50.038 |
| 0.49076388888888894 | 50.036 |
| 0.490775462962963 | 50.039 |
| 0.490787037037037 | 50.037 |
| 0.4907986111111111 | 50.036 |
| 0.49081018518518515 | 50.03 |
| 0.49082175925925925 | 50.027 |
| 0.4908333333333333 | 50.024 |
| 0.49084490740740744 | 50.031 |
| 0.4908564814814815 | 50.03 |
| 0.49086805555555557 | 50.029 |
| 0.4908796296296296 | 50.029 |
| 0.4908912037037037 | 50.027 |
| 0.49090277777777774 | 50.025 |
| 0.4909143518518519 | 50.023 |
| 0.49092592592592593 | 50.024 |
| 0.4909375 | 50.029 |
| 0.49094907407407407 | 50.031 |
| 0.49096064814814816 | 50.025 |
| 0.4909722222222222 | 50.029 |
| 0.49098379629629635 | 50.027 |
| 0.4909953703703704 | 50.025 |
| 0.4910069444444444 | 50.021 |
| 0.4910185185185185 | 50.019 |
| 0.49103009259259256 | 50.017 |
| 0.49104166666666665 | 50.019 |
| 0.4910532407407407 | 50.02 |
| 0.49106481481481484 | 50.018 |
| 0.4910763888888889 | 50.02 |
| 0.491087962962963 | 50.018 |
| 0.491099537037037 | 50.018 |
| 0.4911111111111111 | 50.022 |
| 0.49112268518518515 | 50.021 |
| 0.4911342592592593 | 50.016 |
| 0.49114583333333334 | 50.014 |
| 0.49115740740740743 | 50.014 |
| 0.49116898148148147 | 50.017 |
| 0.49118055555555556 | 50.017 |
| 0.4911921296296296 | 50.018 |
| 0.49120370370370375 | 50.019 |
| 0.4912152777777778 | 50.024 |
| 0.4912268518518519 | 50.025 |
| 0.4912384259259259 | 50.028 |
| 0.49124999999999996 | 50.028 |
| 0.49126157407407406 | 50.03 |
| 0.4912731481481481 | 50.03 |
| 0.49128472222222225 | 50.031 |
| 0.4912962962962963 | 50.035 |
| 0.4913078703703704 | 50.032 |
| 0.4913194444444444 | 50.031 |
| 0.4913310185185185 | 50.031 |
| 0.49134259259259255 | 50.029 |
| 0.4913541666666667 | 50.028 |
| 0.49136574074074074 | 50.029 |
| 0.49137731481481484 | 50.029 |
| 0.4913888888888889 | 50.031 |
| 0.49140046296296297 | 50.033 |
| 0.491412037037037 | 50.029 |
| 0.49142361111111116 | 50.025 |
| 0.4914351851851852 | 50.026 |
| 0.4914467592592593 | 50.025 |
| 0.49145833333333333 | 50.031 |
| 0.4914699074074074 | 50.04 |
| 0.49148148148148146 | 50.045 |
| 0.4914930555555555 | 50.043 |
| 0.49150462962962965 | 50.038 |
| 0.4915162037037037 | 50.038 |
| 0.4915277777777778 | 50.04 |
| 0.4915393518518518 | 50.038 |
| 0.4915509259259259 | 50.039 |
| 0.49156249999999996 | 50.034 |
| 0.4915740740740741 | 50.029 |
| 0.49158564814814815 | 50.024 |
| 0.49159722222222224 | 50.022 |
| 0.4916087962962963 | 50.022 |
| 0.4916203703703704 | 50.019 |
| 0.4916319444444444 | 50.018 |
| 0.49164351851851856 | 50.013 |
| 0.4916550925925926 | 50.015 |
| 0.4916666666666667 | 50.014 |
| 0.49167824074074074 | 50.007 |
| 0.49168981481481483 | 50.008 |
| 0.49170138888888887 | 50.009 |
| 0.491712962962963 | 50.01 |
| 0.49172453703703706 | 50.01 |
| 0.4917361111111111 | 50.01 |
| 0.4917476851851852 | 50.012 |
| 0.49175925925925923 | 50.014 |
| 0.4917708333333333 | 50.014 |
| 0.49178240740740736 | 50.016 |
| 0.4917939814814815 | 50.02 |
| 0.49180555555555555 | 50.018 |
| 0.49181712962962965 | 50.021 |
| 0.4918287037037037 | 50.024 |
| 0.4918402777777778 | 50.025 |
| 0.4918518518518518 | 50.028 |
| 0.49186342592592597 | 50.024 |
| 0.491875 | 50.029 |
| 0.4918865740740741 | 50.03 |
| 0.49189814814814814 | 50.03 |
| 0.49190972222222223 | 50.031 |
| 0.4919212962962963 | 50.037 |
| 0.4919328703703704 | 50.035 |
| 0.49194444444444446 | 50.032 |
| 0.4919560185185185 | 50.027 |
| 0.4919675925925926 | 50.026 |
| 0.49197916666666663 | 50.028 |
| 0.49199074074074073 | 50.022 |
| 0.49200231481481477 | 50.023 |
| 0.4920138888888889 | 50.022 |
| 0.49202546296296296 | 50.017 |
| 0.49203703703703705 | 50.014 |
| 0.4920486111111111 | 50.011 |
| 0.4920601851851852 | 50.009 |
| 0.4920717592592592 | 50.009 |
| 0.4920833333333334 | 50.011 |
| 0.4920949074074074 | 50.016 |
| 0.4921064814814815 | 50.023 |
| 0.49211805555555554 | 50.024 |
| 0.49212962962962964 | 50.022 |
| 0.4921412037037037 | 50.019 |
| 0.49215277777777783 | 50.021 |
| 0.49216435185185187 | 50.023 |
| 0.49217592592592596 | 50.021 |
| 0.4921875 | 50.024 |
| 0.49219907407407404 | 50.025 |
| 0.49221064814814813 | 50.024 |
| 0.49222222222222217 | 50.023 |
| 0.4922337962962963 | 50.024 |
| 0.49224537037037036 | 50.024 |
| 0.49225694444444446 | 50.024 |
| 0.4922685185185185 | 50.02 |
| 0.4922800925925926 | 50.013 |
| 0.4922916666666666 | 50.013 |
| 0.4923032407407408 | 50.007 |
| 0.4923148148148148 | 50.005 |
| 0.4923263888888889 | 50.001 |
| 0.49233796296296295 | 50 |
| 0.49234953703703704 | 50.003 |
| 0.4923611111111111 | 50.008 |
| 0.49237268518518523 | 50.012 |
| 0.49238425925925927 | 50.018 |
| 0.49239583333333337 | 50.018 |
| 0.4924074074074074 | 50.02 |
| 0.4924189814814815 | 50.026 |
| 0.49243055555555554 | 50.029 |
| 0.4924421296296296 | 50.03 |
| 0.4924537037037037 | 50.026 |
| 0.49246527777777777 | 50.025 |
| 0.49247685185185186 | 50.028 |
| 0.4924884259259259 | 50.027 |
| 0.4925 | 50.024 |
| 0.49251157407407403 | 50.031 |
| 0.4925231481481482 | 50.026 |
| 0.4925347222222222 | 50.025 |
| 0.4925462962962963 | 50.02 |
| 0.49255787037037035 | 50.02 |
| 0.49256944444444445 | 50.017 |
| 0.4925810185185185 | 50.017 |
| 0.49259259259259264 | 50.022 |
| 0.4926041666666667 | 50.023 |
| 0.49261574074074077 | 50.026 |
| 0.4926273148148148 | 50.028 |
| 0.4926388888888889 | 50.036 |
| 0.49265046296296294 | 50.037 |
| 0.492662037037037 | 50.04 |
| 0.49267361111111113 | 50.037 |
| 0.49268518518518517 | 50.038 |
| 0.49269675925925926 | 50.036 |
| 0.4927083333333333 | 50.037 |
| 0.4927199074074074 | 50.039 |
| 0.49273148148148144 | 50.038 |
| 0.4927430555555556 | 50.037 |
| 0.4927546296296296 | 50.032 |
| 0.4927662037037037 | 50.035 |
| 0.49277777777777776 | 50.035 |
| 0.49278935185185185 | 50.034 |
| 0.4928009259259259 | 50.031 |
| 0.49281250000000004 | 50.03 |
| 0.4928240740740741 | 50.025 |
| 0.4928356481481482 | 50.026 |
| 0.4928472222222222 | 50.025 |
| 0.4928587962962963 | 50.024 |
| 0.49287037037037035 | 50.025 |
| 0.4928819444444445 | 50.026 |
| 0.49289351851851854 | 50.023 |
| 0.4929050925925926 | 50.028 |
| 0.49291666666666667 | 50.033 |
| 0.4929282407407407 | 50.033 |
| 0.4929398148148148 | 50.03 |
| 0.49295138888888884 | 50.032 |
| 0.492962962962963 | 50.036 |
| 0.49297453703703703 | 50.037 |
| 0.4929861111111111 | 50.036 |
| 0.49299768518518516 | 50.034 |
| 0.49300925925925926 | 50.029 |
| 0.4930208333333333 | 50.023 |
| 0.49303240740740745 | 50.018 |
| 0.4930439814814815 | 50.016 |
| 0.4930555555555556 | 50.014 |
| 0.4930671296296296 | 50.01 |
| 0.4930787037037037 | 50.001 |
| 0.49309027777777775 | 49.998 |
| 0.4931018518518519 | 49.999 |
| 0.49311342592592594 | 50.001 |
| 0.49312500000000004 | 50.003 |
| 0.4931365740740741 | 50.006 |
| 0.4931481481481481 | 50.008 |
| 0.4931597222222222 | 50.01 |
| 0.49317129629629625 | 50.015 |
| 0.4931828703703704 | 50.021 |
| 0.49319444444444444 | 50.017 |
| 0.49320601851851853 | 50.013 |
| 0.49321759259259257 | 50.01 |
| 0.49322916666666666 | 50.014 |
| 0.4932407407407407 | 50.013 |
| 0.49325231481481485 | 50.016 |
| 0.4932638888888889 | 50.021 |
| 0.493275462962963 | 50.025 |
| 0.493287037037037 | 50.023 |
| 0.4932986111111111 | 50.02 |
| 0.49331018518518516 | 50.018 |
| 0.4933217592592593 | 50.014 |
| 0.49333333333333335 | 50.009 |
| 0.49334490740740744 | 50.004 |
| 0.4933564814814815 | 49.995 |
| 0.4933680555555556 | 49.995 |
| 0.4933796296296296 | 49.987 |
| 0.49339120370370365 | 49.986 |
| 0.4934027777777778 | 49.989 |
| 0.49341435185185184 | 49.992 |
| 0.49342592592592593 | 49.992 |
| 0.4934375 | 49.995 |
| 0.49344907407407407 | 49.998 |
| 0.4934606481481481 | 50.006 |
| 0.49347222222222226 | 50.01 |
| 0.4934837962962963 | 50.015 |
| 0.4934953703703704 | 50.021 |
| 0.49350694444444443 | 50.021 |
| 0.4935185185185185 | 50.023 |
| 0.49353009259259256 | 50.023 |
| 0.4935416666666667 | 50.028 |
| 0.49355324074074075 | 50.029 |
| 0.49356481481481485 | 50.024 |
| 0.4935763888888889 | 50.023 |
| 0.493587962962963 | 50.023 |
| 0.493599537037037 | 50.021 |
| 0.49361111111111106 | 50.02 |
| 0.4936226851851852 | 50.023 |
| 0.49363425925925924 | 50.025 |
| 0.49364583333333334 | 50.027 |
| 0.4936574074074074 | 50.03 |
| 0.4936689814814815 | 50.026 |
| 0.4936805555555555 | 50.025 |
| 0.49369212962962966 | 50.022 |
| 0.4937037037037037 | 50.023 |
| 0.4937152777777778 | 50.024 |
| 0.49372685185185183 | 50.034 |
| 0.49373842592592593 | 50.036 |
| 0.49374999999999997 | 50.038 |
| 0.4937615740740741 | 50.044 |
| 0.49377314814814816 | 50.049 |
| 0.49378472222222225 | 50.053 |
| 0.4937962962962963 | 50.053 |
| 0.4938078703703704 | 50.049 |
| 0.4938194444444444 | 50.049 |
| 0.49383101851851857 | 50.045 |
| 0.4938425925925926 | 50.037 |
| 0.49385416666666665 | 50.038 |
| 0.49386574074074074 | 50.037 |
| 0.4938773148148148 | 50.032 |
| 0.4938888888888889 | 50.032 |
| 0.4939004629629629 | 50.031 |
| 0.49391203703703707 | 50.031 |
| 0.4939236111111111 | 50.029 |
| 0.4939351851851852 | 50.031 |
| 0.49394675925925924 | 50.034 |
| 0.49395833333333333 | 50.034 |
| 0.49396990740740737 | 50.034 |
| 0.4939814814814815 | 50.033 |
| 0.49399305555555556 | 50.038 |
| 0.49400462962962965 | 50.04 |
| 0.4940162037037037 | 50.043 |
| 0.4940277777777778 | 50.044 |
| 0.4940393518518518 | 50.044 |
| 0.494050925925926 | 50.046 |
| 0.4940625 | 50.051 |
| 0.4940740740740741 | 50.055 |
| 0.49408564814814815 | 50.058 |
| 0.4940972222222222 | 50.056 |
| 0.4941087962962963 | 50.057 |
| 0.4941203703703703 | 50.058 |
| 0.49413194444444447 | 50.059 |
| 0.4941435185185185 | 50.059 |
| 0.4941550925925926 | 50.059 |
| 0.49416666666666664 | 50.056 |
| 0.49417824074074074 | 50.055 |
| 0.4941898148148148 | 50.053 |
| 0.4942013888888889 | 50.053 |
| 0.49421296296296297 | 50.058 |
| 0.49422453703703706 | 50.064 |
| 0.4942361111111111 | 50.063 |
| 0.4942476851851852 | 50.063 |
| 0.49425925925925923 | 50.06 |
| 0.4942708333333334 | 50.061 |
| 0.4942824074074074 | 50.059 |
| 0.4942939814814815 | 50.059 |
| 0.49430555555555555 | 50.061 |
| 0.49431712962962965 | 50.062 |
| 0.4943287037037037 | 50.057 |
| 0.4943402777777777 | 50.058 |
| 0.4943518518518519 | 50.059 |
| 0.4943634259259259 | 50.061 |
| 0.494375 | 50.067 |
| 0.49438657407407405 | 50.067 |
| 0.49439814814814814 | 50.067 |
| 0.4944097222222222 | 50.068 |
| 0.49442129629629633 | 50.07 |
| 0.49443287037037037 | 50.07 |
| 0.49444444444444446 | 50.069 |
| 0.4944560185185185 | 50.063 |
| 0.4944675925925926 | 50.058 |
| 0.49447916666666664 | 50.059 |
| 0.4944907407407408 | 50.055 |
| 0.4945023148148148 | 50.056 |
| 0.4945138888888889 | 50.054 |
| 0.49452546296296296 | 50.056 |
| 0.49453703703703705 | 50.06 |
| 0.4945486111111111 | 50.063 |
| 0.49456018518518513 | 50.064 |
| 0.4945717592592593 | 50.062 |
| 0.4945833333333333 | 50.06 |
| 0.4945949074074074 | 50.045 |
| 0.49460648148148145 | 50.035 |
| 0.49461805555555555 | 50.03 |
| 0.4946296296296296 | 50.025 |
| 0.49464120370370374 | 50.02 |
| 0.4946527777777778 | 50.022 |
| 0.49466435185185187 | 50.025 |
| 0.4946759259259259 | 50.027 |
| 0.4946875 | 50.029 |
| 0.49469907407407404 | 50.033 |
| 0.4947106481481482 | 50.041 |
| 0.49472222222222223 | 50.046 |
| 0.4947337962962963 | 50.046 |
| 0.49474537037037036 | 50.045 |
| 0.49475694444444446 | 50.045 |
| 0.4947685185185185 | 50.044 |
| 0.49478009259259265 | 50.044 |
| 0.4947916666666667 | 50.042 |
| 0.4948032407407407 | 50.044 |
| 0.4948148148148148 | 50.043 |
| 0.49482638888888886 | 50.041 |
| 0.49483796296296295 | 50.041 |
| 0.494849537037037 | 50.042 |
| 0.49486111111111114 | 50.045 |
| 0.4948726851851852 | 50.046 |
| 0.4948842592592593 | 50.045 |
| 0.4948958333333333 | 50.046 |
| 0.4949074074074074 | 50.046 |
| 0.49491898148148145 | 50.044 |
| 0.4949305555555556 | 50.043 |
| 0.49494212962962963 | 50.041 |
| 0.49495370370370373 | 50.032 |
| 0.49496527777777777 | 50.028 |
| 0.49497685185185186 | 50.032 |
| 0.4949884259259259 | 50.029 |
| 0.49500000000000005 | 50.03 |
| 0.4950115740740741 | 50.029 |
| 0.4950231481481482 | 50.026 |
| 0.4950347222222222 | 50.027 |
| 0.49504629629629626 | 50.026 |
| 0.49505787037037036 | 50.024 |
| 0.4950694444444444 | 50.018 |
| 0.49508101851851855 | 50 |
| 0.4950925925925926 | 49.98 |
| 0.4951041666666667 | 49.967 |
| 0.4951157407407407 | 49.96 |
| 0.4951273148148148 | 49.96 |
| 0.49513888888888885 | 49.96 |
| 0.495150462962963 | 49.962 |
| 0.49516203703703704 | 49.962 |
| 0.49517361111111113 | 49.961 |
| 0.4951851851851852 | 49.962 |
| 0.49519675925925927 | 49.965 |
| 0.4952083333333333 | 49.969 |
| 0.49521990740740746 | 49.969 |
| 0.4952314814814815 | 49.968 |
| 0.4952430555555556 | 49.967 |
| 0.49525462962962963 | 49.966 |
| 0.49526620370370367 | 49.961 |
| 0.49527777777777776 | 49.962 |
| 0.4952893518518518 | 49.96 |
| 0.49530092592592595 | 49.962 |
| 0.4953125 | 49.96 |
| 0.4953240740740741 | 49.96 |
| 0.4953356481481481 | 49.959 |
| 0.4953472222222222 | 49.959 |
| 0.49535879629629626 | 49.955 |
| 0.4953703703703704 | 49.951 |
| 0.49538194444444444 | 49.95 |
| 0.49539351851851854 | 49.953 |
| 0.4954050925925926 | 49.954 |
| 0.49541666666666667 | 49.955 |
| 0.4954282407407407 | 49.957 |
| 0.49543981481481486 | 49.958 |
| 0.4954513888888889 | 49.961 |
| 0.495462962962963 | 49.966 |
| 0.49547453703703703 | 49.97 |
| 0.4954861111111111 | 49.968 |
| 0.49549768518518517 | 49.963 |
| 0.4955092592592592 | 49.963 |
| 0.49552083333333335 | 49.964 |
| 0.4955324074074074 | 49.961 |
| 0.4955439814814815 | 49.957 |
| 0.4955555555555555 | 49.957 |
| 0.4955671296296296 | 49.956 |
| 0.49557870370370366 | 49.949 |
| 0.4955902777777778 | 49.948 |
| 0.49560185185185185 | 49.949 |
| 0.49561342592592594 | 49.952 |
| 0.495625 | 49.947 |
| 0.4956365740740741 | 49.943 |
| 0.4956481481481481 | 49.944 |
| 0.49565972222222227 | 49.946 |
| 0.4956712962962963 | 49.944 |
| 0.4956828703703704 | 49.942 |
| 0.49569444444444444 | 49.946 |
| 0.49570601851851853 | 49.948 |
| 0.49571759259259257 | 49.945 |
| 0.4957291666666667 | 49.95 |
| 0.49574074074074076 | 49.952 |
| 0.4957523148148148 | 49.95 |
| 0.4957638888888889 | 49.952 |
| 0.49577546296296293 | 49.954 |
| 0.495787037037037 | 49.951 |
| 0.49579861111111106 | 49.951 |
| 0.4958101851851852 | 49.949 |
| 0.49582175925925925 | 49.95 |
| 0.49583333333333335 | 49.957 |
| 0.4958449074074074 | 49.951 |
| 0.4958564814814815 | 49.947 |
| 0.4958680555555555 | 49.949 |
| 0.49587962962962967 | 49.943 |
| 0.4958912037037037 | 49.941 |
| 0.4959027777777778 | 49.939 |
| 0.49591435185185184 | 49.939 |
| 0.49592592592592594 | 49.941 |
| 0.4959375 | 49.943 |
| 0.4959490740740741 | 49.945 |
| 0.49596064814814816 | 49.95 |
| 0.49597222222222226 | 49.955 |
| 0.4959837962962963 | 49.956 |
| 0.49599537037037034 | 49.952 |
| 0.49600694444444443 | 49.949 |
| 0.49601851851851847 | 49.945 |
| 0.4960300925925926 | 49.944 |
| 0.49604166666666666 | 49.945 |
| 0.49605324074074075 | 49.941 |
| 0.4960648148148148 | 49.934 |
| 0.4960763888888889 | 49.925 |
| 0.4960879629629629 | 49.927 |
| 0.4960995370370371 | 49.93 |
| 0.4961111111111111 | 49.933 |
| 0.4961226851851852 | 49.934 |
| 0.49613425925925925 | 49.94 |
| 0.49614583333333334 | 49.944 |
| 0.4961574074074074 | 49.95 |
| 0.49616898148148153 | 49.955 |
| 0.49618055555555557 | 49.957 |
| 0.49619212962962966 | 49.955 |
| 0.4962037037037037 | 49.95 |
| 0.49621527777777774 | 49.948 |
| 0.49622685185185184 | 49.949 |
| 0.4962384259259259 | 49.949 |
| 0.49625 | 49.944 |
| 0.49626157407407406 | 49.94 |
| 0.49627314814814816 | 49.941 |
| 0.4962847222222222 | 49.939 |
| 0.4962962962962963 | 49.935 |
| 0.49630787037037033 | 49.934 |
| 0.4963194444444445 | 49.935 |
| 0.4963310185185185 | 49.946 |
| 0.4963425925925926 | 49.955 |
| 0.49635416666666665 | 49.96 |
| 0.49636574074074075 | 49.962 |
| 0.4963773148148148 | 49.959 |
| 0.49638888888888894 | 49.957 |
| 0.496400462962963 | 49.955 |
| 0.49641203703703707 | 49.954 |
| 0.4964236111111111 | 49.954 |
| 0.4964351851851852 | 49.952 |
| 0.49644675925925924 | 49.954 |
| 0.4964583333333333 | 49.958 |
| 0.49646990740740743 | 49.953 |
| 0.49648148148148147 | 49.952 |
| 0.49649305555555556 | 49.953 |
| 0.4965046296296296 | 49.95 |
| 0.4965162037037037 | 49.945 |
| 0.49652777777777773 | 49.94 |
| 0.4965393518518519 | 49.937 |
| 0.4965509259259259 | 49.937 |
| 0.4965625 | 49.936 |
| 0.49657407407407406 | 49.934 |
| 0.49658564814814815 | 49.939 |
| 0.4965972222222222 | 49.938 |
| 0.49660879629629634 | 49.94 |
| 0.4966203703703704 | 49.943 |
| 0.4966319444444445 | 49.943 |
| 0.4966435185185185 | 49.939 |
| 0.4966550925925926 | 49.936 |
| 0.49666666666666665 | 49.936 |
| 0.4966782407407408 | 49.936 |
| 0.49668981481481483 | 49.934 |
| 0.4967013888888889 | 49.929 |
| 0.49671296296296297 | 49.926 |
| 0.496724537037037 | 49.922 |
| 0.4967361111111111 | 49.922 |
| 0.49674768518518514 | 49.924 |
| 0.4967592592592593 | 49.924 |
| 0.49677083333333333 | 49.93 |
| 0.4967824074074074 | 49.931 |
| 0.49679398148148146 | 49.933 |
| 0.49680555555555556 | 49.935 |
| 0.4968171296296296 | 49.934 |
| 0.49682870370370374 | 49.936 |
| 0.4968402777777778 | 49.932 |
| 0.4968518518518519 | 49.933 |
| 0.4968634259259259 | 49.939 |
| 0.496875 | 49.936 |
| 0.49688657407407405 | 49.938 |
| 0.4968981481481482 | 49.939 |
| 0.49690972222222224 | 49.942 |
| 0.49692129629629633 | 49.94 |
| 0.49693287037037037 | 49.942 |
| 0.4969444444444444 | 49.942 |
| 0.4969560185185185 | 49.942 |
| 0.49696759259259254 | 49.942 |
| 0.4969791666666667 | 49.941 |
| 0.49699074074074073 | 49.938 |
| 0.4970023148148148 | 49.936 |
| 0.49701388888888887 | 49.935 |
| 0.49702546296296296 | 49.935 |
| 0.497037037037037 | 49.937 |
| 0.49704861111111115 | 49.938 |
| 0.4970601851851852 | 49.937 |
| 0.4970717592592593 | 49.939 |
| 0.4970833333333333 | 49.945 |
| 0.4970949074074074 | 49.946 |
| 0.49710648148148145 | 49.942 |
| 0.4971180555555556 | 49.936 |
| 0.49712962962962964 | 49.935 |
| 0.49714120370370374 | 49.932 |
| 0.4971527777777778 | 49.928 |
| 0.4971643518518518 | 49.927 |
| 0.4971759259259259 | 49.926 |
| 0.49718749999999995 | 49.923 |
| 0.4971990740740741 | 49.92 |
| 0.49721064814814814 | 49.917 |
| 0.49722222222222223 | 49.92 |
| 0.49723379629629627 | 49.919 |
| 0.49724537037037037 | 49.914 |
| 0.4972569444444444 | 49.913 |
| 0.49726851851851855 | 49.914 |
| 0.4972800925925926 | 49.911 |
| 0.4972916666666667 | 49.911 |
| 0.4973032407407407 | 49.909 |
| 0.4973148148148148 | 49.913 |
| 0.49732638888888886 | 49.92 |
| 0.497337962962963 | 49.921 |
| 0.49734953703703705 | 49.924 |
| 0.49736111111111114 | 49.934 |
| 0.4973726851851852 | 49.938 |
| 0.4973842592592593 | 49.94 |
| 0.4973958333333333 | 49.938 |
| 0.49740740740740735 | 49.936 |
| 0.4974189814814815 | 49.935 |
| 0.49743055555555554 | 49.933 |
| 0.49744212962962964 | 49.934 |
| 0.4974537037037037 | 49.931 |
| 0.49746527777777777 | 49.928 |
| 0.4974768518518518 | 49.928 |
| 0.49748842592592596 | 49.929 |
| 0.4975 | 49.927 |
| 0.4975115740740741 | 49.93 |
| 0.49752314814814813 | 49.933 |
| 0.4975347222222222 | 49.933 |
| 0.49754629629629626 | 49.934 |
| 0.4975578703703704 | 49.941 |
| 0.49756944444444445 | 49.946 |
| 0.49758101851851855 | 49.949 |
| 0.4975925925925926 | 49.952 |
| 0.4976041666666667 | 49.954 |
| 0.4976157407407407 | 49.95 |
| 0.49762731481481487 | 49.949 |
| 0.4976388888888889 | 49.943 |
| 0.49765046296296295 | 49.938 |
| 0.49766203703703704 | 49.933 |
| 0.4976736111111111 | 49.931 |
| 0.4976851851851852 | 49.931 |
| 0.4976967592592592 | 49.928 |
| 0.49770833333333336 | 49.932 |
| 0.4977199074074074 | 49.935 |
| 0.4977314814814815 | 49.934 |
| 0.49774305555555554 | 49.935 |
| 0.49775462962962963 | 49.936 |
| 0.49776620370370367 | 49.935 |
| 0.4977777777777778 | 49.935 |
| 0.49778935185185186 | 49.936 |
| 0.49780092592592595 | 49.935 |
| 0.4978125 | 49.936 |
| 0.4978240740740741 | 49.937 |
| 0.4978356481481481 | 49.944 |
| 0.4978472222222223 | 49.949 |
| 0.4978587962962963 | 49.951 |
| 0.49787037037037035 | 49.951 |
| 0.49788194444444445 | 49.952 |
| 0.4978935185185185 | 49.954 |
| 0.4979050925925926 | 49.955 |
| 0.4979166666666666 | 49.959 |
| 0.49792824074074077 | 49.964 |
| 0.4979398148148148 | 49.966 |
| 0.4979513888888889 | 49.964 |
| 0.49796296296296294 | 49.964 |
| 0.49797453703703703 | 49.966 |
| 0.4979861111111111 | 49.967 |
| 0.4979976851851852 | 49.964 |
| 0.49800925925925926 | 49.959 |
| 0.49802083333333336 | 49.96 |
| 0.4980324074074074 | 49.96 |
| 0.4980439814814815 | 49.96 |
| 0.49805555555555553 | 49.958 |
| 0.4980671296296297 | 49.958 |
| 0.4980787037037037 | 49.958 |
| 0.4980902777777778 | 49.959 |
| 0.49810185185185185 | 49.958 |
| 0.4981134259259259 | 49.958 |
| 0.498125 | 49.955 |
| 0.498136574074074 | 49.951 |
| 0.4981481481481482 | 49.949 |
| 0.4981597222222222 | 49.946 |
| 0.4981712962962963 | 49.948 |
| 0.49818287037037035 | 49.95 |
| 0.49819444444444444 | 49.95 |
| 0.4982060185185185 | 49.954 |
| 0.49821759259259263 | 49.956 |
| 0.49822916666666667 | 49.956 |
| 0.49824074074074076 | 49.954 |
| 0.4982523148148148 | 49.953 |
| 0.4982638888888889 | 49.951 |
| 0.49827546296296293 | 49.951 |
| 0.4982870370370371 | 49.951 |
| 0.4982986111111111 | 49.951 |
| 0.4983101851851852 | 49.952 |
| 0.49832175925925926 | 49.95 |
| 0.49833333333333335 | 49.948 |
| 0.4983449074074074 | 49.945 |
| 0.49835648148148143 | 49.944 |
| 0.4983680555555556 | 49.944 |
| 0.4983796296296296 | 49.946 |
| 0.4983912037037037 | 49.948 |
| 0.49840277777777775 | 49.953 |
| 0.49841435185185184 | 49.952 |
| 0.4984259259259259 | 49.945 |
| 0.49843750000000003 | 49.941 |
| 0.49844907407407407 | 49.939 |
| 0.49846064814814817 | 49.939 |
| 0.4984722222222222 | 49.941 |
| 0.4984837962962963 | 49.941 |
| 0.49849537037037034 | 49.937 |
| 0.4985069444444445 | 49.934 |
| 0.4985185185185185 | 49.932 |
| 0.4985300925925926 | 49.934 |
| 0.49854166666666666 | 49.931 |
| 0.49855324074074076 | 49.932 |
| 0.4985648148148148 | 49.937 |
| 0.49857638888888894 | 49.939 |
| 0.498587962962963 | 49.935 |
| 0.498599537037037 | 49.933 |
| 0.4986111111111111 | 49.936 |
| 0.49862268518518515 | 49.94 |
| 0.49863425925925925 | 49.94 |
| 0.4986458333333333 | 49.938 |
| 0.49865740740740744 | 49.94 |
| 0.4986689814814815 | 49.945 |
| 0.49868055555555557 | 49.944 |
| 0.4986921296296296 | 49.945 |
| 0.4987037037037037 | 49.947 |
| 0.49871527777777774 | 49.945 |
| 0.4987268518518519 | 49.942 |
| 0.49873842592592593 | 49.942 |
| 0.49875 | 49.94 |
| 0.49876157407407407 | 49.933 |
| 0.49877314814814816 | 49.928 |
| 0.4987847222222222 | 49.926 |
| 0.49879629629629635 | 49.922 |
| 0.4988078703703704 | 49.923 |
| 0.4988194444444444 | 49.921 |
| 0.4988310185185185 | 49.921 |
| 0.49884259259259256 | 49.923 |
| 0.49885416666666665 | 49.924 |
| 0.4988657407407407 | 49.924 |
| 0.49887731481481484 | 49.923 |
| 0.4988888888888889 | 49.927 |
| 0.498900462962963 | 49.925 |
| 0.498912037037037 | 49.929 |
| 0.4989236111111111 | 49.935 |
| 0.49893518518518515 | 49.937 |
| 0.4989467592592593 | 49.941 |
| 0.49895833333333334 | 49.937 |
| 0.49896990740740743 | 49.935 |
| 0.49898148148148147 | 49.928 |
| 0.49899305555555556 | 49.926 |
| 0.4990046296296296 | 49.926 |
| 0.49901620370370375 | 49.928 |
| 0.4990277777777778 | 49.925 |
| 0.4990393518518519 | 49.927 |
| 0.4990509259259259 | 49.932 |
| 0.49906249999999996 | 49.938 |
| 0.49907407407407406 | 49.94 |
| 0.4990856481481481 | 49.943 |
| 0.49909722222222225 | 49.943 |
| 0.4991087962962963 | 49.947 |
| 0.4991203703703704 | 49.947 |
| 0.4991319444444444 | 49.949 |
| 0.4991435185185185 | 49.953 |
| 0.49915509259259255 | 49.956 |
| 0.4991666666666667 | 49.958 |
| 0.49917824074074074 | 49.961 |
| 0.49918981481481484 | 49.961 |
| 0.4992013888888889 | 49.964 |
| 0.49921296296296297 | 49.966 |
| 0.499224537037037 | 49.97 |
| 0.49923611111111116 | 49.976 |
| 0.4992476851851852 | 49.973 |
| 0.4992592592592593 | 49.971 |
| 0.49927083333333333 | 49.971 |
| 0.4992824074074074 | 49.972 |
| 0.49929398148148146 | 49.975 |
| 0.4993055555555555 | 49.977 |
| 0.49931712962962965 | 49.977 |
| 0.4993287037037037 | 49.978 |
| 0.4993402777777778 | 49.978 |
| 0.4993518518518518 | 49.976 |
| 0.4993634259259259 | 49.976 |
| 0.49937499999999996 | 49.973 |
| 0.4993865740740741 | 49.969 |
| 0.49939814814814815 | 49.966 |
| 0.49940972222222224 | 49.966 |
| 0.4994212962962963 | 49.972 |
| 0.4994328703703704 | 49.975 |
| 0.4994444444444444 | 49.976 |
| 0.49945601851851856 | 49.978 |
| 0.4994675925925926 | 49.98 |
| 0.4994791666666667 | 49.978 |
| 0.49949074074074074 | 49.977 |
| 0.49950231481481483 | 49.979 |
| 0.49951388888888887 | 49.978 |
| 0.499525462962963 | 49.978 |
| 0.49953703703703706 | 49.976 |
| 0.4995486111111111 | 49.978 |
| 0.4995601851851852 | 49.978 |
| 0.49957175925925923 | 49.975 |
| 0.4995833333333333 | 49.973 |
| 0.49959490740740736 | 49.968 |
| 0.4996064814814815 | 49.965 |
| 0.49961805555555555 | 49.961 |
| 0.49962962962962965 | 49.962 |
| 0.4996412037037037 | 49.969 |
| 0.4996527777777778 | 49.974 |
| 0.4996643518518518 | 49.976 |
| 0.49967592592592597 | 49.978 |
| 0.4996875 | 49.98 |
| 0.4996990740740741 | 49.982 |
| 0.49971064814814814 | 49.979 |
| 0.49972222222222223 | 49.983 |
| 0.4997337962962963 | 49.988 |
| 0.4997453703703704 | 49.988 |
| 0.49975694444444446 | 49.986 |
| 0.4997685185185185 | 49.985 |
| 0.4997800925925926 | 49.986 |
| 0.49979166666666663 | 49.988 |
| 0.49980324074074073 | 49.987 |
| 0.49981481481481477 | 49.985 |
| 0.4998263888888889 | 49.986 |
| 0.49983796296296296 | 49.983 |
| 0.49984953703703705 | 49.979 |
| 0.4998611111111111 | 49.979 |
| 0.4998726851851852 | 49.977 |
| 0.4998842592592592 | 49.975 |
| 0.4998958333333334 | 49.971 |
| 0.4999074074074074 | 49.967 |
| 0.4999189814814815 | 49.966 |
| 0.49993055555555554 | 49.963 |
| 0.49994212962962964 | 49.962 |
| 0.4999537037037037 | 49.962 |
| 0.49996527777777783 | 49.966 |
| 0.49997685185185187 | 49.964 |
| 0.49998842592592596 | 49.962 |
| 0.5 | 49.958 |
| 0.500011574074074 | 49.948 |
| 0.5000231481481482 | 49.937 |
| 0.5000347222222222 | 49.927 |
| 0.5000462962962963 | 49.925 |
| 0.5000578703703703 | 49.926 |
| 0.5000694444444445 | 49.926 |
| 0.5000810185185185 | 49.927 |
| 0.5000925925925926 | 49.931 |
| 0.5001041666666667 | 49.937 |
| 0.5001157407407407 | 49.939 |
| 0.5001273148148148 | 49.94 |
| 0.5001388888888889 | 49.94 |
| 0.500150462962963 | 49.941 |
| 0.5001620370370371 | 49.94 |
| 0.5001736111111111 | 49.941 |
| 0.5001851851851852 | 49.94 |
| 0.5001967592592592 | 49.934 |
| 0.5002083333333334 | 49.931 |
| 0.5002199074074074 | 49.93 |
| 0.5002314814814816 | 49.931 |
| 0.5002430555555556 | 49.926 |
| 0.5002546296296296 | 49.921 |
| 0.5002662037037037 | 49.923 |
| 0.5002777777777777 | 49.926 |
| 0.5002893518518519 | 49.926 |
| 0.5003009259259259 | 49.929 |
| 0.5003125 | 49.931 |
| 0.5003240740740741 | 49.933 |
| 0.5003356481481481 | 49.935 |
| 0.5003472222222222 | 49.937 |
| 0.5003587962962963 | 49.946 |
| 0.5003703703703704 | 49.949 |
| 0.5003819444444445 | 49.95 |
| 0.5003935185185185 | 49.95 |
| 0.5004050925925926 | 49.952 |
| 0.5004166666666666 | 49.955 |
| 0.5004282407407408 | 49.955 |
| 0.5004398148148148 | 49.957 |
| 0.500451388888889 | 49.958 |
| 0.500462962962963 | 49.958 |
| 0.500474537037037 | 49.955 |
| 0.5004861111111111 | 49.956 |
| 0.5004976851851851 | 49.959 |
| 0.5005092592592593 | 49.961 |
| 0.5005208333333333 | 49.959 |
| 0.5005324074074075 | 49.96 |
| 0.5005439814814815 | 49.962 |
| 0.5005555555555555 | 49.963 |
| 0.5005671296296296 | 49.965 |
| 0.5005787037037037 | 49.969 |
| 0.5005902777777778 | 49.972 |
| 0.5006018518518519 | 49.969 |
| 0.500613425925926 | 49.97 |
| 0.500625 | 49.97 |
| 0.500636574074074 | 49.969 |
| 0.5006481481481482 | 49.968 |
| 0.5006597222222222 | 49.967 |
| 0.5006712962962964 | 49.967 |
| 0.5006828703703704 | 49.972 |
| 0.5006944444444444 | 49.979 |
| 0.5007060185185185 | 49.978 |
| 0.5007175925925925 | 49.98 |
| 0.5007291666666667 | 49.978 |
| 0.5007407407407407 | 49.976 |
| 0.5007523148148149 | 49.978 |
| 0.5007638888888889 | 49.982 |
| 0.5007754629629629 | 49.982 |
| 0.500787037037037 | 49.978 |
| 0.5007986111111111 | 49.977 |
| 0.5008101851851852 | 49.977 |
| 0.5008217592592593 | 49.974 |
| 0.5008333333333334 | 49.97 |
| 0.5008449074074074 | 49.968 |
| 0.5008564814814814 | 49.973 |
| 0.5008680555555556 | 49.978 |
| 0.5008796296296296 | 49.979 |
| 0.5008912037037038 | 49.98 |
| 0.5009027777777778 | 49.982 |
| 0.5009143518518518 | 49.982 |
| 0.5009259259259259 | 49.982 |
| 0.5009375 | 49.984 |
| 0.5009490740740741 | 49.983 |
| 0.5009606481481481 | 49.981 |
| 0.5009722222222223 | 49.98 |
| 0.5009837962962963 | 49.984 |
| 0.5009953703703703 | 49.989 |
| 0.5010069444444444 | 49.99 |
| 0.5010185185185185 | 49.989 |
| 0.5010300925925926 | 49.986 |
| 0.5010416666666667 | 49.983 |
| 0.5010532407407408 | 49.98 |
| 0.5010648148148148 | 49.978 |
| 0.5010763888888888 | 49.975 |
| 0.501087962962963 | 49.975 |
| 0.501099537037037 | 49.974 |
| 0.5011111111111112 | 49.969 |
| 0.5011226851851852 | 49.968 |
| 0.5011342592592593 | 49.967 |
| 0.5011458333333333 | 49.968 |
| 0.5011574074074074 | 49.97 |
| 0.5011689814814815 | 49.973 |
| 0.5011805555555556 | 49.976 |
| 0.5011921296296297 | 49.975 |
| 0.5012037037037037 | 49.975 |
| 0.5012152777777777 | 49.973 |
| 0.5012268518518518 | 49.972 |
| 0.5012384259259259 | 49.969 |
| 0.50125 | 49.972 |
| 0.5012615740740741 | 49.974 |
| 0.5012731481481482 | 49.972 |
| 0.5012847222222222 | 49.968 |
| 0.5012962962962962 | 49.969 |
| 0.5013078703703704 | 49.973 |
| 0.5013194444444444 | 49.977 |
| 0.5013310185185186 | 49.984 |
| 0.5013425925925926 | 49.987 |
| 0.5013541666666667 | 49.986 |
| 0.5013657407407407 | 49.982 |
| 0.5013773148148148 | 49.982 |
| 0.5013888888888889 | 49.984 |
| 0.501400462962963 | 49.981 |
| 0.5014120370370371 | 49.976 |
| 0.5014236111111111 | 49.97 |
| 0.5014351851851852 | 49.969 |
| 0.5014467592592592 | 49.968 |
| 0.5014583333333333 | 49.967 |
| 0.5014699074074074 | 49.972 |
| 0.5014814814814815 | 49.983 |
| 0.5014930555555556 | 49.987 |
| 0.5015046296296296 | 49.984 |
| 0.5015162037037036 | 49.986 |
| 0.5015277777777778 | 49.989 |
| 0.5015393518518518 | 49.988 |
| 0.501550925925926 | 49.987 |
| 0.5015625 | 49.984 |
| 0.5015740740740741 | 49.982 |
| 0.5015856481481481 | 49.98 |
| 0.5015972222222222 | 49.979 |
| 0.5016087962962963 | 49.977 |
| 0.5016203703703704 | 49.977 |
| 0.5016319444444445 | 49.978 |
| 0.5016435185185185 | 49.978 |
| 0.5016550925925926 | 49.979 |
| 0.5016666666666666 | 49.979 |
| 0.5016782407407407 | 49.982 |
| 0.5016898148148148 | 49.986 |
| 0.5017013888888889 | 49.991 |
| 0.501712962962963 | 49.992 |
| 0.501724537037037 | 49.99 |
| 0.501736111111111 | 49.989 |
| 0.5017476851851852 | 49.99 |
| 0.5017592592592592 | 49.993 |
| 0.5017708333333334 | 49.993 |
| 0.5017824074074074 | 49.991 |
| 0.5017939814814815 | 49.99 |
| 0.5018055555555555 | 49.988 |
| 0.5018171296296297 | 49.985 |
| 0.5018287037037037 | 49.985 |
| 0.5018402777777778 | 49.987 |
| 0.5018518518518519 | 49.991 |
| 0.5018634259259259 | 49.998 |
| 0.501875 | 50.004 |
| 0.5018865740740741 | 50.013 |
| 0.5018981481481481 | 50.019 |
| 0.5019097222222222 | 50.021 |
| 0.5019212962962963 | 50.024 |
| 0.5019328703703704 | 50.024 |
| 0.5019444444444444 | 50.024 |
| 0.5019560185185185 | 50.023 |
| 0.5019675925925926 | 50.025 |
| 0.5019791666666666 | 50.027 |
| 0.5019907407407408 | 50.022 |
| 0.5020023148148148 | 50.021 |
| 0.5020138888888889 | 50.023 |
| 0.5020254629629629 | 50.026 |
| 0.5020370370370371 | 50.028 |
| 0.5020486111111111 | 50.034 |
| 0.5020601851851852 | 50.04 |
| 0.5020717592592593 | 50.041 |
| 0.5020833333333333 | 50.041 |
| 0.5020949074074074 | 50.037 |
| 0.5021064814814815 | 50.035 |
| 0.5021180555555556 | 50.037 |
| 0.5021296296296297 | 50.035 |
| 0.5021412037037037 | 50.033 |
| 0.5021527777777778 | 50.035 |
| 0.5021643518518518 | 50.036 |
| 0.5021759259259259 | 50.033 |
| 0.5021875 | 50.03 |
| 0.502199074074074 | 50.029 |
| 0.5022106481481482 | 50.027 |
| 0.5022222222222222 | 50.024 |
| 0.5022337962962963 | 50.026 |
| 0.5022453703703703 | 50.025 |
| 0.5022569444444445 | 50.028 |
| 0.5022685185185185 | 50.028 |
| 0.5022800925925927 | 50.036 |
| 0.5022916666666667 | 50.043 |
| 0.5023032407407407 | 50.048 |
| 0.5023148148148148 | 50.047 |
| 0.5023263888888889 | 50.046 |
| 0.502337962962963 | 50.049 |
| 0.5023495370370371 | 50.049 |
| 0.5023611111111111 | 50.048 |
| 0.5023726851851852 | 50.046 |
| 0.5023842592592592 | 50.049 |
| 0.5023958333333333 | 50.048 |
| 0.5024074074074074 | 50.046 |
| 0.5024189814814815 | 50.044 |
| 0.5024305555555556 | 50.041 |
| 0.5024421296296296 | 50.043 |
| 0.5024537037037037 | 50.043 |
| 0.5024652777777777 | 50.044 |
| 0.5024768518518519 | 50.045 |
| 0.5024884259259259 | 50.043 |
| 0.5025000000000001 | 50.041 |
| 0.5025115740740741 | 50.043 |
| 0.5025231481481481 | 50.045 |
| 0.5025347222222222 | 50.047 |
| 0.5025462962962963 | 50.046 |
| 0.5025578703703704 | 50.046 |
| 0.5025694444444445 | 50.049 |
| 0.5025810185185186 | 50.049 |
| 0.5025925925925926 | 50.054 |
| 0.5026041666666666 | 50.055 |
| 0.5026157407407407 | 50.055 |
| 0.5026273148148148 | 50.05 |
| 0.5026388888888889 | 50.049 |
| 0.502650462962963 | 50.048 |
| 0.502662037037037 | 50.051 |
| 0.5026736111111111 | 50.052 |
| 0.5026851851851851 | 50.059 |
| 0.5026967592592593 | 50.061 |
| 0.5027083333333333 | 50.063 |
| 0.5027199074074075 | 50.063 |
| 0.5027314814814815 | 50.062 |
| 0.5027430555555555 | 50.062 |
| 0.5027546296296296 | 50.057 |
| 0.5027662037037037 | 50.05 |
| 0.5027777777777778 | 50.044 |
| 0.5027893518518519 | 50.041 |
| 0.502800925925926 | 50.043 |
| 0.5028125 | 50.046 |
| 0.502824074074074 | 50.051 |
| 0.5028356481481482 | 50.058 |
| 0.5028472222222222 | 50.059 |
| 0.5028587962962963 | 50.057 |
| 0.5028703703703704 | 50.054 |
| 0.5028819444444445 | 50.051 |
| 0.5028935185185185 | 50.05 |
| 0.5029050925925925 | 50.046 |
| 0.5029166666666667 | 50.044 |
| 0.5029282407407407 | 50.045 |
| 0.5029398148148149 | 50.043 |
| 0.5029513888888889 | 50.043 |
| 0.502962962962963 | 50.04 |
| 0.502974537037037 | 50.036 |
| 0.5029861111111111 | 50.03 |
| 0.5029976851851852 | 50.026 |
| 0.5030092592592593 | 50.025 |
| 0.5030208333333334 | 50.026 |
| 0.5030324074074074 | 50.024 |
| 0.5030439814814814 | 50.025 |
| 0.5030555555555556 | 50.027 |
| 0.5030671296296296 | 50.031 |
| 0.5030787037037037 | 50.029 |
| 0.5030902777777778 | 50.03 |
| 0.5031018518518519 | 50.031 |
| 0.5031134259259259 | 50.03 |
| 0.5031249999999999 | 50.028 |
| 0.5031365740740741 | 50.029 |
| 0.5031481481481481 | 50.027 |
| 0.5031597222222223 | 50.023 |
| 0.5031712962962963 | 50.016 |
| 0.5031828703703703 | 50.02 |
| 0.5031944444444444 | 50.018 |
| 0.5032060185185185 | 50.023 |
| 0.5032175925925926 | 50.029 |
| 0.5032291666666667 | 50.037 |
| 0.5032407407407408 | 50.041 |
| 0.5032523148148148 | 50.043 |
| 0.5032638888888888 | 50.047 |
| 0.503275462962963 | 50.047 |
| 0.503287037037037 | 50.046 |
| 0.5032986111111112 | 50.041 |
| 0.5033101851851852 | 50.041 |
| 0.5033217592592593 | 50.038 |
| 0.5033333333333333 | 50.039 |
| 0.5033449074074073 | 50.044 |
| 0.5033564814814815 | 50.05 |
| 0.5033680555555555 | 50.049 |
| 0.5033796296296297 | 50.047 |
| 0.5033912037037037 | 50.038 |
| 0.5034027777777778 | 50.023 |
| 0.5034143518518518 | 50.001 |
| 0.5034259259259259 | 49.987 |
| 0.5034375 | 49.97 |
| 0.5034490740740741 | 49.964 |
| 0.5034606481481482 | 49.954 |
| 0.5034722222222222 | 49.95 |
| 0.5034837962962962 | 49.943 |
| 0.5034953703703704 | 49.943 |
| 0.5035069444444444 | 49.946 |
| 0.5035185185185186 | 49.951 |
| 0.5035300925925926 | 49.954 |
| 0.5035416666666667 | 49.956 |
| 0.5035532407407407 | 49.957 |
| 0.5035648148148147 | 49.952 |
| 0.5035763888888889 | 49.952 |
| 0.5035879629629629 | 49.952 |
| 0.5035995370370371 | 49.952 |
| 0.5036111111111111 | 49.952 |
| 0.5036226851851852 | 49.952 |
| 0.5036342592592592 | 49.953 |
| 0.5036458333333333 | 49.955 |
| 0.5036574074074074 | 49.951 |
| 0.5036689814814815 | 49.947 |
| 0.5036805555555556 | 49.947 |
| 0.5036921296296296 | 49.949 |
| 0.5037037037037037 | 49.946 |
| 0.5037152777777778 | 49.946 |
| 0.5037268518518518 | 49.944 |
| 0.503738425925926 | 49.94 |
| 0.50375 | 49.94 |
| 0.5037615740740741 | 49.939 |
| 0.5037731481481481 | 49.94 |
| 0.5037847222222223 | 49.939 |
| 0.5037962962962963 | 49.933 |
| 0.5038078703703703 | 49.931 |
| 0.5038194444444445 | 49.932 |
| 0.5038310185185185 | 49.935 |
| 0.5038425925925926 | 49.933 |
| 0.5038541666666666 | 49.936 |
| 0.5038657407407408 | 49.939 |
| 0.5038773148148148 | 49.936 |
| 0.5038888888888889 | 49.932 |
| 0.503900462962963 | 49.93 |
| 0.503912037037037 | 49.928 |
| 0.5039236111111111 | 49.925 |
| 0.5039351851851852 | 49.925 |
| 0.5039467592592592 | 49.928 |
| 0.5039583333333334 | 49.93 |
| 0.5039699074074074 | 49.929 |
| 0.5039814814814815 | 49.93 |
| 0.5039930555555555 | 49.935 |
| 0.5040046296296297 | 49.937 |
| 0.5040162037037037 | 49.935 |
| 0.5040277777777777 | 49.931 |
| 0.5040393518518519 | 49.93 |
| 0.5040509259259259 | 49.928 |
| 0.5040625 | 49.925 |
| 0.504074074074074 | 49.922 |
| 0.5040856481481482 | 49.919 |
| 0.5040972222222222 | 49.918 |
| 0.5041087962962963 | 49.916 |
| 0.5041203703703704 | 49.919 |
| 0.5041319444444444 | 49.927 |
| 0.5041435185185185 | 49.935 |
| 0.5041550925925926 | 49.939 |
| 0.5041666666666667 | 49.939 |
| 0.5041782407407408 | 49.939 |
| 0.5041898148148148 | 49.94 |
| 0.5042013888888889 | 49.939 |
| 0.5042129629629629 | 49.94 |
| 0.5042245370370371 | 49.941 |
| 0.5042361111111111 | 49.941 |
| 0.5042476851851853 | 49.94 |
| 0.5042592592592593 | 49.94 |
| 0.5042708333333333 | 49.94 |
| 0.5042824074074074 | 49.932 |
| 0.5042939814814814 | 49.924 |
| 0.5043055555555556 | 49.923 |
| 0.5043171296296296 | 49.923 |
| 0.5043287037037038 | 49.921 |
| 0.5043402777777778 | 49.917 |
| 0.5043518518518518 | 49.913 |
| 0.5043634259259259 | 49.914 |
| 0.504375 | 49.916 |
| 0.5043865740740741 | 49.919 |
| 0.5043981481481482 | 49.92 |
| 0.5044097222222222 | 49.921 |
| 0.5044212962962963 | 49.92 |
| 0.5044328703703703 | 49.923 |
| 0.5044444444444445 | 49.927 |
| 0.5044560185185185 | 49.925 |
| 0.5044675925925927 | 49.915 |
| 0.5044791666666667 | 49.909 |
| 0.5044907407407407 | 49.906 |
| 0.5045023148148148 | 49.905 |
| 0.5045138888888888 | 49.902 |
| 0.504525462962963 | 49.905 |
| 0.504537037037037 | 49.903 |
| 0.5045486111111112 | 49.903 |
| 0.5045601851851852 | 49.902 |
| 0.5045717592592592 | 49.905 |
| 0.5045833333333333 | 49.905 |
| 0.5045949074074074 | 49.905 |
| 0.5046064814814815 | 49.905 |
| 0.5046180555555556 | 49.907 |
| 0.5046296296296297 | 49.909 |
| 0.5046412037037037 | 49.912 |
| 0.5046527777777777 | 49.918 |
| 0.5046643518518519 | 49.918 |
| 0.5046759259259259 | 49.921 |
| 0.5046875000000001 | 49.921 |
| 0.5046990740740741 | 49.921 |
| 0.5047106481481481 | 49.925 |
| 0.5047222222222222 | 49.926 |
| 0.5047337962962963 | 49.923 |
| 0.5047453703703704 | 49.921 |
| 0.5047569444444444 | 49.918 |
| 0.5047685185185186 | 49.916 |
| 0.5047800925925926 | 49.914 |
| 0.5047916666666666 | 49.911 |
| 0.5048032407407407 | 49.908 |
| 0.5048148148148148 | 49.907 |
| 0.5048263888888889 | 49.904 |
| 0.504837962962963 | 49.907 |
| 0.504849537037037 | 49.91 |
| 0.5048611111111111 | 49.91 |
| 0.5048726851851851 | 49.906 |
| 0.5048842592592593 | 49.906 |
| 0.5048958333333333 | 49.907 |
| 0.5049074074074075 | 49.911 |
| 0.5049189814814815 | 49.915 |
| 0.5049305555555555 | 49.917 |
| 0.5049421296296296 | 49.913 |
| 0.5049537037037037 | 49.911 |
| 0.5049652777777778 | 49.909 |
| 0.5049768518518518 | 49.911 |
| 0.504988425925926 | 49.909 |
| 0.505 | 49.91 |
| 0.505011574074074 | 49.916 |
| 0.5050231481481481 | 49.914 |
| 0.5050347222222222 | 49.916 |
| 0.5050462962962963 | 49.918 |
| 0.5050578703703704 | 49.922 |
| 0.5050694444444445 | 49.926 |
| 0.5050810185185185 | 49.93 |
| 0.5050925925925925 | 49.929 |
| 0.5051041666666667 | 49.929 |
| 0.5051157407407407 | 49.932 |
| 0.5051273148148149 | 49.932 |
| 0.5051388888888889 | 49.934 |
| 0.505150462962963 | 49.935 |
| 0.505162037037037 | 49.935 |
| 0.5051736111111111 | 49.932 |
| 0.5051851851851852 | 49.928 |
| 0.5051967592592593 | 49.924 |
| 0.5052083333333334 | 49.925 |
| 0.5052199074074074 | 49.925 |
| 0.5052314814814814 | 49.923 |
| 0.5052430555555555 | 49.923 |
| 0.5052546296296296 | 49.924 |
| 0.5052662037037037 | 49.923 |
| 0.5052777777777778 | 49.918 |
| 0.5052893518518519 | 49.918 |
| 0.5053009259259259 | 49.918 |
| 0.5053124999999999 | 49.916 |
| 0.5053240740740741 | 49.912 |
| 0.5053356481481481 | 49.914 |
| 0.5053472222222223 | 49.919 |
| 0.5053587962962963 | 49.923 |
| 0.5053703703703704 | 49.93 |
| 0.5053819444444444 | 49.934 |
| 0.5053935185185185 | 49.936 |
| 0.5054050925925926 | 49.935 |
| 0.5054166666666667 | 49.932 |
| 0.5054282407407408 | 49.928 |
| 0.5054398148148148 | 49.929 |
| 0.5054513888888889 | 49.93 |
| 0.5054629629629629 | 49.936 |
| 0.505474537037037 | 49.938 |
| 0.5054861111111111 | 49.939 |
| 0.5054976851851852 | 49.929 |
| 0.5055092592592593 | 49.922 |
| 0.5055208333333333 | 49.92 |
| 0.5055324074074073 | 49.918 |
| 0.5055439814814815 | 49.924 |
| 0.5055555555555555 | 49.927 |
| 0.5055671296296297 | 49.935 |
| 0.5055787037037037 | 49.935 |
| 0.5055902777777778 | 49.935 |
| 0.5056018518518518 | 49.933 |
| 0.505613425925926 | 49.934 |
| 0.505625 | 49.931 |
| 0.5056365740740741 | 49.927 |
| 0.5056481481481482 | 49.927 |
| 0.5056597222222222 | 49.927 |
| 0.5056712962962963 | 49.928 |
| 0.5056828703703703 | 49.929 |
| 0.5056944444444444 | 49.929 |
| 0.5057060185185185 | 49.927 |
| 0.5057175925925926 | 49.927 |
| 0.5057291666666667 | 49.932 |
| 0.5057407407407407 | 49.934 |
| 0.5057523148148148 | 49.939 |
| 0.5057638888888889 | 49.937 |
| 0.5057754629629629 | 49.932 |
| 0.5057870370370371 | 49.933 |
| 0.5057986111111111 | 49.928 |
| 0.5058101851851852 | 49.922 |
| 0.5058217592592592 | 49.92 |
| 0.5058333333333334 | 49.922 |
| 0.5058449074074074 | 49.926 |
| 0.5058564814814815 | 49.932 |
| 0.5058680555555556 | 49.937 |
| 0.5058796296296296 | 49.94 |
| 0.5058912037037037 | 49.939 |
| 0.5059027777777778 | 49.939 |
| 0.5059143518518519 | 49.948 |
| 0.5059259259259259 | 49.955 |
| 0.5059375 | 49.961 |
| 0.5059490740740741 | 49.968 |
| 0.5059606481481481 | 49.974 |
| 0.5059722222222222 | 49.983 |
| 0.5059837962962963 | 49.991 |
| 0.5059953703703703 | 49.996 |
| 0.5060069444444445 | 50.003 |
| 0.5060185185185185 | 50.009 |
| 0.5060300925925926 | 50.015 |
| 0.5060416666666666 | 50.02 |
| 0.5060532407407408 | 50.023 |
| 0.5060648148148148 | 50.027 |
| 0.506076388888889 | 50.025 |
| 0.506087962962963 | 50.024 |
| 0.506099537037037 | 50.027 |
| 0.5061111111111111 | 50.029 |
| 0.5061226851851852 | 50.028 |
| 0.5061342592592593 | 50.028 |
| 0.5061458333333334 | 50.032 |
| 0.5061574074074074 | 50.035 |
| 0.5061689814814815 | 50.038 |
| 0.5061805555555555 | 50.04 |
| 0.5061921296296296 | 50.045 |
| 0.5062037037037037 | 50.048 |
| 0.5062152777777778 | 50.044 |
| 0.5062268518518519 | 50.043 |
| 0.5062384259259259 | 50.043 |
| 0.50625 | 50.041 |
| 0.506261574074074 | 50.038 |
| 0.5062731481481482 | 50.04 |
| 0.5062847222222222 | 50.044 |
| 0.5062962962962964 | 50.044 |
| 0.5063078703703704 | 50.045 |
| 0.5063194444444444 | 50.045 |
| 0.5063310185185185 | 50.044 |
| 0.5063425925925926 | 50.044 |
| 0.5063541666666667 | 50.042 |
| 0.5063657407407408 | 50.045 |
| 0.5063773148148148 | 50.054 |
| 0.5063888888888889 | 50.06 |
| 0.5064004629629629 | 50.059 |
| 0.506412037037037 | 50.06 |
| 0.5064236111111111 | 50.057 |
| 0.5064351851851852 | 50.053 |
| 0.5064467592592593 | 50.05 |
| 0.5064583333333333 | 50.051 |
| 0.5064699074074074 | 50.053 |
| 0.5064814814814814 | 50.055 |
| 0.5064930555555556 | 50.055 |
| 0.5065046296296296 | 50.059 |
| 0.5065162037037038 | 50.061 |
| 0.5065277777777778 | 50.06 |
| 0.5065393518518518 | 50.058 |
| 0.5065509259259259 | 50.057 |
| 0.5065625 | 50.057 |
| 0.5065740740740741 | 50.056 |
| 0.5065856481481482 | 50.055 |
| 0.5065972222222223 | 50.054 |
| 0.5066087962962963 | 50.051 |
| 0.5066203703703703 | 50.049 |
| 0.5066319444444445 | 50.053 |
| 0.5066435185185185 | 50.057 |
| 0.5066550925925926 | 50.056 |
| 0.5066666666666667 | 50.055 |
| 0.5066782407407407 | 50.055 |
| 0.5066898148148148 | 50.057 |
| 0.5067013888888888 | 50.057 |
| 0.506712962962963 | 50.056 |
| 0.506724537037037 | 50.056 |
| 0.5067361111111112 | 50.059 |
| 0.5067476851851852 | 50.061 |
| 0.5067592592592592 | 50.063 |
| 0.5067708333333333 | 50.063 |
| 0.5067824074074074 | 50.062 |
| 0.5067939814814815 | 50.058 |
| 0.5068055555555556 | 50.052 |
| 0.5068171296296297 | 50.049 |
| 0.5068287037037037 | 50.045 |
| 0.5068402777777777 | 50.045 |
| 0.5068518518518519 | 50.048 |
| 0.5068634259259259 | 50.053 |
| 0.506875 | 50.058 |
| 0.5068865740740741 | 50.062 |
| 0.5068981481481482 | 50.056 |
| 0.5069097222222222 | 50.054 |
| 0.5069212962962962 | 50.05 |
| 0.5069328703703704 | 50.046 |
| 0.5069444444444444 | 50.049 |
| 0.5069560185185186 | 50.049 |
| 0.5069675925925926 | 50.051 |
| 0.5069791666666666 | 50.052 |
| 0.5069907407407407 | 50.055 |
| 0.5070023148148148 | 50.058 |
| 0.5070138888888889 | 50.055 |
| 0.507025462962963 | 50.047 |
| 0.5070370370370371 | 50.044 |
| 0.5070486111111111 | 50.042 |
| 0.5070601851851851 | 50.045 |
| 0.5070717592592593 | 50.046 |
| 0.5070833333333333 | 50.046 |
| 0.5070949074074075 | 50.048 |
| 0.5071064814814815 | 50.05 |
| 0.5071180555555556 | 50.049 |
| 0.5071296296296296 | 50.05 |
| 0.5071412037037036 | 50.046 |
| 0.5071527777777778 | 50.045 |
| 0.5071643518518518 | 50.039 |
| 0.507175925925926 | 50.04 |
| 0.5071875 | 50.036 |
| 0.507199074074074 | 50.033 |
| 0.5072106481481481 | 50.031 |
| 0.5072222222222222 | 50.029 |
| 0.5072337962962963 | 50.029 |
| 0.5072453703703704 | 50.031 |
| 0.5072569444444445 | 50.035 |
| 0.5072685185185185 | 50.039 |
| 0.5072800925925925 | 50.041 |
| 0.5072916666666667 | 50.043 |
| 0.5073032407407407 | 50.046 |
| 0.5073148148148149 | 50.053 |
| 0.5073263888888889 | 50.056 |
| 0.507337962962963 | 50.055 |
| 0.507349537037037 | 50.056 |
| 0.507361111111111 | 50.06 |
| 0.5073726851851852 | 50.061 |
| 0.5073842592592592 | 50.061 |
| 0.5073958333333334 | 50.062 |
| 0.5074074074074074 | 50.065 |
| 0.5074189814814815 | 50.066 |
| 0.5074305555555555 | 50.065 |
| 0.5074421296296296 | 50.062 |
| 0.5074537037037037 | 50.062 |
| 0.5074652777777778 | 50.057 |
| 0.5074768518518519 | 50.053 |
| 0.5074884259259259 | 50.053 |
| 0.5075 | 50.054 |
| 0.5075115740740741 | 50.054 |
| 0.5075231481481481 | 50.05 |
| 0.5075347222222223 | 50.045 |
| 0.5075462962962963 | 50.039 |
| 0.5075578703703704 | 50.034 |
| 0.5075694444444444 | 50.031 |
| 0.5075810185185184 | 50.029 |
| 0.5075925925925926 | 50.026 |
| 0.5076041666666666 | 50.023 |
| 0.5076157407407408 | 50.019 |
| 0.5076273148148148 | 50.02 |
| 0.5076388888888889 | 50.022 |
| 0.5076504629629629 | 50.024 |
| 0.507662037037037 | 50.027 |
| 0.5076736111111111 | 50.029 |
| 0.5076851851851852 | 50.029 |
| 0.5076967592592593 | 50.03 |
| 0.5077083333333333 | 50.032 |
| 0.5077199074074074 | 50.031 |
| 0.5077314814814815 | 50.034 |
| 0.5077430555555555 | 50.034 |
| 0.5077546296296297 | 50.036 |
| 0.5077662037037037 | 50.039 |
| 0.5077777777777778 | 50.036 |
| 0.5077893518518518 | 50.035 |
| 0.507800925925926 | 50.035 |
| 0.5078125 | 50.038 |
| 0.507824074074074 | 50.034 |
| 0.5078356481481482 | 50.033 |
| 0.5078472222222222 | 50.034 |
| 0.5078587962962963 | 50.033 |
| 0.5078703703703703 | 50.033 |
| 0.5078819444444445 | 50.031 |
| 0.5078935185185185 | 50.032 |
| 0.5079050925925926 | 50.032 |
| 0.5079166666666667 | 50.034 |
| 0.5079282407407407 | 50.037 |
| 0.5079398148148148 | 50.044 |
| 0.5079513888888889 | 50.049 |
| 0.507962962962963 | 50.051 |
| 0.5079745370370371 | 50.051 |
| 0.5079861111111111 | 50.053 |
| 0.5079976851851852 | 50.054 |
| 0.5080092592592592 | 50.055 |
| 0.5080208333333334 | 50.054 |
| 0.5080324074074074 | 50.053 |
| 0.5080439814814816 | 50.05 |
| 0.5080555555555556 | 50.048 |
| 0.5080671296296296 | 50.05 |
| 0.5080787037037037 | 50.048 |
| 0.5080902777777777 | 50.047 |
| 0.5081018518518519 | 50.043 |
| 0.5081134259259259 | 50.044 |
| 0.508125 | 50.047 |
| 0.5081365740740741 | 50.048 |
| 0.5081481481481481 | 50.047 |
| 0.5081597222222222 | 50.049 |
| 0.5081712962962963 | 50.05 |
| 0.5081828703703704 | 50.051 |
| 0.5081944444444445 | 50.048 |
| 0.5082060185185185 | 50.049 |
| 0.5082175925925926 | 50.049 |
| 0.5082291666666666 | 50.045 |
| 0.5082407407407408 | 50.04 |
| 0.5082523148148148 | 50.04 |
| 0.508263888888889 | 50.043 |
| 0.508275462962963 | 50.043 |
| 0.508287037037037 | 50.041 |
| 0.5082986111111111 | 50.042 |
| 0.5083101851851851 | 50.039 |
| 0.5083217592592593 | 50.035 |
| 0.5083333333333333 | 50.028 |
| 0.5083449074074075 | 50.025 |
| 0.5083564814814815 | 50.021 |
| 0.5083680555555555 | 50.018 |
| 0.5083796296296296 | 50.019 |
| 0.5083912037037037 | 50.022 |
| 0.5084027777777778 | 50.021 |
| 0.5084143518518519 | 50.022 |
| 0.508425925925926 | 50.024 |
| 0.5084375 | 50.027 |
| 0.508449074074074 | 50.027 |
| 0.5084606481481482 | 50.022 |
| 0.5084722222222222 | 50.013 |
| 0.5084837962962964 | 50.009 |
| 0.5084953703703704 | 50.004 |
| 0.5085069444444444 | 50.002 |
| 0.5085185185185185 | 50.001 |
| 0.5085300925925925 | 50.005 |
| 0.5085416666666667 | 50.005 |
| 0.5085532407407407 | 50.008 |
| 0.5085648148148149 | 50.017 |
| 0.5085763888888889 | 50.022 |
| 0.5085879629629629 | 50.023 |
| 0.508599537037037 | 50.024 |
| 0.5086111111111111 | 50.026 |
| 0.5086226851851852 | 50.027 |
| 0.5086342592592593 | 50.028 |
| 0.5086458333333334 | 50.026 |
| 0.5086574074074074 | 50.024 |
| 0.5086689814814814 | 50.022 |
| 0.5086805555555556 | 50.02 |
| 0.5086921296296296 | 50.017 |
| 0.5087037037037038 | 50.02 |
| 0.5087152777777778 | 50.019 |
| 0.5087268518518518 | 50.019 |
| 0.5087384259259259 | 50.019 |
| 0.50875 | 50.017 |
| 0.5087615740740741 | 50.018 |
| 0.5087731481481481 | 50.017 |
| 0.5087847222222223 | 50.016 |
| 0.5087962962962963 | 50.016 |
| 0.5088078703703703 | 50.014 |
| 0.5088194444444444 | 50.01 |
| 0.5088310185185185 | 50.012 |
| 0.5088425925925926 | 50.014 |
| 0.5088541666666667 | 50.013 |
| 0.5088657407407408 | 50.014 |
| 0.5088773148148148 | 50.016 |
| 0.5088888888888888 | 50.019 |
| 0.508900462962963 | 50.021 |
| 0.508912037037037 | 50.017 |
| 0.5089236111111112 | 50.017 |
| 0.5089351851851852 | 50.02 |
| 0.5089467592592593 | 50.023 |
| 0.5089583333333333 | 50.025 |
| 0.5089699074074074 | 50.029 |
| 0.5089814814814815 | 50.033 |
| 0.5089930555555555 | 50.035 |
| 0.5090046296296297 | 50.034 |
| 0.5090162037037037 | 50.036 |
| 0.5090277777777777 | 50.034 |
| 0.5090393518518518 | 50.031 |
| 0.5090509259259259 | 50.026 |
| 0.5090625 | 50.027 |
| 0.5090740740740741 | 50.028 |
| 0.5090856481481482 | 50.029 |
| 0.5090972222222222 | 50.029 |
| 0.5091087962962962 | 50.03 |
| 0.5091203703703704 | 50.031 |
| 0.5091319444444444 | 50.033 |
| 0.5091435185185186 | 50.033 |
| 0.5091550925925926 | 50.034 |
| 0.5091666666666667 | 50.033 |
| 0.5091782407407407 | 50.03 |
| 0.5091898148148148 | 50.028 |
| 0.5092013888888889 | 50.028 |
| 0.509212962962963 | 50.026 |
| 0.5092245370370371 | 50.026 |
| 0.5092361111111111 | 50.029 |
| 0.5092476851851852 | 50.029 |
| 0.5092592592592592 | 50.027 |
| 0.5092708333333333 | 50.022 |
| 0.5092824074074074 | 50.017 |
| 0.5092939814814815 | 50.014 |
| 0.5093055555555556 | 50.012 |
| 0.5093171296296296 | 50.01 |
| 0.5093287037037036 | 50.012 |
| 0.5093402777777778 | 50.017 |
| 0.5093518518518518 | 50.017 |
| 0.509363425925926 | 50.017 |
| 0.509375 | 50.019 |
| 0.5093865740740741 | 50.018 |
| 0.5093981481481481 | 50.018 |
| 0.5094097222222222 | 50.019 |
| 0.5094212962962963 | 50.018 |
| 0.5094328703703704 | 50.02 |
| 0.5094444444444445 | 50.016 |
| 0.5094560185185185 | 50.014 |
| 0.5094675925925926 | 50.013 |
| 0.5094791666666666 | 50.012 |
| 0.5094907407407407 | 50.012 |
| 0.5095023148148148 | 50.013 |
| 0.5095138888888889 | 50.015 |
| 0.509525462962963 | 50.017 |
| 0.509537037037037 | 50.016 |
| 0.509548611111111 | 50.013 |
| 0.5095601851851852 | 50.01 |
| 0.5095717592592592 | 50.006 |
| 0.5095833333333334 | 50.002 |
| 0.5095949074074074 | 50.004 |
| 0.5096064814814815 | 50.003 |
| 0.5096180555555555 | 50.003 |
| 0.5096296296296297 | 50 |
| 0.5096412037037037 | 50.001 |
| 0.5096527777777778 | 50.002 |
| 0.5096643518518519 | 50.001 |
| 0.5096759259259259 | 50.003 |
| 0.5096875 | 50.006 |
| 0.5096990740740741 | 50.006 |
| 0.5097106481481481 | 50.008 |
| 0.5097222222222222 | 50.011 |
| 0.5097337962962963 | 50.013 |
| 0.5097453703703704 | 50.008 |
| 0.5097569444444444 | 50.003 |
| 0.5097685185185185 | 50.004 |
| 0.5097800925925926 | 50.005 |
| 0.5097916666666666 | 50.006 |
| 0.5098032407407408 | 50.008 |
| 0.5098148148148148 | 50.012 |
| 0.5098263888888889 | 50.016 |
| 0.5098379629629629 | 50.017 |
| 0.5098495370370371 | 50.017 |
| 0.5098611111111111 | 50.017 |
| 0.5098726851851852 | 50.02 |
| 0.5098842592592593 | 50.019 |
| 0.5098958333333333 | 50.019 |
| 0.5099074074074074 | 50.021 |
| 0.5099189814814815 | 50.022 |
| 0.5099305555555556 | 50.018 |
| 0.5099421296296297 | 50.017 |
| 0.5099537037037037 | 50.019 |
| 0.5099652777777778 | 50.025 |
| 0.5099768518518518 | 50.027 |
| 0.5099884259259259 | 50.029 |
| 0.51 | 50.027 |
| 0.510011574074074 | 50.03 |
| 0.5100231481481482 | 50.03 |
| 0.5100347222222222 | 50.027 |
| 0.5100462962962963 | 50.027 |
| 0.5100578703703703 | 50.028 |
| 0.5100694444444445 | 50.033 |
| 0.5100810185185185 | 50.029 |
| 0.5100925925925927 | 50.026 |
| 0.5101041666666667 | 50.02 |
| 0.5101157407407407 | 50.015 |
| 0.5101273148148148 | 50.011 |
| 0.5101388888888889 | 50.013 |
| 0.510150462962963 | 50.018 |
| 0.5101620370370371 | 50.02 |
| 0.5101736111111111 | 50.022 |
| 0.5101851851851852 | 50.023 |
| 0.5101967592592592 | 50.023 |
| 0.5102083333333333 | 50.024 |
| 0.5102199074074074 | 50.022 |
| 0.5102314814814815 | 50.025 |
| 0.5102430555555556 | 50.021 |
| 0.5102546296296296 | 50.018 |
| 0.5102662037037037 | 50.02 |
| 0.5102777777777777 | 50.015 |
| 0.5102893518518519 | 50.015 |
| 0.5103009259259259 | 50.016 |
| 0.5103125000000001 | 50.011 |
| 0.5103240740740741 | 50.012 |
| 0.5103356481481481 | 50.01 |
| 0.5103472222222222 | 50.005 |
| 0.5103587962962963 | 50.009 |
| 0.5103703703703704 | 50.016 |
| 0.5103819444444445 | 50.016 |
| 0.5103935185185186 | 50.014 |
| 0.5104050925925926 | 50.015 |
| 0.5104166666666666 | 50.011 |
| 0.5104282407407407 | 50.007 |
| 0.5104398148148148 | 50.008 |
| 0.5104513888888889 | 50.01 |
| 0.510462962962963 | 50.008 |
| 0.510474537037037 | 50.006 |
| 0.5104861111111111 | 50.009 |
| 0.5104976851851851 | 50.008 |
| 0.5105092592592593 | 50.008 |
| 0.5105208333333333 | 50.004 |
| 0.5105324074074075 | 50.003 |
| 0.5105439814814815 | 50 |
| 0.5105555555555555 | 50 |
| 0.5105671296296296 | 49.993 |
| 0.5105787037037037 | 49.986 |
| 0.5105902777777778 | 49.986 |
| 0.5106018518518519 | 49.98 |
| 0.510613425925926 | 49.981 |
| 0.510625 | 49.986 |
| 0.510636574074074 | 49.986 |
| 0.5106481481481482 | 49.986 |
| 0.5106597222222222 | 49.989 |
| 0.5106712962962963 | 49.992 |
| 0.5106828703703704 | 49.995 |
| 0.5106944444444445 | 49.992 |
| 0.5107060185185185 | 49.991 |
| 0.5107175925925925 | 49.992 |
| 0.5107291666666667 | 49.993 |
| 0.5107407407407407 | 49.99 |
| 0.5107523148148149 | 49.987 |
| 0.5107638888888889 | 49.987 |
| 0.510775462962963 | 49.987 |
| 0.510787037037037 | 49.982 |
| 0.5107986111111111 | 49.98 |
| 0.5108101851851852 | 49.981 |
| 0.5108217592592593 | 49.982 |
| 0.5108333333333334 | 49.975 |
| 0.5108449074074074 | 49.971 |
| 0.5108564814814814 | 49.974 |
| 0.5108680555555556 | 49.977 |
| 0.5108796296296296 | 49.983 |
| 0.5108912037037037 | 49.985 |
| 0.5109027777777778 | 49.988 |
| 0.5109143518518519 | 49.988 |
| 0.5109259259259259 | 49.987 |
| 0.5109374999999999 | 49.988 |
| 0.5109490740740741 | 49.989 |
| 0.5109606481481481 | 49.984 |
| 0.5109722222222223 | 49.982 |
| 0.5109837962962963 | 49.978 |
| 0.5109953703703703 | 49.973 |
| 0.5110069444444444 | 49.975 |
| 0.5110185185185185 | 49.975 |
| 0.5110300925925926 | 49.981 |
| 0.5110416666666667 | 49.983 |
| 0.5110532407407408 | 49.979 |
| 0.5110648148148148 | 49.974 |
| 0.5110763888888888 | 49.976 |
| 0.511087962962963 | 49.982 |
| 0.511099537037037 | 49.984 |
| 0.5111111111111112 | 49.981 |
| 0.5111226851851852 | 49.983 |
| 0.5111342592592593 | 49.982 |
| 0.5111458333333333 | 49.981 |
| 0.5111574074074073 | 49.985 |
| 0.5111689814814815 | 49.99 |
| 0.5111805555555555 | 49.994 |
| 0.5111921296296297 | 50.004 |
| 0.5112037037037037 | 50.009 |
| 0.5112152777777778 | 50.017 |
| 0.5112268518518518 | 50.026 |
| 0.5112384259259259 | 50.025 |
| 0.51125 | 50.028 |
| 0.5112615740740741 | 50.025 |
| 0.5112731481481482 | 50.02 |
| 0.5112847222222222 | 50.016 |
| 0.5112962962962962 | 50.007 |
| 0.5113078703703704 | 50.012 |
| 0.5113194444444444 | 50.008 |
| 0.5113310185185186 | 50.01 |
| 0.5113425925925926 | 50.011 |
| 0.5113541666666667 | 50.011 |
| 0.5113657407407407 | 50.009 |
| 0.5113773148148147 | 50.007 |
| 0.5113888888888889 | 50.006 |
| 0.5114004629629629 | 50.006 |
| 0.5114120370370371 | 50.004 |
| 0.5114236111111111 | 50.001 |
| 0.5114351851851852 | 50.008 |
| 0.5114467592592592 | 50.012 |
| 0.5114583333333333 | 50.02 |
| 0.5114699074074074 | 50.022 |
| 0.5114814814814815 | 50.026 |
| 0.5114930555555556 | 50.028 |
| 0.5115046296296296 | 50.028 |
| 0.5115162037037037 | 50.027 |
| 0.5115277777777778 | 50.025 |
| 0.5115393518518518 | 50.028 |
| 0.511550925925926 | 50.026 |
| 0.5115625 | 50.024 |
| 0.5115740740740741 | 50.021 |
| 0.5115856481481481 | 50.025 |
| 0.5115972222222221 | 50.021 |
| 0.5116087962962963 | 50.022 |
| 0.5116203703703703 | 50.023 |
| 0.5116319444444445 | 50.022 |
| 0.5116435185185185 | 50.024 |
| 0.5116550925925926 | 50.023 |
| 0.5116666666666666 | 50.023 |
| 0.5116782407407408 | 50.025 |
| 0.5116898148148148 | 50.022 |
| 0.5117013888888889 | 50.018 |
| 0.511712962962963 | 50.019 |
| 0.511724537037037 | 50.02 |
| 0.5117361111111111 | 50.019 |
| 0.5117476851851852 | 50.018 |
| 0.5117592592592592 | 50.02 |
| 0.5117708333333334 | 50.025 |
| 0.5117824074074074 | 50.021 |
| 0.5117939814814815 | 50.025 |
| 0.5118055555555555 | 50.027 |
| 0.5118171296296297 | 50.024 |
| 0.5118287037037037 | 50.017 |
| 0.5118402777777779 | 50.017 |
| 0.5118518518518519 | 50.022 |
| 0.5118634259259259 | 50.023 |
| 0.511875 | 50.021 |
| 0.511886574074074 | 50.017 |
| 0.5118981481481482 | 50.017 |
| 0.5119097222222222 | 50.013 |
| 0.5119212962962963 | 50.013 |
| 0.5119328703703704 | 50.013 |
| 0.5119444444444444 | 50.014 |
| 0.5119560185185185 | 50.012 |
| 0.5119675925925926 | 50.01 |
| 0.5119791666666667 | 50.014 |
| 0.5119907407407408 | 50.014 |
| 0.5120023148148148 | 50.011 |
| 0.5120138888888889 | 50.01 |
| 0.5120254629629629 | 50.007 |
| 0.5120370370370371 | 50.006 |
| 0.5120486111111111 | 50 |
| 0.5120601851851853 | 49.998 |
| 0.5120717592592593 | 49.999 |
| 0.5120833333333333 | 50 |
| 0.5120949074074074 | 49.996 |
| 0.5121064814814814 | 49.994 |
| 0.5121180555555556 | 49.996 |
| 0.5121296296296296 | 49.992 |
| 0.5121412037037038 | 49.993 |
| 0.5121527777777778 | 49.99 |
| 0.5121643518518518 | 49.987 |
| 0.5121759259259259 | 49.989 |
| 0.5121875 | 49.988 |
| 0.5121990740740741 | 49.99 |
| 0.5122106481481482 | 49.994 |
| 0.5122222222222222 | 49.995 |
| 0.5122337962962963 | 49.997 |
| 0.5122453703703703 | 49.999 |
| 0.5122569444444445 | 50.002 |
| 0.5122685185185185 | 50.012 |
| 0.5122800925925927 | 50.019 |
| 0.5122916666666667 | 50.028 |
| 0.5123032407407407 | 50.028 |
| 0.5123148148148148 | 50.023 |
| 0.5123263888888888 | 50.022 |
| 0.512337962962963 | 50.032 |
| 0.512349537037037 | 50.036 |
| 0.5123611111111112 | 50.036 |
| 0.5123726851851852 | 50.036 |
| 0.5123842592592592 | 50.032 |
| 0.5123958333333333 | 50.032 |
| 0.5124074074074074 | 50.032 |
| 0.5124189814814815 | 50.032 |
| 0.5124305555555556 | 50.036 |
| 0.5124421296296297 | 50.04 |
| 0.5124537037037037 | 50.039 |
| 0.5124652777777777 | 50.041 |
| 0.5124768518518519 | 50.037 |
| 0.5124884259259259 | 50.03 |
| 0.5125000000000001 | 50.027 |
| 0.5125115740740741 | 50.018 |
| 0.5125231481481481 | 50.022 |
| 0.5125347222222222 | 50.029 |
| 0.5125462962962963 | 50.025 |
| 0.5125578703703704 | 50.027 |
| 0.5125694444444444 | 50.03 |
| 0.5125810185185186 | 50.025 |
| 0.5125925925925926 | 50.019 |
| 0.5126041666666666 | 50.018 |
| 0.5126157407407407 | 50.024 |
| 0.5126273148148148 | 50.025 |
| 0.5126388888888889 | 50.024 |
| 0.512650462962963 | 50.026 |
| 0.512662037037037 | 50.03 |
| 0.5126736111111111 | 50.03 |
| 0.5126851851851851 | 50.021 |
| 0.5126967592592593 | 50.016 |
| 0.5127083333333333 | 50.012 |
| 0.5127199074074075 | 50.012 |
| 0.5127314814814815 | 50.01 |
| 0.5127430555555555 | 50.01 |
| 0.5127546296296296 | 50.008 |
| 0.5127662037037037 | 50.011 |
| 0.5127777777777778 | 50.021 |
| 0.5127893518518518 | 50.027 |
| 0.512800925925926 | 50.026 |
| 0.5128125 | 50.022 |
| 0.512824074074074 | 50.025 |
| 0.5128356481481481 | 50.026 |
| 0.5128472222222222 | 50.025 |
| 0.5128587962962963 | 50.022 |
| 0.5128703703703704 | 50.022 |
| 0.5128819444444445 | 50.027 |
| 0.5128935185185185 | 50.025 |
| 0.5129050925925925 | 50.025 |
| 0.5129166666666667 | 50.028 |
| 0.5129282407407407 | 50.027 |
| 0.5129398148148149 | 50.025 |
| 0.5129513888888889 | 50.026 |
| 0.512962962962963 | 50.023 |
| 0.512974537037037 | 50.02 |
| 0.5129861111111111 | 50.021 |
| 0.5129976851851852 | 50.023 |
| 0.5130092592592593 | 50.022 |
| 0.5130208333333334 | 50.022 |
| 0.5130324074074074 | 50.024 |
| 0.5130439814814814 | 50.026 |
| 0.5130555555555555 | 50.032 |
| 0.5130671296296296 | 50.039 |
| 0.5130787037037037 | 50.039 |
| 0.5130902777777778 | 50.039 |
| 0.5131018518518519 | 50.039 |
| 0.5131134259259259 | 50.037 |
| 0.5131249999999999 | 50.032 |
| 0.5131365740740741 | 50.035 |
| 0.5131481481481481 | 50.033 |
| 0.5131597222222223 | 50.035 |
| 0.5131712962962963 | 50.03 |
| 0.5131828703703704 | 50.032 |
| 0.5131944444444444 | 50.03 |
| 0.5132060185185185 | 50.024 |
| 0.5132175925925926 | 50.027 |
| 0.5132291666666667 | 50.026 |
| 0.5132407407407408 | 50.026 |
| 0.5132523148148148 | 50.024 |
| 0.5132638888888889 | 50.02 |
| 0.5132754629629629 | 50.016 |
| 0.513287037037037 | 50.017 |
| 0.5132986111111111 | 50.017 |
| 0.5133101851851852 | 50.018 |
| 0.5133217592592593 | 50.021 |
| 0.5133333333333333 | 50.02 |
| 0.5133449074074073 | 50.021 |
| 0.5133564814814815 | 50.026 |
| 0.5133680555555555 | 50.025 |
| 0.5133796296296297 | 50.028 |
| 0.5133912037037037 | 50.026 |
| 0.5134027777777778 | 50.028 |
| 0.5134143518518518 | 50.027 |
| 0.513425925925926 | 50.03 |
| 0.5134375 | 50.031 |
| 0.5134490740740741 | 50.033 |
| 0.5134606481481482 | 50.034 |
| 0.5134722222222222 | 50.035 |
| 0.5134837962962963 | 50.03 |
| 0.5134953703703703 | 50.032 |
| 0.5135069444444444 | 50.031 |
| 0.5135185185185185 | 50.027 |
| 0.5135300925925926 | 50.028 |
| 0.5135416666666667 | 50.029 |
| 0.5135532407407407 | 50.031 |
| 0.5135648148148148 | 50.027 |
| 0.5135763888888889 | 50.028 |
| 0.5135879629629629 | 50.026 |
| 0.5135995370370371 | 50.02 |
| 0.5136111111111111 | 50.019 |
| 0.5136226851851852 | 50.023 |
| 0.5136342592592592 | 50.026 |
| 0.5136458333333334 | 50.032 |
| 0.5136574074074074 | 50.03 |
| 0.5136689814814815 | 50.033 |
| 0.5136805555555556 | 50.034 |
| 0.5136921296296296 | 50.036 |
| 0.5137037037037037 | 50.043 |
| 0.5137152777777778 | 50.045 |
| 0.5137268518518519 | 50.046 |
| 0.513738425925926 | 50.044 |
| 0.51375 | 50.039 |
| 0.5137615740740741 | 50.039 |
| 0.5137731481481481 | 50.041 |
| 0.5137847222222222 | 50.04 |
| 0.5137962962962963 | 50.04 |
| 0.5138078703703703 | 50.036 |
| 0.5138194444444445 | 50.039 |
| 0.5138310185185185 | 50.042 |
| 0.5138425925925926 | 50.04 |
| 0.5138541666666666 | 50.043 |
| 0.5138657407407408 | 50.046 |
| 0.5138773148148148 | 50.05 |
| 0.513888888888889 | 50.052 |
| 0.513900462962963 | 50.048 |
| 0.513912037037037 | 50.048 |
| 0.5139236111111111 | 50.048 |
| 0.5139351851851852 | 50.046 |
| 0.5139467592592593 | 50.046 |
| 0.5139583333333334 | 50.046 |
| 0.5139699074074074 | 50.044 |
| 0.5139814814814815 | 50.044 |
| 0.5139930555555555 | 50.045 |
| 0.5140046296296296 | 50.045 |
| 0.5140162037037037 | 50.042 |
| 0.5140277777777778 | 50.044 |
| 0.5140393518518519 | 50.041 |
| 0.5140509259259259 | 50.041 |
| 0.5140625 | 50.037 |
| 0.514074074074074 | 50.034 |
| 0.5140856481481482 | 50.034 |
| 0.5140972222222222 | 50.034 |
| 0.5141087962962964 | 50.035 |
| 0.5141203703703704 | 50.033 |
| 0.5141319444444444 | 50.034 |
| 0.5141435185185185 | 50.034 |
| 0.5141550925925926 | 50.035 |
| 0.5141666666666667 | 50.032 |
| 0.5141782407407408 | 50.033 |
| 0.5141898148148148 | 50.036 |
| 0.5142013888888889 | 50.031 |
| 0.5142129629629629 | 50.033 |
| 0.514224537037037 | 50.036 |
| 0.5142361111111111 | 50.035 |
| 0.5142476851851852 | 50.029 |
| 0.5142592592592593 | 50.03 |
| 0.5142708333333333 | 50.026 |
| 0.5142824074074074 | 50.016 |
| 0.5142939814814814 | 50.013 |
| 0.5143055555555556 | 50.012 |
| 0.5143171296296296 | 50.009 |
| 0.5143287037037038 | 50.006 |
| 0.5143402777777778 | 50.004 |
| 0.5143518518518518 | 50.001 |
| 0.5143634259259259 | 49.999 |
| 0.514375 | 49.996 |
| 0.5143865740740741 | 50 |
| 0.5143981481481482 | 50.003 |
| 0.5144097222222223 | 50.003 |
| 0.5144212962962963 | 49.999 |
| 0.5144328703703703 | 49.999 |
| 0.5144444444444445 | 50.001 |
| 0.5144560185185185 | 50.004 |
| 0.5144675925925926 | 50.002 |
| 0.5144791666666667 | 50.003 |
| 0.5144907407407407 | 50.002 |
| 0.5145023148148148 | 50.002 |
| 0.5145138888888888 | 50.005 |
| 0.514525462962963 | 50.005 |
| 0.514537037037037 | 50.005 |
| 0.5145486111111112 | 50.006 |
| 0.5145601851851852 | 50.007 |
| 0.5145717592592592 | 50.009 |
| 0.5145833333333333 | 50.008 |
| 0.5145949074074074 | 49.994 |
| 0.5146064814814815 | 49.975 |
| 0.5146180555555556 | 49.956 |
| 0.5146296296296297 | 49.945 |
| 0.5146412037037037 | 49.935 |
| 0.5146527777777777 | 49.928 |
| 0.5146643518518519 | 49.926 |
| 0.5146759259259259 | 49.927 |
| 0.5146875 | 49.926 |
| 0.5146990740740741 | 49.923 |
| 0.5147106481481482 | 49.923 |
| 0.5147222222222222 | 49.924 |
| 0.5147337962962962 | 49.931 |
| 0.5147453703703704 | 49.931 |
| 0.5147569444444444 | 49.931 |
| 0.5147685185185186 | 49.933 |
| 0.5147800925925926 | 49.931 |
| 0.5147916666666666 | 49.93 |
| 0.5148032407407407 | 49.927 |
| 0.5148148148148148 | 49.931 |
| 0.5148263888888889 | 49.929 |
| 0.514837962962963 | 49.927 |
| 0.5148495370370371 | 49.925 |
| 0.5148611111111111 | 49.927 |
| 0.5148726851851851 | 49.92 |
| 0.5148842592592593 | 49.917 |
| 0.5148958333333333 | 49.919 |
| 0.5149074074074074 | 49.914 |
| 0.5149189814814815 | 49.911 |
| 0.5149305555555556 | 49.912 |
| 0.5149421296296296 | 49.912 |
| 0.5149537037037036 | 49.911 |
| 0.5149652777777778 | 49.908 |
| 0.5149768518518518 | 49.907 |
| 0.514988425925926 | 49.91 |
| 0.515 | 49.909 |
| 0.515011574074074 | 49.905 |
| 0.5150231481481481 | 49.907 |
| 0.5150347222222222 | 49.911 |
| 0.5150462962962963 | 49.912 |
| 0.5150578703703704 | 49.909 |
| 0.5150694444444445 | 49.908 |
| 0.5150810185185185 | 49.912 |
| 0.5150925925925925 | 49.91 |
| 0.5151041666666667 | 49.912 |
| 0.5151157407407407 | 49.915 |
| 0.5151273148148149 | 49.916 |
| 0.5151388888888889 | 49.913 |
| 0.515150462962963 | 49.91 |
| 0.515162037037037 | 49.907 |
| 0.515173611111111 | 49.905 |
| 0.5151851851851852 | 49.906 |
| 0.5151967592592592 | 49.91 |
| 0.5152083333333334 | 49.914 |
| 0.5152199074074074 | 49.917 |
| 0.5152314814814815 | 49.918 |
| 0.5152430555555555 | 49.918 |
| 0.5152546296296296 | 49.92 |
| 0.5152662037037037 | 49.919 |
| 0.5152777777777778 | 49.918 |
| 0.5152893518518519 | 49.916 |
| 0.5153009259259259 | 49.915 |
| 0.5153125 | 49.915 |
| 0.5153240740740741 | 49.913 |
| 0.5153356481481481 | 49.911 |
| 0.5153472222222223 | 49.914 |
| 0.5153587962962963 | 49.916 |
| 0.5153703703703704 | 49.916 |
| 0.5153819444444444 | 49.917 |
| 0.5153935185185184 | 49.923 |
| 0.5154050925925926 | 49.921 |
| 0.5154166666666666 | 49.922 |
| 0.5154282407407408 | 49.923 |
| 0.5154398148148148 | 49.925 |
| 0.5154513888888889 | 49.922 |
| 0.5154629629629629 | 49.921 |
| 0.515474537037037 | 49.921 |
| 0.5154861111111111 | 49.918 |
| 0.5154976851851852 | 49.915 |
| 0.5155092592592593 | 49.915 |
| 0.5155208333333333 | 49.918 |
| 0.5155324074074074 | 49.921 |
| 0.5155439814814815 | 49.922 |
| 0.5155555555555555 | 49.925 |
| 0.5155671296296297 | 49.927 |
| 0.5155787037037037 | 49.933 |
| 0.5155902777777778 | 49.929 |
| 0.5156018518518518 | 49.935 |
| 0.515613425925926 | 49.934 |
| 0.515625 | 49.938 |
| 0.515636574074074 | 49.937 |
| 0.5156481481481482 | 49.941 |
| 0.5156597222222222 | 49.943 |
| 0.5156712962962963 | 49.943 |
| 0.5156828703703703 | 49.939 |
| 0.5156944444444445 | 49.934 |
| 0.5157060185185185 | 49.932 |
| 0.5157175925925926 | 49.931 |
| 0.5157291666666667 | 49.931 |
| 0.5157407407407407 | 49.925 |
| 0.5157523148148148 | 49.922 |
| 0.5157638888888889 | 49.915 |
| 0.515775462962963 | 49.912 |
| 0.5157870370370371 | 49.915 |
| 0.5157986111111111 | 49.917 |
| 0.5158101851851852 | 49.919 |
| 0.5158217592592592 | 49.919 |
| 0.5158333333333334 | 49.92 |
| 0.5158449074074074 | 49.925 |
| 0.5158564814814816 | 49.926 |
| 0.5158680555555556 | 49.925 |
| 0.5158796296296296 | 49.927 |
| 0.5158912037037037 | 49.932 |
| 0.5159027777777777 | 49.931 |
| 0.5159143518518519 | 49.928 |
| 0.5159259259259259 | 49.931 |
| 0.5159375 | 49.935 |
| 0.5159490740740741 | 49.931 |
| 0.5159606481481481 | 49.928 |
| 0.5159722222222222 | 49.927 |
| 0.5159837962962963 | 49.923 |
| 0.5159953703703704 | 49.923 |
| 0.5160069444444445 | 49.922 |
| 0.5160185185185185 | 49.919 |
| 0.5160300925925926 | 49.921 |
| 0.5160416666666666 | 49.924 |
| 0.5160532407407408 | 49.925 |
| 0.5160648148148148 | 49.925 |
| 0.516076388888889 | 49.927 |
| 0.516087962962963 | 49.925 |
| 0.516099537037037 | 49.926 |
| 0.5161111111111111 | 49.927 |
| 0.5161226851851851 | 49.926 |
| 0.5161342592592593 | 49.923 |
| 0.5161458333333333 | 49.92 |
| 0.5161574074074075 | 49.922 |
| 0.5161689814814815 | 49.925 |
| 0.5161805555555555 | 49.924 |
| 0.5161921296296296 | 49.924 |
| 0.5162037037037037 | 49.924 |
| 0.5162152777777778 | 49.922 |
| 0.5162268518518519 | 49.921 |
| 0.516238425925926 | 49.922 |
| 0.51625 | 49.923 |
| 0.516261574074074 | 49.926 |
| 0.5162731481481482 | 49.926 |
| 0.5162847222222222 | 49.931 |
| 0.5162962962962964 | 49.932 |
| 0.5163078703703704 | 49.931 |
| 0.5163194444444444 | 49.932 |
| 0.5163310185185185 | 49.926 |
| 0.5163425925925926 | 49.926 |
| 0.5163541666666667 | 49.925 |
| 0.5163657407407407 | 49.927 |
| 0.5163773148148149 | 49.928 |
| 0.5163888888888889 | 49.929 |
| 0.5164004629629629 | 49.926 |
| 0.516412037037037 | 49.922 |
| 0.5164236111111111 | 49.919 |
| 0.5164351851851852 | 49.915 |
| 0.5164467592592593 | 49.915 |
| 0.5164583333333334 | 49.918 |
| 0.5164699074074074 | 49.921 |
| 0.5164814814814814 | 49.92 |
| 0.5164930555555556 | 49.922 |
| 0.5165046296296296 | 49.926 |
| 0.5165162037037038 | 49.935 |
| 0.5165277777777778 | 49.942 |
| 0.5165393518518518 | 49.948 |
| 0.5165509259259259 | 49.947 |
| 0.5165625 | 49.948 |
| 0.5165740740740741 | 49.948 |
| 0.5165856481481481 | 49.943 |
| 0.5165972222222223 | 49.944 |
| 0.5166087962962963 | 49.943 |
| 0.5166203703703703 | 49.935 |
| 0.5166319444444444 | 49.928 |
| 0.5166435185185185 | 49.925 |
| 0.5166550925925926 | 49.924 |
| 0.5166666666666667 | 49.926 |
| 0.5166782407407408 | 49.927 |
| 0.5166898148148148 | 49.927 |
| 0.5167013888888888 | 49.924 |
| 0.516712962962963 | 49.924 |
| 0.516724537037037 | 49.919 |
| 0.5167361111111112 | 49.924 |
| 0.5167476851851852 | 49.922 |
| 0.5167592592592593 | 49.927 |
| 0.5167708333333333 | 49.925 |
| 0.5167824074074074 | 49.93 |
| 0.5167939814814815 | 49.933 |
| 0.5168055555555555 | 49.93 |
| 0.5168171296296297 | 49.928 |
| 0.5168287037037037 | 49.927 |
| 0.5168402777777777 | 49.932 |
| 0.5168518518518518 | 49.933 |
| 0.5168634259259259 | 49.938 |
| 0.516875 | 49.941 |
| 0.5168865740740741 | 49.94 |
| 0.5168981481481482 | 49.942 |
| 0.5169097222222222 | 49.941 |
| 0.5169212962962962 | 49.945 |
| 0.5169328703703704 | 49.943 |
| 0.5169444444444444 | 49.948 |
| 0.5169560185185186 | 49.95 |
| 0.5169675925925926 | 49.957 |
| 0.5169791666666667 | 49.957 |
| 0.5169907407407407 | 49.958 |
| 0.5170023148148148 | 49.967 |
| 0.5170138888888889 | 49.969 |
| 0.517025462962963 | 49.971 |
| 0.5170370370370371 | 49.97 |
| 0.5170486111111111 | 49.97 |
| 0.5170601851851852 | 49.963 |
| 0.5170717592592592 | 49.959 |
| 0.5170833333333333 | 49.957 |
| 0.5170949074074074 | 49.958 |
| 0.5171064814814815 | 49.959 |
| 0.5171180555555556 | 49.961 |
| 0.5171296296296296 | 49.96 |
| 0.5171412037037036 | 49.962 |
| 0.5171527777777778 | 49.963 |
| 0.5171643518518518 | 49.962 |
| 0.517175925925926 | 49.964 |
| 0.5171875 | 49.961 |
| 0.5171990740740741 | 49.962 |
| 0.5172106481481481 | 49.962 |
| 0.5172222222222222 | 49.965 |
| 0.5172337962962963 | 49.97 |
| 0.5172453703703704 | 49.972 |
| 0.5172569444444445 | 49.971 |
| 0.5172685185185185 | 49.977 |
| 0.5172800925925926 | 49.981 |
| 0.5172916666666666 | 49.986 |
| 0.5173032407407407 | 49.985 |
| 0.5173148148148148 | 49.984 |
| 0.5173263888888889 | 49.986 |
| 0.517337962962963 | 49.985 |
| 0.517349537037037 | 49.981 |
| 0.517361111111111 | 49.981 |
| 0.5173726851851852 | 49.982 |
| 0.5173842592592592 | 49.981 |
| 0.5173958333333334 | 49.981 |
| 0.5174074074074074 | 49.983 |
| 0.5174189814814815 | 49.983 |
| 0.5174305555555555 | 49.986 |
| 0.5174421296296297 | 49.992 |
| 0.5174537037037037 | 49.999 |
| 0.5174652777777778 | 50.009 |
| 0.5174768518518519 | 50.019 |
| 0.5174884259259259 | 50.022 |
| 0.5175 | 50.026 |
| 0.517511574074074 | 50.031 |
| 0.5175231481481481 | 50.029 |
| 0.5175347222222222 | 50.031 |
| 0.5175462962962963 | 50.033 |
| 0.5175578703703704 | 50.028 |
| 0.5175694444444444 | 50.026 |
| 0.5175810185185185 | 50.028 |
| 0.5175925925925926 | 50.026 |
| 0.5176041666666666 | 50.021 |
| 0.5176157407407408 | 50.019 |
| 0.5176273148148148 | 50.018 |
| 0.5176388888888889 | 50.016 |
| 0.5176504629629629 | 50.011 |
| 0.5176620370370371 | 50.009 |
| 0.5176736111111111 | 50.008 |
| 0.5176851851851852 | 50.007 |
| 0.5176967592592593 | 50.003 |
| 0.5177083333333333 | 50.005 |
| 0.5177199074074074 | 50.005 |
| 0.5177314814814815 | 50.008 |
| 0.5177430555555556 | 50.006 |
| 0.5177546296296297 | 50.01 |
| 0.5177662037037037 | 50.009 |
| 0.5177777777777778 | 50.013 |
| 0.5177893518518518 | 50.015 |
| 0.5178009259259259 | 50.013 |
| 0.5178125 | 50.017 |
| 0.517824074074074 | 50.018 |
| 0.5178356481481482 | 50.015 |
| 0.5178472222222222 | 50.019 |
| 0.5178587962962963 | 50.017 |
| 0.5178703703703703 | 50.019 |
| 0.5178819444444445 | 50.016 |
| 0.5178935185185185 | 50.017 |
| 0.5179050925925927 | 50.014 |
| 0.5179166666666667 | 50.018 |
| 0.5179282407407407 | 50.012 |
| 0.5179398148148148 | 50.012 |
| 0.5179513888888889 | 50.013 |
| 0.517962962962963 | 50.012 |
| 0.5179745370370371 | 50.01 |
| 0.5179861111111111 | 50.007 |
| 0.5179976851851852 | 50.006 |
| 0.5180092592592592 | 50.002 |
| 0.5180208333333333 | 50.002 |
| 0.5180324074074074 | 49.997 |
| 0.5180439814814815 | 50 |
| 0.5180555555555556 | 49.994 |
| 0.5180671296296296 | 49.99 |
| 0.5180787037037037 | 49.984 |
| 0.5180902777777777 | 49.984 |
| 0.5181018518518519 | 49.982 |
| 0.5181134259259259 | 49.988 |
| 0.5181250000000001 | 49.988 |
| 0.5181365740740741 | 49.989 |
| 0.5181481481481481 | 49.989 |
| 0.5181597222222222 | 49.985 |
| 0.5181712962962963 | 49.98 |
| 0.5181828703703704 | 49.975 |
| 0.5181944444444445 | 49.968 |
| 0.5182060185185186 | 49.967 |
| 0.5182175925925926 | 49.969 |
| 0.5182291666666666 | 49.972 |
| 0.5182407407407407 | 49.975 |
| 0.5182523148148148 | 49.977 |
| 0.5182638888888889 | 49.98 |
| 0.518275462962963 | 49.98 |
| 0.518287037037037 | 49.978 |
| 0.5182986111111111 | 49.973 |
| 0.5183101851851851 | 49.973 |
| 0.5183217592592593 | 49.974 |
| 0.5183333333333333 | 49.973 |
| 0.5183449074074075 | 49.974 |
| 0.5183564814814815 | 49.98 |
| 0.5183680555555555 | 49.977 |
| 0.5183796296296296 | 49.978 |
| 0.5183912037037037 | 49.971 |
| 0.5184027777777778 | 49.973 |
| 0.5184143518518519 | 49.966 |
| 0.518425925925926 | 49.968 |
| 0.5184375 | 49.965 |
| 0.518449074074074 | 49.966 |
| 0.5184606481481482 | 49.965 |
| 0.5184722222222222 | 49.964 |
| 0.5184837962962963 | 49.97 |
| 0.5184953703703704 | 49.973 |
| 0.5185069444444445 | 49.971 |
| 0.5185185185185185 | 49.967 |
| 0.5185300925925925 | 49.966 |
| 0.5185416666666667 | 49.971 |
| 0.5185532407407407 | 49.972 |
| 0.5185648148148149 | 49.973 |
| 0.5185763888888889 | 49.97 |
| 0.518587962962963 | 49.968 |
| 0.518599537037037 | 49.967 |
| 0.5186111111111111 | 49.969 |
| 0.5186226851851852 | 49.973 |
| 0.5186342592592593 | 49.973 |
| 0.5186458333333334 | 49.972 |
| 0.5186574074074074 | 49.973 |
| 0.5186689814814814 | 49.974 |
| 0.5186805555555556 | 49.973 |
| 0.5186921296296296 | 49.971 |
| 0.5187037037037037 | 49.97 |
| 0.5187152777777778 | 49.972 |
| 0.5187268518518519 | 49.975 |
| 0.5187384259259259 | 49.978 |
| 0.5187499999999999 | 49.98 |
| 0.5187615740740741 | 49.978 |
| 0.5187731481481481 | 49.98 |
| 0.5187847222222223 | 49.979 |
| 0.5187962962962963 | 49.981 |
| 0.5188078703703703 | 49.984 |
| 0.5188194444444444 | 49.981 |
| 0.5188310185185185 | 49.98 |
| 0.5188425925925926 | 49.98 |
| 0.5188541666666667 | 49.983 |
| 0.5188657407407408 | 49.981 |
| 0.5188773148148148 | 49.982 |
| 0.5188888888888888 | 49.983 |
| 0.518900462962963 | 49.983 |
| 0.518912037037037 | 49.984 |
| 0.5189236111111112 | 49.988 |
| 0.5189351851851852 | 49.991 |
| 0.5189467592592593 | 49.994 |
| 0.5189583333333333 | 49.995 |
| 0.5189699074074073 | 49.995 |
| 0.5189814814814815 | 49.998 |
| 0.5189930555555555 | 49.998 |
| 0.5190046296296297 | 49.995 |
| 0.5190162037037037 | 49.993 |
| 0.5190277777777778 | 49.995 |
| 0.5190393518518518 | 49.994 |
| 0.5190509259259259 | 49.997 |
| 0.5190625 | 50.004 |
| 0.5190740740740741 | 50.011 |
| 0.5190856481481482 | 50.017 |
| 0.5190972222222222 | 50.019 |
| 0.5191087962962962 | 50.023 |
| 0.5191203703703704 | 50.026 |
| 0.5191319444444444 | 50.024 |
| 0.5191435185185186 | 50.024 |
| 0.5191550925925926 | 50.028 |
| 0.5191666666666667 | 50.028 |
| 0.5191782407407407 | 50.025 |
| 0.5191898148148147 | 50.024 |
| 0.5192013888888889 | 50.027 |
| 0.5192129629629629 | 50.028 |
| 0.5192245370370371 | 50.022 |
| 0.5192361111111111 | 50.018 |
| 0.5192476851851852 | 50.015 |
| 0.5192592592592592 | 50.011 |
| 0.5192708333333333 | 50.012 |
| 0.5192824074074074 | 50.011 |
| 0.5192939814814815 | 50.017 |
| 0.5193055555555556 | 50.021 |
| 0.5193171296296296 | 50.019 |
| 0.5193287037037037 | 50.02 |
| 0.5193402777777778 | 50.025 |
| 0.5193518518518518 | 50.027 |
| 0.519363425925926 | 50.021 |
| 0.519375 | 50.018 |
| 0.5193865740740741 | 50.017 |
| 0.5193981481481481 | 50.013 |
| 0.5194097222222221 | 50.015 |
| 0.5194212962962963 | 50.012 |
| 0.5194328703703703 | 50.017 |
| 0.5194444444444445 | 50.012 |
| 0.5194560185185185 | 50.011 |
| 0.5194675925925926 | 50.008 |
| 0.5194791666666666 | 50.002 |
| 0.5194907407407408 | 49.997 |
| 0.5195023148148148 | 49.996 |
| 0.5195138888888889 | 49.996 |
| 0.519525462962963 | 49.998 |
| 0.519537037037037 | 50 |
| 0.5195486111111111 | 50.002 |
| 0.5195601851851852 | 50.004 |
| 0.5195717592592592 | 49.999 |
| 0.5195833333333334 | 49.995 |
| 0.5195949074074074 | 49.992 |
| 0.5196064814814815 | 49.989 |
| 0.5196180555555555 | 49.985 |
| 0.5196296296296297 | 49.98 |
| 0.5196412037037037 | 49.979 |
| 0.5196527777777779 | 49.982 |
| 0.5196643518518519 | 49.985 |
| 0.5196759259259259 | 49.986 |
| 0.5196875 | 49.986 |
| 0.519699074074074 | 49.988 |
| 0.5197106481481482 | 49.99 |
| 0.5197222222222222 | 49.989 |
| 0.5197337962962963 | 49.986 |
| 0.5197453703703704 | 49.985 |
| 0.5197569444444444 | 49.982 |
| 0.5197685185185185 | 49.984 |
| 0.5197800925925926 | 49.99 |
| 0.5197916666666667 | 49.998 |
| 0.5198032407407408 | 50.005 |
| 0.5198148148148148 | 50.008 |
| 0.5198263888888889 | 50.011 |
| 0.5198379629629629 | 50.014 |
| 0.5198495370370371 | 50.01 |
| 0.5198611111111111 | 50.007 |
| 0.5198726851851853 | 50.003 |
| 0.5198842592592593 | 49.999 |
| 0.5198958333333333 | 49.995 |
| 0.5199074074074074 | 50 |
| 0.5199189814814814 | 50.008 |
| 0.5199305555555556 | 50.015 |
| 0.5199421296296296 | 50.016 |
| 0.5199537037037038 | 50.018 |
| 0.5199652777777778 | 50.023 |
| 0.5199768518518518 | 50.024 |
| 0.5199884259259259 | 50.023 |
| 0.52 | 50.026 |
| 0.5200115740740741 | 50.027 |
| 0.5200231481481482 | 50.024 |
| 0.5200347222222222 | 50.024 |
| 0.5200462962962963 | 50.026 |
| 0.5200578703703703 | 50.026 |
| 0.5200694444444445 | 50.028 |
| 0.5200810185185185 | 50.028 |
| 0.5200925925925927 | 50.032 |
| 0.5201041666666667 | 50.034 |
| 0.5201157407407407 | 50.035 |
| 0.5201273148148148 | 50.029 |
| 0.5201388888888888 | 50.026 |
| 0.520150462962963 | 50.019 |
| 0.520162037037037 | 50.013 |
| 0.5201736111111112 | 50.007 |
| 0.5201851851851852 | 50.006 |
| 0.5201967592592592 | 50.004 |
| 0.5202083333333333 | 50.007 |
| 0.5202199074074074 | 50.012 |
| 0.5202314814814815 | 50.017 |
| 0.5202430555555556 | 50.023 |
| 0.5202546296296297 | 50.024 |
| 0.5202662037037037 | 50.022 |
| 0.5202777777777777 | 50.021 |
| 0.5202893518518519 | 50.018 |
| 0.5203009259259259 | 50.017 |
| 0.5203125000000001 | 50.013 |
| 0.5203240740740741 | 50.014 |
| 0.5203356481481481 | 50.015 |
| 0.5203472222222222 | 50.015 |
| 0.5203587962962963 | 50.011 |
| 0.5203703703703704 | 50.014 |
| 0.5203819444444444 | 50.012 |
| 0.5203935185185186 | 50.01 |
| 0.5204050925925926 | 50.009 |
| 0.5204166666666666 | 50.006 |
| 0.5204282407407407 | 50.008 |
| 0.5204398148148148 | 50.007 |
| 0.5204513888888889 | 50.012 |
| 0.520462962962963 | 50.015 |
| 0.520474537037037 | 50.018 |
| 0.5204861111111111 | 50.021 |
| 0.5204976851851851 | 50.025 |
| 0.5205092592592593 | 50.028 |
| 0.5205208333333333 | 50.025 |
| 0.5205324074074075 | 50.023 |
| 0.5205439814814815 | 50.023 |
| 0.5205555555555555 | 50.025 |
| 0.5205671296296296 | 50.023 |
| 0.5205787037037037 | 50.02 |
| 0.5205902777777778 | 50.02 |
| 0.5206018518518518 | 50.019 |
| 0.520613425925926 | 50.019 |
| 0.520625 | 50.016 |
| 0.520636574074074 | 50.015 |
| 0.5206481481481481 | 50.019 |
| 0.5206597222222222 | 50.017 |
| 0.5206712962962963 | 50.02 |
| 0.5206828703703704 | 50.021 |
| 0.5206944444444445 | 50.022 |
| 0.5207060185185185 | 50.025 |
| 0.5207175925925925 | 50.026 |
| 0.5207291666666667 | 50.027 |
| 0.5207407407407407 | 50.028 |
| 0.5207523148148149 | 50.028 |
| 0.5207638888888889 | 50.027 |
| 0.520775462962963 | 50.032 |
| 0.520787037037037 | 50.032 |
| 0.5207986111111111 | 50.031 |
| 0.5208101851851852 | 50.028 |
| 0.5208217592592593 | 50.029 |
| 0.5208333333333334 | 50.024 |
| 0.5208449074074074 | 50.011 |
| 0.5208564814814814 | 49.997 |
| 0.5208680555555555 | 49.989 |
| 0.5208796296296296 | 49.986 |
| 0.5208912037037037 | 49.981 |
| 0.5209027777777778 | 49.984 |
| 0.5209143518518519 | 49.984 |
| 0.5209259259259259 | 49.987 |
| 0.5209374999999999 | 49.989 |
| 0.5209490740740741 | 49.995 |
| 0.5209606481481481 | 49.996 |
| 0.5209722222222223 | 49.995 |
| 0.5209837962962963 | 49.996 |
| 0.5209953703703704 | 50.005 |
| 0.5210069444444444 | 50.016 |
| 0.5210185185185185 | 50.021 |
| 0.5210300925925926 | 50.019 |
| 0.5210416666666667 | 50.02 |
| 0.5210532407407408 | 50.017 |
| 0.5210648148148148 | 50.014 |
| 0.5210763888888889 | 50.01 |
| 0.5210879629629629 | 50.006 |
| 0.521099537037037 | 50.002 |
| 0.5211111111111111 | 49.998 |
| 0.5211226851851852 | 49.997 |
| 0.5211342592592593 | 49.997 |
| 0.5211458333333333 | 49.999 |
| 0.5211574074074073 | 49.996 |
| 0.5211689814814815 | 49.988 |
| 0.5211805555555555 | 49.984 |
| 0.5211921296296297 | 49.978 |
| 0.5212037037037037 | 49.976 |
| 0.5212152777777778 | 49.979 |
| 0.5212268518518518 | 49.983 |
| 0.521238425925926 | 49.985 |
| 0.52125 | 49.985 |
| 0.5212615740740741 | 49.986 |
| 0.5212731481481482 | 49.989 |
| 0.5212847222222222 | 49.991 |
| 0.5212962962962963 | 49.992 |
| 0.5213078703703703 | 49.996 |
| 0.5213194444444444 | 49.996 |
| 0.5213310185185185 | 49.994 |
| 0.5213425925925926 | 49.992 |
| 0.5213541666666667 | 49.99 |
| 0.5213657407407407 | 49.991 |
| 0.5213773148148148 | 49.988 |
| 0.5213888888888889 | 49.983 |
| 0.5214004629629629 | 49.981 |
| 0.5214120370370371 | 49.977 |
| 0.5214236111111111 | 49.972 |
| 0.5214351851851852 | 49.976 |
| 0.5214467592592592 | 49.98 |
| 0.5214583333333334 | 49.987 |
| 0.5214699074074074 | 49.986 |
| 0.5214814814814815 | 49.995 |
| 0.5214930555555556 | 49.996 |
| 0.5215046296296296 | 50.001 |
| 0.5215162037037037 | 50.005 |
| 0.5215277777777778 | 50.012 |
| 0.5215393518518519 | 50.012 |
| 0.521550925925926 | 50.012 |
| 0.5215625 | 50.009 |
| 0.5215740740740741 | 50.012 |
| 0.5215856481481481 | 50.009 |
| 0.5215972222222222 | 50.013 |
| 0.5216087962962963 | 50.009 |
| 0.5216203703703703 | 50.009 |
| 0.5216319444444445 | 50.008 |
| 0.5216435185185185 | 50.008 |
| 0.5216550925925926 | 50.004 |
| 0.5216666666666666 | 50.007 |
| 0.5216782407407408 | 50.009 |
| 0.5216898148148148 | 50.011 |
| 0.521701388888889 | 50.015 |
| 0.521712962962963 | 50.019 |
| 0.521724537037037 | 50.021 |
| 0.5217361111111111 | 50.016 |
| 0.5217476851851852 | 50.012 |
| 0.5217592592592593 | 50.013 |
| 0.5217708333333334 | 50.009 |
| 0.5217824074074074 | 50.008 |
| 0.5217939814814815 | 50.012 |
| 0.5218055555555555 | 50.013 |
| 0.5218171296296296 | 50.011 |
| 0.5218287037037037 | 50.007 |
| 0.5218402777777778 | 50.005 |
| 0.5218518518518519 | 50.004 |
| 0.5218634259259259 | 49.999 |
| 0.521875 | 49.994 |
| 0.521886574074074 | 49.988 |
| 0.5218981481481482 | 49.984 |
| 0.5219097222222222 | 49.984 |
| 0.5219212962962964 | 49.988 |
| 0.5219328703703704 | 49.989 |
| 0.5219444444444444 | 49.991 |
| 0.5219560185185185 | 49.992 |
| 0.5219675925925926 | 49.991 |
| 0.5219791666666667 | 49.992 |
| 0.5219907407407408 | 49.994 |
| 0.5220023148148148 | 49.995 |
| 0.5220138888888889 | 49.994 |
| 0.5220254629629629 | 49.997 |
| 0.522037037037037 | 49.999 |
| 0.5220486111111111 | 50 |
| 0.5220601851851852 | 49.997 |
| 0.5220717592592593 | 49.994 |
| 0.5220833333333333 | 49.99 |
| 0.5220949074074074 | 49.987 |
| 0.5221064814814814 | 49.987 |
| 0.5221180555555556 | 49.988 |
| 0.5221296296296296 | 49.988 |
| 0.5221412037037038 | 49.985 |
| 0.5221527777777778 | 49.987 |
| 0.5221643518518518 | 49.992 |
| 0.5221759259259259 | 49.996 |
| 0.5221875 | 49.996 |
| 0.5221990740740741 | 49.998 |
| 0.5222106481481482 | 50.001 |
| 0.5222222222222223 | 50.002 |
| 0.5222337962962963 | 49.99 |
| 0.5222453703703703 | 49.999 |
| 0.5222569444444444 | 49.997 |
| 0.5222685185185185 | 50.001 |
| 0.5222800925925926 | 50.001 |
| 0.5222916666666667 | 50.005 |
| 0.5223032407407407 | 50.011 |
| 0.5223148148148148 | 50.011 |
| 0.5223263888888888 | 50.01 |
| 0.522337962962963 | 50.011 |
| 0.522349537037037 | 50.015 |
| 0.5223611111111112 | 50.013 |
| 0.5223726851851852 | 50.006 |
| 0.5223842592592592 | 50.007 |
| 0.5223958333333333 | 50.005 |
| 0.5224074074074074 | 50.002 |
| 0.5224189814814815 | 50.002 |
| 0.5224305555555556 | 50.001 |
| 0.5224421296296297 | 49.996 |
| 0.5224537037037037 | 49.995 |
| 0.5224652777777777 | 49.994 |
| 0.5224768518518519 | 49.993 |
| 0.5224884259259259 | 49.995 |
| 0.5225 | 49.994 |
| 0.5225115740740741 | 49.996 |
| 0.5225231481481482 | 50.002 |
| 0.5225347222222222 | 50.005 |
| 0.5225462962962962 | 50.004 |
| 0.5225578703703704 | 50.004 |
| 0.5225694444444444 | 50.007 |
| 0.5225810185185186 | 50.004 |
| 0.5225925925925926 | 50.002 |
| 0.5226041666666666 | 50.004 |
| 0.5226157407407407 | 50.007 |
| 0.5226273148148148 | 50.01 |
| 0.5226388888888889 | 50.01 |
| 0.522650462962963 | 50.012 |
| 0.5226620370370371 | 50.01 |
| 0.5226736111111111 | 50.012 |
| 0.5226851851851851 | 50.013 |
| 0.5226967592592593 | 50.011 |
| 0.5227083333333333 | 50.013 |
| 0.5227199074074075 | 50.014 |
| 0.5227314814814815 | 50.015 |
| 0.5227430555555556 | 50.016 |
| 0.5227546296296296 | 50.016 |
| 0.5227662037037036 | 50.01 |
| 0.5227777777777778 | 50.009 |
| 0.5227893518518518 | 50.009 |
| 0.522800925925926 | 50.007 |
| 0.5228125 | 50.005 |
| 0.522824074074074 | 50.007 |
| 0.5228356481481481 | 50.011 |
| 0.5228472222222222 | 50.016 |
| 0.5228587962962963 | 50.018 |
| 0.5228703703703704 | 50.021 |
| 0.5228819444444445 | 50.022 |
| 0.5228935185185185 | 50.025 |
| 0.5229050925925925 | 50.021 |
| 0.5229166666666667 | 50.018 |
| 0.5229282407407407 | 50.014 |
| 0.5229398148148149 | 50.011 |
| 0.5229513888888889 | 50.009 |
| 0.522962962962963 | 50.008 |
| 0.522974537037037 | 50.01 |
| 0.522986111111111 | 50.008 |
| 0.5229976851851852 | 50.007 |
| 0.5230092592592592 | 50.01 |
| 0.5230208333333334 | 50.012 |
| 0.5230324074074074 | 50.015 |
| 0.5230439814814815 | 50.014 |
| 0.5230555555555555 | 50.015 |
| 0.5230671296296296 | 50.021 |
| 0.5230787037037037 | 50.023 |
| 0.5230902777777778 | 50.024 |
| 0.5231018518518519 | 50.025 |
| 0.5231134259259259 | 50.026 |
| 0.523125 | 50.027 |
| 0.5231365740740741 | 50.028 |
| 0.5231481481481481 | 50.028 |
| 0.5231597222222223 | 50.023 |
| 0.5231712962962963 | 50.018 |
| 0.5231828703703704 | 50.017 |
| 0.5231944444444444 | 50.017 |
| 0.5232060185185184 | 50.014 |
| 0.5232175925925926 | 50.012 |
| 0.5232291666666666 | 50.008 |
| 0.5232407407407408 | 50.002 |
| 0.5232523148148148 | 50 |
| 0.5232638888888889 | 49.997 |
| 0.5232754629629629 | 49.995 |
| 0.523287037037037 | 49.998 |
| 0.5232986111111111 | 49.998 |
| 0.5233101851851852 | 49.994 |
| 0.5233217592592593 | 49.996 |
| 0.5233333333333333 | 49.998 |
| 0.5233449074074074 | 49.995 |
| 0.5233564814814815 | 49.991 |
| 0.5233680555555555 | 49.988 |
| 0.5233796296296297 | 49.986 |
| 0.5233912037037037 | 49.981 |
| 0.5234027777777778 | 49.981 |
| 0.5234143518518518 | 49.985 |
| 0.523425925925926 | 49.991 |
| 0.5234375 | 49.992 |
| 0.523449074074074 | 49.993 |
| 0.5234606481481482 | 49.996 |
| 0.5234722222222222 | 50 |
| 0.5234837962962963 | 50.006 |
| 0.5234953703703703 | 50.009 |
| 0.5235069444444445 | 50.011 |
| 0.5235185185185185 | 50.009 |
| 0.5235300925925926 | 50.005 |
| 0.5235416666666667 | 50.002 |
| 0.5235532407407407 | 49.998 |
| 0.5235648148148148 | 49.998 |
| 0.5235763888888889 | 49.996 |
| 0.523587962962963 | 49.995 |
| 0.5235995370370371 | 49.995 |
| 0.5236111111111111 | 49.994 |
| 0.5236226851851852 | 49.988 |
| 0.5236342592592592 | 49.988 |
| 0.5236458333333334 | 49.993 |
| 0.5236574074074074 | 49.995 |
| 0.5236689814814816 | 49.997 |
| 0.5236805555555556 | 50.002 |
| 0.5236921296296296 | 50.007 |
| 0.5237037037037037 | 50.01 |
| 0.5237152777777777 | 50.007 |
| 0.5237268518518519 | 50.006 |
| 0.5237384259259259 | 50.005 |
| 0.52375 | 50.003 |
| 0.5237615740740741 | 49.996 |
| 0.5237731481481481 | 49.987 |
| 0.5237847222222222 | 49.979 |
| 0.5237962962962963 | 49.976 |
| 0.5238078703703704 | 49.978 |
| 0.5238194444444445 | 49.98 |
| 0.5238310185185185 | 49.98 |
| 0.5238425925925926 | 49.983 |
| 0.5238541666666666 | 49.984 |
| 0.5238657407407408 | 49.983 |
| 0.5238773148148148 | 49.984 |
| 0.523888888888889 | 49.98 |
| 0.523900462962963 | 49.979 |
| 0.523912037037037 | 49.986 |
| 0.5239236111111111 | 49.988 |
| 0.5239351851851851 | 49.992 |
| 0.5239467592592593 | 49.995 |
| 0.5239583333333333 | 49.997 |
| 0.5239699074074075 | 49.994 |
| 0.5239814814814815 | 49.987 |
| 0.5239930555555555 | 49.984 |
| 0.5240046296296296 | 49.982 |
| 0.5240162037037037 | 49.981 |
| 0.5240277777777778 | 49.979 |
| 0.5240393518518519 | 49.979 |
| 0.524050925925926 | 49.983 |
| 0.5240625 | 49.983 |
| 0.524074074074074 | 49.986 |
| 0.5240856481481482 | 49.988 |
| 0.5240972222222222 | 49.991 |
| 0.5241087962962964 | 49.998 |
| 0.5241203703703704 | 49.999 |
| 0.5241319444444444 | 49.998 |
| 0.5241435185185185 | 50.001 |
| 0.5241550925925925 | 49.996 |
| 0.5241666666666667 | 49.994 |
| 0.5241782407407407 | 49.993 |
| 0.5241898148148149 | 49.987 |
| 0.5242013888888889 | 49.987 |
| 0.5242129629629629 | 49.984 |
| 0.524224537037037 | 49.985 |
| 0.5242361111111111 | 49.984 |
| 0.5242476851851852 | 49.989 |
| 0.5242592592592593 | 49.993 |
| 0.5242708333333334 | 49.998 |
| 0.5242824074074074 | 49.999 |
| 0.5242939814814814 | 49.996 |
| 0.5243055555555556 | 49.999 |
| 0.5243171296296296 | 49.995 |
| 0.5243287037037038 | 49.991 |
| 0.5243402777777778 | 49.986 |
| 0.5243518518518518 | 49.984 |
| 0.5243634259259259 | 49.981 |
| 0.524375 | 49.983 |
| 0.5243865740740741 | 49.983 |
| 0.5243981481481481 | 49.986 |
| 0.5244097222222223 | 49.989 |
| 0.5244212962962963 | 49.987 |
| 0.5244328703703703 | 49.982 |
| 0.5244444444444444 | 49.982 |
| 0.5244560185185185 | 49.983 |
| 0.5244675925925926 | 49.984 |
| 0.5244791666666667 | 49.982 |
| 0.5244907407407408 | 49.983 |
| 0.5245023148148148 | 49.981 |
| 0.5245138888888888 | 49.98 |
| 0.524525462962963 | 49.977 |
| 0.524537037037037 | 49.984 |
| 0.5245486111111112 | 49.989 |
| 0.5245601851851852 | 49.99 |
| 0.5245717592592593 | 49.994 |
| 0.5245833333333333 | 49.994 |
| 0.5245949074074074 | 49.998 |
| 0.5246064814814815 | 49.997 |
| 0.5246180555555556 | 49.999 |
| 0.5246296296296297 | 50.001 |
| 0.5246412037037037 | 50.007 |
| 0.5246527777777777 | 50.004 |
| 0.5246643518518518 | 50.001 |
| 0.5246759259259259 | 50.003 |
| 0.5246875 | 49.999 |
| 0.5246990740740741 | 50.001 |
| 0.5247106481481482 | 49.999 |
| 0.5247222222222222 | 49.997 |
| 0.5247337962962962 | 49.996 |
| 0.5247453703703704 | 49.994 |
| 0.5247569444444444 | 49.991 |
| 0.5247685185185186 | 49.992 |
| 0.5247800925925926 | 49.991 |
| 0.5247916666666667 | 49.988 |
| 0.5248032407407407 | 49.989 |
| 0.5248148148148148 | 49.99 |
| 0.5248263888888889 | 49.99 |
| 0.524837962962963 | 49.992 |
| 0.5248495370370371 | 49.996 |
| 0.5248611111111111 | 50.002 |
| 0.5248726851851852 | 50.009 |
| 0.5248842592592592 | 50.016 |
| 0.5248958333333333 | 50.02 |
| 0.5249074074074074 | 50.02 |
| 0.5249189814814815 | 50.018 |
| 0.5249305555555556 | 50.018 |
| 0.5249421296296296 | 50.016 |
| 0.5249537037037036 | 50.015 |
| 0.5249652777777778 | 50.011 |
| 0.5249768518518518 | 50.014 |
| 0.524988425925926 | 50.018 |
| 0.525 | 50.024 |
| 0.5250115740740741 | 50.017 |
| 0.5250231481481481 | 50.013 |
| 0.5250347222222222 | 50.013 |
| 0.5250462962962963 | 50.011 |
| 0.5250578703703704 | 50.008 |
| 0.5250694444444445 | 50.008 |
| 0.5250810185185185 | 50.012 |
| 0.5250925925925926 | 50.015 |
| 0.5251041666666666 | 50.016 |
| 0.5251157407407407 | 50.017 |
| 0.5251273148148148 | 50.019 |
| 0.5251388888888889 | 50.023 |
| 0.525150462962963 | 50.023 |
| 0.525162037037037 | 50.024 |
| 0.525173611111111 | 50.024 |
| 0.5251851851851852 | 50.026 |
| 0.5251967592592592 | 50.024 |
| 0.5252083333333334 | 50.022 |
| 0.5252199074074074 | 50.023 |
| 0.5252314814814815 | 50.018 |
| 0.5252430555555555 | 50.014 |
| 0.5252546296296297 | 50.02 |
| 0.5252662037037037 | 50.021 |
| 0.5252777777777778 | 50.02 |
| 0.5252893518518519 | 50.02 |
| 0.5253009259259259 | 50.027 |
| 0.5253125 | 50.032 |
| 0.5253240740740741 | 50.031 |
| 0.5253356481481481 | 50.029 |
| 0.5253472222222222 | 50.028 |
| 0.5253587962962963 | 50.024 |
| 0.5253703703703704 | 50.021 |
| 0.5253819444444444 | 50.017 |
| 0.5253935185185185 | 50.017 |
| 0.5254050925925926 | 50.017 |
| 0.5254166666666666 | 50.014 |
| 0.5254282407407408 | 50.013 |
| 0.5254398148148148 | 50.014 |
| 0.5254513888888889 | 50.015 |
| 0.5254629629629629 | 50.018 |
| 0.5254745370370371 | 50.017 |
| 0.5254861111111111 | 50.019 |
| 0.5254976851851852 | 50.018 |
| 0.5255092592592593 | 50.023 |
| 0.5255208333333333 | 50.024 |
| 0.5255324074074074 | 50.028 |
| 0.5255439814814815 | 50.026 |
| 0.5255555555555556 | 50.027 |
| 0.5255671296296297 | 50.026 |
| 0.5255787037037037 | 50.024 |
| 0.5255902777777778 | 50.023 |
| 0.5256018518518518 | 50.018 |
| 0.5256134259259259 | 50.019 |
| 0.525625 | 50.018 |
| 0.525636574074074 | 50.016 |
| 0.5256481481481482 | 50.017 |
| 0.5256597222222222 | 50.015 |
| 0.5256712962962963 | 50.011 |
| 0.5256828703703703 | 50.008 |
| 0.5256944444444445 | 50.005 |
| 0.5257060185185185 | 50.006 |
| 0.5257175925925927 | 50.006 |
| 0.5257291666666667 | 50.003 |
| 0.5257407407407407 | 49.997 |
| 0.5257523148148148 | 49.998 |
| 0.5257638888888889 | 49.999 |
| 0.525775462962963 | 50.003 |
| 0.5257870370370371 | 50.01 |
| 0.5257986111111111 | 50.01 |
| 0.5258101851851852 | 50.007 |
| 0.5258217592592592 | 50.001 |
| 0.5258333333333333 | 50 |
| 0.5258449074074074 | 49.997 |
| 0.5258564814814815 | 49.999 |
| 0.5258680555555556 | 49.991 |
| 0.5258796296296296 | 49.986 |
| 0.5258912037037037 | 49.984 |
| 0.5259027777777777 | 49.977 |
| 0.5259143518518519 | 49.975 |
| 0.5259259259259259 | 49.978 |
| 0.5259375000000001 | 49.98 |
| 0.5259490740740741 | 49.981 |
| 0.5259606481481481 | 49.981 |
| 0.5259722222222222 | 49.988 |
| 0.5259837962962963 | 49.993 |
| 0.5259953703703704 | 50.004 |
| 0.5260069444444445 | 50.013 |
| 0.5260185185185186 | 50.017 |
| 0.5260300925925926 | 50.017 |
| 0.5260416666666666 | 50.013 |
| 0.5260532407407407 | 50.014 |
| 0.5260648148148148 | 50.012 |
| 0.5260763888888889 | 50.01 |
| 0.526087962962963 | 50.004 |
| 0.526099537037037 | 50.006 |
| 0.5261111111111111 | 50.004 |
| 0.5261226851851851 | 50 |
| 0.5261342592592593 | 49.998 |
| 0.5261458333333333 | 49.995 |
| 0.5261574074074075 | 49.995 |
| 0.5261689814814815 | 49.989 |
| 0.5261805555555555 | 49.982 |
| 0.5261921296296296 | 49.98 |
| 0.5262037037037037 | 49.982 |
| 0.5262152777777778 | 49.979 |
| 0.5262268518518519 | 49.979 |
| 0.526238425925926 | 49.978 |
| 0.52625 | 49.981 |
| 0.526261574074074 | 49.977 |
| 0.5262731481481482 | 49.975 |
| 0.5262847222222222 | 49.97 |
| 0.5262962962962963 | 49.969 |
| 0.5263078703703704 | 49.968 |
| 0.5263194444444445 | 49.969 |
| 0.5263310185185185 | 49.974 |
| 0.5263425925925925 | 49.975 |
| 0.5263541666666667 | 49.972 |
| 0.5263657407407407 | 49.966 |
| 0.5263773148148149 | 49.965 |